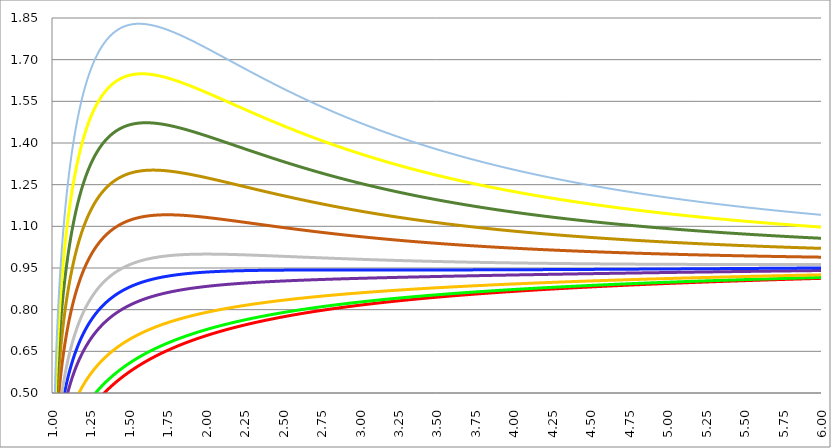
| Category | Series 1 | Series 0 | Series 3 | Series 4 | Series 5 | Series 2 | Series 6 | Series 7 | Series 8 | Series 9 | Series 10 |
|---|---|---|---|---|---|---|---|---|---|---|---|
| 1.0 | 0 | 0 | 0 | 0 | 0 | 0 | 0 | 0 | 0 | 0 | 0 |
| 1.0025 | 0.05 | 0.056 | 0.071 | 0.09 | 0.1 | 0.111 | 0.134 | 0.158 | 0.181 | 0.205 | 0.23 |
| 1.005 | 0.071 | 0.079 | 0.1 | 0.127 | 0.141 | 0.157 | 0.189 | 0.222 | 0.256 | 0.289 | 0.324 |
| 1.0075 | 0.086 | 0.096 | 0.122 | 0.155 | 0.172 | 0.192 | 0.231 | 0.271 | 0.312 | 0.353 | 0.395 |
| 1.01 | 0.1 | 0.111 | 0.14 | 0.178 | 0.198 | 0.221 | 0.266 | 0.312 | 0.359 | 0.406 | 0.454 |
| 1.0125 | 0.111 | 0.124 | 0.156 | 0.199 | 0.22 | 0.246 | 0.296 | 0.347 | 0.4 | 0.453 | 0.506 |
| 1.015 | 0.122 | 0.136 | 0.171 | 0.217 | 0.24 | 0.269 | 0.323 | 0.379 | 0.436 | 0.494 | 0.553 |
| 1.0175 | 0.131 | 0.146 | 0.184 | 0.234 | 0.259 | 0.289 | 0.348 | 0.408 | 0.47 | 0.532 | 0.595 |
| 1.02 | 0.14 | 0.156 | 0.196 | 0.249 | 0.276 | 0.308 | 0.371 | 0.435 | 0.5 | 0.567 | 0.633 |
| 1.0225 | 0.148 | 0.165 | 0.207 | 0.263 | 0.292 | 0.326 | 0.392 | 0.46 | 0.529 | 0.599 | 0.669 |
| 1.024999999999999 | 0.156 | 0.174 | 0.218 | 0.277 | 0.307 | 0.342 | 0.412 | 0.483 | 0.556 | 0.629 | 0.703 |
| 1.027499999999999 | 0.164 | 0.182 | 0.228 | 0.289 | 0.321 | 0.358 | 0.43 | 0.505 | 0.581 | 0.658 | 0.735 |
| 1.029999999999999 | 0.171 | 0.19 | 0.238 | 0.301 | 0.334 | 0.373 | 0.448 | 0.526 | 0.605 | 0.684 | 0.765 |
| 1.032499999999999 | 0.177 | 0.197 | 0.247 | 0.313 | 0.346 | 0.387 | 0.465 | 0.545 | 0.627 | 0.71 | 0.793 |
| 1.034999999999999 | 0.184 | 0.204 | 0.256 | 0.324 | 0.358 | 0.4 | 0.481 | 0.564 | 0.648 | 0.734 | 0.82 |
| 1.037499999999999 | 0.19 | 0.211 | 0.264 | 0.334 | 0.37 | 0.413 | 0.496 | 0.582 | 0.669 | 0.757 | 0.846 |
| 1.039999999999999 | 0.196 | 0.218 | 0.272 | 0.344 | 0.381 | 0.425 | 0.511 | 0.599 | 0.689 | 0.779 | 0.871 |
| 1.042499999999999 | 0.202 | 0.224 | 0.28 | 0.354 | 0.392 | 0.437 | 0.525 | 0.615 | 0.707 | 0.801 | 0.895 |
| 1.044999999999999 | 0.208 | 0.23 | 0.287 | 0.363 | 0.402 | 0.448 | 0.538 | 0.631 | 0.725 | 0.821 | 0.917 |
| 1.047499999999999 | 0.213 | 0.236 | 0.294 | 0.372 | 0.411 | 0.459 | 0.551 | 0.646 | 0.743 | 0.841 | 0.939 |
| 1.049999999999999 | 0.218 | 0.242 | 0.301 | 0.381 | 0.421 | 0.469 | 0.564 | 0.661 | 0.759 | 0.859 | 0.96 |
| 1.052499999999999 | 0.223 | 0.247 | 0.308 | 0.389 | 0.43 | 0.48 | 0.576 | 0.675 | 0.776 | 0.878 | 0.981 |
| 1.054999999999999 | 0.228 | 0.253 | 0.315 | 0.397 | 0.439 | 0.489 | 0.587 | 0.688 | 0.791 | 0.895 | 1 |
| 1.057499999999999 | 0.233 | 0.258 | 0.321 | 0.405 | 0.447 | 0.499 | 0.599 | 0.701 | 0.806 | 0.912 | 1.019 |
| 1.059999999999999 | 0.238 | 0.263 | 0.327 | 0.412 | 0.456 | 0.508 | 0.609 | 0.714 | 0.821 | 0.929 | 1.038 |
| 1.062499999999999 | 0.243 | 0.268 | 0.333 | 0.42 | 0.464 | 0.517 | 0.62 | 0.726 | 0.835 | 0.945 | 1.055 |
| 1.064999999999999 | 0.247 | 0.273 | 0.339 | 0.427 | 0.472 | 0.526 | 0.63 | 0.738 | 0.849 | 0.96 | 1.073 |
| 1.067499999999999 | 0.251 | 0.278 | 0.345 | 0.434 | 0.479 | 0.534 | 0.64 | 0.75 | 0.862 | 0.975 | 1.089 |
| 1.069999999999998 | 0.256 | 0.282 | 0.35 | 0.44 | 0.487 | 0.542 | 0.65 | 0.761 | 0.875 | 0.99 | 1.106 |
| 1.072499999999998 | 0.26 | 0.287 | 0.355 | 0.447 | 0.494 | 0.55 | 0.659 | 0.772 | 0.887 | 1.004 | 1.121 |
| 1.074999999999998 | 0.264 | 0.291 | 0.361 | 0.453 | 0.501 | 0.558 | 0.669 | 0.783 | 0.9 | 1.018 | 1.137 |
| 1.077499999999998 | 0.268 | 0.296 | 0.366 | 0.46 | 0.508 | 0.565 | 0.678 | 0.793 | 0.911 | 1.031 | 1.152 |
| 1.079999999999998 | 0.272 | 0.3 | 0.371 | 0.466 | 0.514 | 0.573 | 0.686 | 0.804 | 0.923 | 1.044 | 1.166 |
| 1.082499999999998 | 0.276 | 0.304 | 0.376 | 0.472 | 0.521 | 0.58 | 0.695 | 0.813 | 0.934 | 1.057 | 1.18 |
| 1.084999999999998 | 0.28 | 0.308 | 0.381 | 0.478 | 0.527 | 0.587 | 0.703 | 0.823 | 0.945 | 1.069 | 1.194 |
| 1.087499999999998 | 0.284 | 0.312 | 0.385 | 0.483 | 0.533 | 0.594 | 0.711 | 0.832 | 0.956 | 1.081 | 1.208 |
| 1.089999999999998 | 0.287 | 0.316 | 0.39 | 0.489 | 0.539 | 0.6 | 0.719 | 0.841 | 0.966 | 1.093 | 1.221 |
| 1.092499999999998 | 0.291 | 0.32 | 0.394 | 0.494 | 0.545 | 0.607 | 0.727 | 0.85 | 0.977 | 1.104 | 1.233 |
| 1.094999999999998 | 0.295 | 0.324 | 0.399 | 0.5 | 0.551 | 0.613 | 0.734 | 0.859 | 0.986 | 1.116 | 1.246 |
| 1.097499999999998 | 0.298 | 0.328 | 0.403 | 0.505 | 0.557 | 0.62 | 0.741 | 0.868 | 0.996 | 1.126 | 1.258 |
| 1.099999999999998 | 0.302 | 0.331 | 0.407 | 0.51 | 0.562 | 0.626 | 0.749 | 0.876 | 1.006 | 1.137 | 1.27 |
| 1.102499999999998 | 0.305 | 0.335 | 0.412 | 0.515 | 0.568 | 0.632 | 0.756 | 0.884 | 1.015 | 1.148 | 1.281 |
| 1.104999999999998 | 0.308 | 0.338 | 0.416 | 0.52 | 0.573 | 0.637 | 0.763 | 0.892 | 1.024 | 1.158 | 1.293 |
| 1.107499999999998 | 0.312 | 0.342 | 0.42 | 0.525 | 0.578 | 0.643 | 0.769 | 0.9 | 1.033 | 1.168 | 1.304 |
| 1.109999999999998 | 0.315 | 0.345 | 0.424 | 0.529 | 0.583 | 0.649 | 0.776 | 0.907 | 1.041 | 1.177 | 1.314 |
| 1.112499999999998 | 0.318 | 0.349 | 0.428 | 0.534 | 0.588 | 0.654 | 0.782 | 0.915 | 1.05 | 1.187 | 1.325 |
| 1.114999999999998 | 0.321 | 0.352 | 0.431 | 0.538 | 0.593 | 0.66 | 0.788 | 0.922 | 1.058 | 1.196 | 1.335 |
| 1.117499999999997 | 0.324 | 0.355 | 0.435 | 0.543 | 0.598 | 0.665 | 0.795 | 0.929 | 1.066 | 1.205 | 1.345 |
| 1.119999999999997 | 0.327 | 0.358 | 0.439 | 0.547 | 0.603 | 0.67 | 0.801 | 0.936 | 1.074 | 1.214 | 1.355 |
| 1.122499999999997 | 0.33 | 0.362 | 0.442 | 0.551 | 0.607 | 0.675 | 0.807 | 0.943 | 1.082 | 1.223 | 1.365 |
| 1.124999999999997 | 0.333 | 0.365 | 0.446 | 0.556 | 0.612 | 0.68 | 0.812 | 0.949 | 1.089 | 1.231 | 1.374 |
| 1.127499999999997 | 0.336 | 0.368 | 0.449 | 0.56 | 0.616 | 0.685 | 0.818 | 0.956 | 1.097 | 1.239 | 1.384 |
| 1.129999999999997 | 0.339 | 0.371 | 0.453 | 0.564 | 0.621 | 0.69 | 0.823 | 0.962 | 1.104 | 1.248 | 1.393 |
| 1.132499999999997 | 0.342 | 0.374 | 0.456 | 0.568 | 0.625 | 0.694 | 0.829 | 0.969 | 1.111 | 1.256 | 1.402 |
| 1.134999999999997 | 0.345 | 0.377 | 0.46 | 0.572 | 0.629 | 0.699 | 0.834 | 0.975 | 1.118 | 1.263 | 1.41 |
| 1.137499999999997 | 0.348 | 0.38 | 0.463 | 0.575 | 0.633 | 0.703 | 0.84 | 0.981 | 1.125 | 1.271 | 1.419 |
| 1.139999999999997 | 0.35 | 0.383 | 0.466 | 0.579 | 0.637 | 0.708 | 0.845 | 0.987 | 1.132 | 1.279 | 1.427 |
| 1.142499999999997 | 0.353 | 0.386 | 0.469 | 0.583 | 0.641 | 0.712 | 0.85 | 0.992 | 1.138 | 1.286 | 1.435 |
| 1.144999999999997 | 0.356 | 0.388 | 0.472 | 0.586 | 0.645 | 0.716 | 0.855 | 0.998 | 1.145 | 1.293 | 1.443 |
| 1.147499999999997 | 0.359 | 0.391 | 0.476 | 0.59 | 0.649 | 0.72 | 0.859 | 1.004 | 1.151 | 1.3 | 1.451 |
| 1.149999999999997 | 0.361 | 0.394 | 0.479 | 0.594 | 0.653 | 0.725 | 0.864 | 1.009 | 1.157 | 1.307 | 1.459 |
| 1.152499999999997 | 0.364 | 0.397 | 0.482 | 0.597 | 0.657 | 0.729 | 0.869 | 1.014 | 1.163 | 1.314 | 1.466 |
| 1.154999999999997 | 0.366 | 0.399 | 0.485 | 0.6 | 0.66 | 0.733 | 0.873 | 1.02 | 1.169 | 1.321 | 1.474 |
| 1.157499999999997 | 0.369 | 0.402 | 0.487 | 0.604 | 0.664 | 0.736 | 0.878 | 1.025 | 1.175 | 1.327 | 1.481 |
| 1.159999999999997 | 0.371 | 0.404 | 0.49 | 0.607 | 0.667 | 0.74 | 0.882 | 1.03 | 1.181 | 1.333 | 1.488 |
| 1.162499999999997 | 0.374 | 0.407 | 0.493 | 0.61 | 0.671 | 0.744 | 0.887 | 1.035 | 1.186 | 1.34 | 1.495 |
| 1.164999999999996 | 0.376 | 0.41 | 0.496 | 0.614 | 0.674 | 0.748 | 0.891 | 1.04 | 1.192 | 1.346 | 1.502 |
| 1.167499999999996 | 0.379 | 0.412 | 0.499 | 0.617 | 0.678 | 0.751 | 0.895 | 1.044 | 1.197 | 1.352 | 1.508 |
| 1.169999999999996 | 0.381 | 0.415 | 0.501 | 0.62 | 0.681 | 0.755 | 0.899 | 1.049 | 1.202 | 1.358 | 1.515 |
| 1.172499999999996 | 0.384 | 0.417 | 0.504 | 0.623 | 0.684 | 0.758 | 0.903 | 1.054 | 1.208 | 1.364 | 1.521 |
| 1.174999999999996 | 0.386 | 0.419 | 0.507 | 0.626 | 0.687 | 0.762 | 0.907 | 1.058 | 1.213 | 1.369 | 1.528 |
| 1.177499999999996 | 0.388 | 0.422 | 0.509 | 0.629 | 0.691 | 0.765 | 0.911 | 1.063 | 1.218 | 1.375 | 1.534 |
| 1.179999999999996 | 0.391 | 0.424 | 0.512 | 0.632 | 0.694 | 0.769 | 0.915 | 1.067 | 1.223 | 1.38 | 1.54 |
| 1.182499999999996 | 0.393 | 0.427 | 0.514 | 0.635 | 0.697 | 0.772 | 0.919 | 1.071 | 1.227 | 1.386 | 1.546 |
| 1.184999999999996 | 0.395 | 0.429 | 0.517 | 0.637 | 0.7 | 0.775 | 0.922 | 1.076 | 1.232 | 1.391 | 1.552 |
| 1.187499999999996 | 0.397 | 0.431 | 0.519 | 0.64 | 0.703 | 0.778 | 0.926 | 1.08 | 1.237 | 1.396 | 1.557 |
| 1.189999999999996 | 0.4 | 0.433 | 0.522 | 0.643 | 0.706 | 0.781 | 0.93 | 1.084 | 1.241 | 1.401 | 1.563 |
| 1.192499999999996 | 0.402 | 0.436 | 0.524 | 0.646 | 0.709 | 0.785 | 0.933 | 1.088 | 1.246 | 1.406 | 1.568 |
| 1.194999999999996 | 0.404 | 0.438 | 0.527 | 0.648 | 0.711 | 0.788 | 0.937 | 1.092 | 1.25 | 1.411 | 1.574 |
| 1.197499999999996 | 0.406 | 0.44 | 0.529 | 0.651 | 0.714 | 0.791 | 0.94 | 1.095 | 1.255 | 1.416 | 1.579 |
| 1.199999999999996 | 0.408 | 0.442 | 0.531 | 0.654 | 0.717 | 0.793 | 0.943 | 1.099 | 1.259 | 1.421 | 1.584 |
| 1.202499999999996 | 0.41 | 0.444 | 0.534 | 0.656 | 0.72 | 0.796 | 0.947 | 1.103 | 1.263 | 1.425 | 1.59 |
| 1.204999999999996 | 0.412 | 0.447 | 0.536 | 0.659 | 0.722 | 0.799 | 0.95 | 1.107 | 1.267 | 1.43 | 1.595 |
| 1.207499999999996 | 0.415 | 0.449 | 0.538 | 0.661 | 0.725 | 0.802 | 0.953 | 1.11 | 1.271 | 1.434 | 1.6 |
| 1.209999999999996 | 0.417 | 0.451 | 0.54 | 0.664 | 0.727 | 0.805 | 0.956 | 1.114 | 1.275 | 1.439 | 1.604 |
| 1.212499999999995 | 0.419 | 0.453 | 0.543 | 0.666 | 0.73 | 0.808 | 0.959 | 1.117 | 1.279 | 1.443 | 1.609 |
| 1.214999999999995 | 0.421 | 0.455 | 0.545 | 0.668 | 0.733 | 0.81 | 0.962 | 1.121 | 1.283 | 1.447 | 1.614 |
| 1.217499999999995 | 0.423 | 0.457 | 0.547 | 0.671 | 0.735 | 0.813 | 0.965 | 1.124 | 1.286 | 1.452 | 1.618 |
| 1.219999999999995 | 0.425 | 0.459 | 0.549 | 0.673 | 0.737 | 0.815 | 0.968 | 1.127 | 1.29 | 1.456 | 1.623 |
| 1.222499999999995 | 0.427 | 0.461 | 0.551 | 0.675 | 0.74 | 0.818 | 0.971 | 1.131 | 1.294 | 1.46 | 1.627 |
| 1.224999999999995 | 0.429 | 0.463 | 0.553 | 0.678 | 0.742 | 0.821 | 0.974 | 1.134 | 1.297 | 1.464 | 1.632 |
| 1.227499999999995 | 0.431 | 0.465 | 0.555 | 0.68 | 0.745 | 0.823 | 0.977 | 1.137 | 1.301 | 1.467 | 1.636 |
| 1.229999999999995 | 0.432 | 0.467 | 0.557 | 0.682 | 0.747 | 0.825 | 0.98 | 1.14 | 1.304 | 1.471 | 1.64 |
| 1.232499999999995 | 0.434 | 0.469 | 0.559 | 0.684 | 0.749 | 0.828 | 0.982 | 1.143 | 1.308 | 1.475 | 1.644 |
| 1.234999999999995 | 0.436 | 0.471 | 0.561 | 0.686 | 0.751 | 0.83 | 0.985 | 1.146 | 1.311 | 1.479 | 1.648 |
| 1.237499999999995 | 0.438 | 0.472 | 0.563 | 0.688 | 0.754 | 0.833 | 0.988 | 1.149 | 1.314 | 1.482 | 1.652 |
| 1.239999999999995 | 0.44 | 0.474 | 0.565 | 0.69 | 0.756 | 0.835 | 0.99 | 1.152 | 1.317 | 1.486 | 1.656 |
| 1.242499999999995 | 0.442 | 0.476 | 0.567 | 0.693 | 0.758 | 0.837 | 0.993 | 1.155 | 1.321 | 1.489 | 1.66 |
| 1.244999999999995 | 0.444 | 0.478 | 0.569 | 0.695 | 0.76 | 0.839 | 0.995 | 1.157 | 1.324 | 1.493 | 1.664 |
| 1.247499999999995 | 0.445 | 0.48 | 0.571 | 0.697 | 0.762 | 0.842 | 0.998 | 1.16 | 1.327 | 1.496 | 1.667 |
| 1.249999999999995 | 0.447 | 0.482 | 0.573 | 0.699 | 0.764 | 0.844 | 1 | 1.163 | 1.33 | 1.499 | 1.671 |
| 1.252499999999995 | 0.449 | 0.483 | 0.575 | 0.701 | 0.766 | 0.846 | 1.002 | 1.165 | 1.333 | 1.503 | 1.674 |
| 1.254999999999995 | 0.451 | 0.485 | 0.576 | 0.702 | 0.768 | 0.848 | 1.005 | 1.168 | 1.335 | 1.506 | 1.678 |
| 1.257499999999994 | 0.453 | 0.487 | 0.578 | 0.704 | 0.77 | 0.85 | 1.007 | 1.171 | 1.338 | 1.509 | 1.681 |
| 1.259999999999994 | 0.454 | 0.489 | 0.58 | 0.706 | 0.772 | 0.852 | 1.009 | 1.173 | 1.341 | 1.512 | 1.685 |
| 1.262499999999994 | 0.456 | 0.49 | 0.582 | 0.708 | 0.774 | 0.854 | 1.012 | 1.176 | 1.344 | 1.515 | 1.688 |
| 1.264999999999994 | 0.458 | 0.492 | 0.583 | 0.71 | 0.776 | 0.856 | 1.014 | 1.178 | 1.347 | 1.518 | 1.691 |
| 1.267499999999994 | 0.459 | 0.494 | 0.585 | 0.712 | 0.778 | 0.858 | 1.016 | 1.18 | 1.349 | 1.521 | 1.694 |
| 1.269999999999994 | 0.461 | 0.496 | 0.587 | 0.714 | 0.78 | 0.86 | 1.018 | 1.183 | 1.352 | 1.524 | 1.698 |
| 1.272499999999994 | 0.463 | 0.497 | 0.589 | 0.715 | 0.782 | 0.862 | 1.02 | 1.185 | 1.354 | 1.526 | 1.701 |
| 1.274999999999994 | 0.464 | 0.499 | 0.59 | 0.717 | 0.783 | 0.864 | 1.022 | 1.187 | 1.357 | 1.529 | 1.704 |
| 1.277499999999994 | 0.466 | 0.5 | 0.592 | 0.719 | 0.785 | 0.866 | 1.024 | 1.19 | 1.359 | 1.532 | 1.707 |
| 1.279999999999994 | 0.468 | 0.502 | 0.594 | 0.721 | 0.787 | 0.868 | 1.026 | 1.192 | 1.362 | 1.535 | 1.71 |
| 1.282499999999994 | 0.469 | 0.504 | 0.595 | 0.722 | 0.789 | 0.869 | 1.028 | 1.194 | 1.364 | 1.537 | 1.712 |
| 1.284999999999994 | 0.471 | 0.505 | 0.597 | 0.724 | 0.79 | 0.871 | 1.03 | 1.196 | 1.366 | 1.54 | 1.715 |
| 1.287499999999994 | 0.473 | 0.507 | 0.598 | 0.726 | 0.792 | 0.873 | 1.032 | 1.198 | 1.369 | 1.542 | 1.718 |
| 1.289999999999994 | 0.474 | 0.509 | 0.6 | 0.727 | 0.794 | 0.875 | 1.034 | 1.2 | 1.371 | 1.545 | 1.721 |
| 1.292499999999994 | 0.476 | 0.51 | 0.601 | 0.729 | 0.795 | 0.876 | 1.036 | 1.202 | 1.373 | 1.547 | 1.723 |
| 1.294999999999994 | 0.477 | 0.512 | 0.603 | 0.73 | 0.797 | 0.878 | 1.038 | 1.204 | 1.375 | 1.55 | 1.726 |
| 1.297499999999994 | 0.479 | 0.513 | 0.605 | 0.732 | 0.799 | 0.88 | 1.039 | 1.206 | 1.378 | 1.552 | 1.728 |
| 1.299999999999994 | 0.48 | 0.515 | 0.606 | 0.733 | 0.8 | 0.881 | 1.041 | 1.208 | 1.38 | 1.554 | 1.731 |
| 1.302499999999994 | 0.482 | 0.516 | 0.608 | 0.735 | 0.802 | 0.883 | 1.043 | 1.21 | 1.382 | 1.556 | 1.733 |
| 1.304999999999993 | 0.483 | 0.518 | 0.609 | 0.737 | 0.803 | 0.885 | 1.045 | 1.212 | 1.384 | 1.559 | 1.736 |
| 1.307499999999993 | 0.485 | 0.519 | 0.611 | 0.738 | 0.805 | 0.886 | 1.046 | 1.214 | 1.386 | 1.561 | 1.738 |
| 1.309999999999993 | 0.486 | 0.521 | 0.612 | 0.74 | 0.806 | 0.888 | 1.048 | 1.216 | 1.388 | 1.563 | 1.74 |
| 1.312499999999993 | 0.488 | 0.522 | 0.613 | 0.741 | 0.808 | 0.889 | 1.05 | 1.217 | 1.39 | 1.565 | 1.743 |
| 1.314999999999993 | 0.489 | 0.524 | 0.615 | 0.742 | 0.809 | 0.891 | 1.051 | 1.219 | 1.392 | 1.567 | 1.745 |
| 1.317499999999993 | 0.491 | 0.525 | 0.616 | 0.744 | 0.811 | 0.892 | 1.053 | 1.221 | 1.393 | 1.569 | 1.747 |
| 1.319999999999993 | 0.492 | 0.527 | 0.618 | 0.745 | 0.812 | 0.894 | 1.055 | 1.223 | 1.395 | 1.571 | 1.749 |
| 1.322499999999993 | 0.494 | 0.528 | 0.619 | 0.747 | 0.814 | 0.895 | 1.056 | 1.224 | 1.397 | 1.573 | 1.751 |
| 1.324999999999993 | 0.495 | 0.529 | 0.62 | 0.748 | 0.815 | 0.897 | 1.058 | 1.226 | 1.399 | 1.575 | 1.753 |
| 1.327499999999993 | 0.497 | 0.531 | 0.622 | 0.749 | 0.817 | 0.898 | 1.059 | 1.227 | 1.401 | 1.577 | 1.755 |
| 1.329999999999993 | 0.498 | 0.532 | 0.623 | 0.751 | 0.818 | 0.9 | 1.061 | 1.229 | 1.402 | 1.579 | 1.757 |
| 1.332499999999993 | 0.5 | 0.534 | 0.625 | 0.752 | 0.819 | 0.901 | 1.062 | 1.231 | 1.404 | 1.581 | 1.759 |
| 1.334999999999993 | 0.501 | 0.535 | 0.626 | 0.753 | 0.821 | 0.902 | 1.063 | 1.232 | 1.406 | 1.582 | 1.761 |
| 1.337499999999993 | 0.502 | 0.536 | 0.627 | 0.755 | 0.822 | 0.904 | 1.065 | 1.234 | 1.407 | 1.584 | 1.763 |
| 1.339999999999993 | 0.504 | 0.538 | 0.629 | 0.756 | 0.823 | 0.905 | 1.066 | 1.235 | 1.409 | 1.586 | 1.765 |
| 1.342499999999993 | 0.505 | 0.539 | 0.63 | 0.757 | 0.824 | 0.906 | 1.068 | 1.237 | 1.41 | 1.587 | 1.767 |
| 1.344999999999993 | 0.506 | 0.54 | 0.631 | 0.759 | 0.826 | 0.908 | 1.069 | 1.238 | 1.412 | 1.589 | 1.769 |
| 1.347499999999993 | 0.508 | 0.542 | 0.632 | 0.76 | 0.827 | 0.909 | 1.07 | 1.239 | 1.413 | 1.591 | 1.77 |
| 1.349999999999992 | 0.509 | 0.543 | 0.634 | 0.761 | 0.828 | 0.91 | 1.072 | 1.241 | 1.415 | 1.592 | 1.772 |
| 1.352499999999992 | 0.511 | 0.544 | 0.635 | 0.762 | 0.829 | 0.911 | 1.073 | 1.242 | 1.416 | 1.594 | 1.774 |
| 1.354999999999992 | 0.512 | 0.546 | 0.636 | 0.764 | 0.831 | 0.913 | 1.074 | 1.243 | 1.418 | 1.595 | 1.775 |
| 1.357499999999992 | 0.513 | 0.547 | 0.637 | 0.765 | 0.832 | 0.914 | 1.075 | 1.245 | 1.419 | 1.597 | 1.777 |
| 1.359999999999992 | 0.514 | 0.548 | 0.639 | 0.766 | 0.833 | 0.915 | 1.077 | 1.246 | 1.421 | 1.598 | 1.778 |
| 1.362499999999992 | 0.516 | 0.549 | 0.64 | 0.767 | 0.834 | 0.916 | 1.078 | 1.247 | 1.422 | 1.6 | 1.78 |
| 1.364999999999992 | 0.517 | 0.551 | 0.641 | 0.768 | 0.835 | 0.917 | 1.079 | 1.249 | 1.423 | 1.601 | 1.781 |
| 1.367499999999992 | 0.518 | 0.552 | 0.642 | 0.769 | 0.837 | 0.918 | 1.08 | 1.25 | 1.424 | 1.603 | 1.783 |
| 1.369999999999992 | 0.52 | 0.553 | 0.643 | 0.771 | 0.838 | 0.92 | 1.081 | 1.251 | 1.426 | 1.604 | 1.784 |
| 1.372499999999992 | 0.521 | 0.554 | 0.645 | 0.772 | 0.839 | 0.921 | 1.083 | 1.252 | 1.427 | 1.605 | 1.786 |
| 1.374999999999992 | 0.522 | 0.556 | 0.646 | 0.773 | 0.84 | 0.922 | 1.084 | 1.253 | 1.428 | 1.606 | 1.787 |
| 1.377499999999992 | 0.523 | 0.557 | 0.647 | 0.774 | 0.841 | 0.923 | 1.085 | 1.255 | 1.429 | 1.608 | 1.788 |
| 1.379999999999992 | 0.525 | 0.558 | 0.648 | 0.775 | 0.842 | 0.924 | 1.086 | 1.256 | 1.431 | 1.609 | 1.79 |
| 1.382499999999992 | 0.526 | 0.559 | 0.649 | 0.776 | 0.843 | 0.925 | 1.087 | 1.257 | 1.432 | 1.61 | 1.791 |
| 1.384999999999992 | 0.527 | 0.561 | 0.65 | 0.777 | 0.844 | 0.926 | 1.088 | 1.258 | 1.433 | 1.611 | 1.792 |
| 1.387499999999992 | 0.528 | 0.562 | 0.651 | 0.778 | 0.845 | 0.927 | 1.089 | 1.259 | 1.434 | 1.613 | 1.794 |
| 1.389999999999992 | 0.53 | 0.563 | 0.653 | 0.779 | 0.846 | 0.928 | 1.09 | 1.26 | 1.435 | 1.614 | 1.795 |
| 1.392499999999992 | 0.531 | 0.564 | 0.654 | 0.78 | 0.847 | 0.929 | 1.091 | 1.261 | 1.436 | 1.615 | 1.796 |
| 1.394999999999992 | 0.532 | 0.565 | 0.655 | 0.781 | 0.848 | 0.93 | 1.092 | 1.262 | 1.437 | 1.616 | 1.797 |
| 1.397499999999991 | 0.533 | 0.566 | 0.656 | 0.782 | 0.849 | 0.931 | 1.093 | 1.263 | 1.438 | 1.617 | 1.798 |
| 1.399999999999991 | 0.535 | 0.568 | 0.657 | 0.783 | 0.85 | 0.932 | 1.094 | 1.264 | 1.439 | 1.618 | 1.799 |
| 1.402499999999991 | 0.536 | 0.569 | 0.658 | 0.784 | 0.851 | 0.933 | 1.095 | 1.265 | 1.44 | 1.619 | 1.8 |
| 1.404999999999991 | 0.537 | 0.57 | 0.659 | 0.785 | 0.852 | 0.934 | 1.096 | 1.266 | 1.441 | 1.62 | 1.801 |
| 1.407499999999991 | 0.538 | 0.571 | 0.66 | 0.786 | 0.853 | 0.935 | 1.097 | 1.267 | 1.442 | 1.621 | 1.802 |
| 1.409999999999991 | 0.539 | 0.572 | 0.661 | 0.787 | 0.854 | 0.936 | 1.098 | 1.268 | 1.443 | 1.622 | 1.803 |
| 1.412499999999991 | 0.54 | 0.573 | 0.662 | 0.788 | 0.855 | 0.937 | 1.099 | 1.269 | 1.444 | 1.623 | 1.804 |
| 1.414999999999991 | 0.542 | 0.574 | 0.663 | 0.789 | 0.856 | 0.938 | 1.099 | 1.269 | 1.445 | 1.624 | 1.805 |
| 1.417499999999991 | 0.543 | 0.575 | 0.664 | 0.79 | 0.857 | 0.939 | 1.1 | 1.27 | 1.446 | 1.625 | 1.806 |
| 1.419999999999991 | 0.544 | 0.577 | 0.665 | 0.791 | 0.858 | 0.939 | 1.101 | 1.271 | 1.447 | 1.626 | 1.807 |
| 1.422499999999991 | 0.545 | 0.578 | 0.666 | 0.792 | 0.859 | 0.94 | 1.102 | 1.272 | 1.447 | 1.627 | 1.808 |
| 1.424999999999991 | 0.546 | 0.579 | 0.667 | 0.793 | 0.86 | 0.941 | 1.103 | 1.273 | 1.448 | 1.627 | 1.809 |
| 1.427499999999991 | 0.547 | 0.58 | 0.668 | 0.794 | 0.86 | 0.942 | 1.104 | 1.274 | 1.449 | 1.628 | 1.81 |
| 1.429999999999991 | 0.548 | 0.581 | 0.669 | 0.795 | 0.861 | 0.943 | 1.104 | 1.274 | 1.45 | 1.629 | 1.811 |
| 1.432499999999991 | 0.549 | 0.582 | 0.67 | 0.796 | 0.862 | 0.944 | 1.105 | 1.275 | 1.451 | 1.63 | 1.811 |
| 1.434999999999991 | 0.551 | 0.583 | 0.671 | 0.796 | 0.863 | 0.944 | 1.106 | 1.276 | 1.451 | 1.63 | 1.812 |
| 1.437499999999991 | 0.552 | 0.584 | 0.672 | 0.797 | 0.864 | 0.945 | 1.107 | 1.277 | 1.452 | 1.631 | 1.813 |
| 1.439999999999991 | 0.553 | 0.585 | 0.673 | 0.798 | 0.865 | 0.946 | 1.107 | 1.277 | 1.453 | 1.632 | 1.814 |
| 1.442499999999991 | 0.554 | 0.586 | 0.674 | 0.799 | 0.865 | 0.947 | 1.108 | 1.278 | 1.454 | 1.633 | 1.814 |
| 1.44499999999999 | 0.555 | 0.587 | 0.675 | 0.8 | 0.866 | 0.948 | 1.109 | 1.279 | 1.454 | 1.633 | 1.815 |
| 1.44749999999999 | 0.556 | 0.588 | 0.676 | 0.801 | 0.867 | 0.948 | 1.11 | 1.279 | 1.455 | 1.634 | 1.816 |
| 1.44999999999999 | 0.557 | 0.589 | 0.677 | 0.802 | 0.868 | 0.949 | 1.11 | 1.28 | 1.456 | 1.635 | 1.816 |
| 1.45249999999999 | 0.558 | 0.59 | 0.678 | 0.802 | 0.869 | 0.95 | 1.111 | 1.281 | 1.456 | 1.635 | 1.817 |
| 1.45499999999999 | 0.559 | 0.591 | 0.679 | 0.803 | 0.869 | 0.951 | 1.112 | 1.281 | 1.457 | 1.636 | 1.818 |
| 1.45749999999999 | 0.56 | 0.592 | 0.679 | 0.804 | 0.87 | 0.951 | 1.112 | 1.282 | 1.457 | 1.636 | 1.818 |
| 1.45999999999999 | 0.561 | 0.593 | 0.68 | 0.805 | 0.871 | 0.952 | 1.113 | 1.283 | 1.458 | 1.637 | 1.819 |
| 1.46249999999999 | 0.562 | 0.594 | 0.681 | 0.806 | 0.872 | 0.953 | 1.114 | 1.283 | 1.459 | 1.638 | 1.819 |
| 1.46499999999999 | 0.563 | 0.595 | 0.682 | 0.806 | 0.872 | 0.953 | 1.114 | 1.284 | 1.459 | 1.638 | 1.82 |
| 1.46749999999999 | 0.564 | 0.596 | 0.683 | 0.807 | 0.873 | 0.954 | 1.115 | 1.284 | 1.46 | 1.639 | 1.82 |
| 1.46999999999999 | 0.565 | 0.597 | 0.684 | 0.808 | 0.874 | 0.955 | 1.116 | 1.285 | 1.46 | 1.639 | 1.821 |
| 1.47249999999999 | 0.566 | 0.598 | 0.685 | 0.809 | 0.875 | 0.955 | 1.116 | 1.286 | 1.461 | 1.64 | 1.821 |
| 1.47499999999999 | 0.567 | 0.599 | 0.686 | 0.809 | 0.875 | 0.956 | 1.117 | 1.286 | 1.461 | 1.64 | 1.822 |
| 1.47749999999999 | 0.568 | 0.6 | 0.686 | 0.81 | 0.876 | 0.957 | 1.117 | 1.287 | 1.462 | 1.641 | 1.822 |
| 1.47999999999999 | 0.569 | 0.601 | 0.687 | 0.811 | 0.877 | 0.957 | 1.118 | 1.287 | 1.462 | 1.641 | 1.823 |
| 1.48249999999999 | 0.57 | 0.602 | 0.688 | 0.812 | 0.877 | 0.958 | 1.118 | 1.288 | 1.463 | 1.642 | 1.823 |
| 1.48499999999999 | 0.571 | 0.603 | 0.689 | 0.812 | 0.878 | 0.959 | 1.119 | 1.288 | 1.463 | 1.642 | 1.824 |
| 1.48749999999999 | 0.572 | 0.604 | 0.69 | 0.813 | 0.879 | 0.959 | 1.12 | 1.289 | 1.464 | 1.642 | 1.824 |
| 1.48999999999999 | 0.573 | 0.605 | 0.691 | 0.814 | 0.879 | 0.96 | 1.12 | 1.289 | 1.464 | 1.643 | 1.824 |
| 1.492499999999989 | 0.574 | 0.606 | 0.691 | 0.814 | 0.88 | 0.96 | 1.121 | 1.29 | 1.464 | 1.643 | 1.825 |
| 1.494999999999989 | 0.575 | 0.607 | 0.692 | 0.815 | 0.881 | 0.961 | 1.121 | 1.29 | 1.465 | 1.644 | 1.825 |
| 1.497499999999989 | 0.576 | 0.608 | 0.693 | 0.816 | 0.881 | 0.962 | 1.122 | 1.291 | 1.465 | 1.644 | 1.825 |
| 1.499999999999989 | 0.577 | 0.609 | 0.694 | 0.816 | 0.882 | 0.962 | 1.122 | 1.291 | 1.466 | 1.644 | 1.826 |
| 1.502499999999989 | 0.578 | 0.609 | 0.695 | 0.817 | 0.883 | 0.963 | 1.123 | 1.291 | 1.466 | 1.645 | 1.826 |
| 1.504999999999989 | 0.579 | 0.61 | 0.695 | 0.818 | 0.883 | 0.963 | 1.123 | 1.292 | 1.466 | 1.645 | 1.826 |
| 1.507499999999989 | 0.58 | 0.611 | 0.696 | 0.819 | 0.884 | 0.964 | 1.124 | 1.292 | 1.467 | 1.645 | 1.827 |
| 1.509999999999989 | 0.581 | 0.612 | 0.697 | 0.819 | 0.884 | 0.965 | 1.124 | 1.293 | 1.467 | 1.646 | 1.827 |
| 1.512499999999989 | 0.582 | 0.613 | 0.698 | 0.82 | 0.885 | 0.965 | 1.125 | 1.293 | 1.467 | 1.646 | 1.827 |
| 1.514999999999989 | 0.583 | 0.614 | 0.699 | 0.82 | 0.886 | 0.966 | 1.125 | 1.293 | 1.468 | 1.646 | 1.827 |
| 1.517499999999989 | 0.584 | 0.615 | 0.699 | 0.821 | 0.886 | 0.966 | 1.125 | 1.294 | 1.468 | 1.646 | 1.828 |
| 1.519999999999989 | 0.585 | 0.616 | 0.7 | 0.822 | 0.887 | 0.967 | 1.126 | 1.294 | 1.468 | 1.647 | 1.828 |
| 1.522499999999989 | 0.586 | 0.617 | 0.701 | 0.822 | 0.887 | 0.967 | 1.126 | 1.294 | 1.469 | 1.647 | 1.828 |
| 1.524999999999989 | 0.587 | 0.617 | 0.702 | 0.823 | 0.888 | 0.968 | 1.127 | 1.295 | 1.469 | 1.647 | 1.828 |
| 1.527499999999989 | 0.588 | 0.618 | 0.702 | 0.824 | 0.888 | 0.968 | 1.127 | 1.295 | 1.469 | 1.647 | 1.828 |
| 1.529999999999989 | 0.589 | 0.619 | 0.703 | 0.824 | 0.889 | 0.969 | 1.128 | 1.295 | 1.469 | 1.647 | 1.828 |
| 1.532499999999989 | 0.589 | 0.62 | 0.704 | 0.825 | 0.89 | 0.969 | 1.128 | 1.296 | 1.47 | 1.648 | 1.829 |
| 1.534999999999989 | 0.59 | 0.621 | 0.705 | 0.825 | 0.89 | 0.97 | 1.128 | 1.296 | 1.47 | 1.648 | 1.829 |
| 1.537499999999989 | 0.591 | 0.622 | 0.705 | 0.826 | 0.891 | 0.97 | 1.129 | 1.296 | 1.47 | 1.648 | 1.829 |
| 1.539999999999988 | 0.592 | 0.623 | 0.706 | 0.827 | 0.891 | 0.971 | 1.129 | 1.297 | 1.47 | 1.648 | 1.829 |
| 1.542499999999988 | 0.593 | 0.623 | 0.707 | 0.827 | 0.892 | 0.971 | 1.129 | 1.297 | 1.471 | 1.648 | 1.829 |
| 1.544999999999988 | 0.594 | 0.624 | 0.707 | 0.828 | 0.892 | 0.972 | 1.13 | 1.297 | 1.471 | 1.648 | 1.829 |
| 1.547499999999988 | 0.595 | 0.625 | 0.708 | 0.828 | 0.893 | 0.972 | 1.13 | 1.297 | 1.471 | 1.649 | 1.829 |
| 1.549999999999988 | 0.596 | 0.626 | 0.709 | 0.829 | 0.893 | 0.972 | 1.13 | 1.298 | 1.471 | 1.649 | 1.829 |
| 1.552499999999988 | 0.597 | 0.627 | 0.71 | 0.83 | 0.894 | 0.973 | 1.131 | 1.298 | 1.471 | 1.649 | 1.829 |
| 1.554999999999988 | 0.597 | 0.628 | 0.71 | 0.83 | 0.894 | 0.973 | 1.131 | 1.298 | 1.471 | 1.649 | 1.829 |
| 1.557499999999988 | 0.598 | 0.628 | 0.711 | 0.831 | 0.895 | 0.974 | 1.131 | 1.298 | 1.472 | 1.649 | 1.829 |
| 1.559999999999988 | 0.599 | 0.629 | 0.712 | 0.831 | 0.895 | 0.974 | 1.132 | 1.299 | 1.472 | 1.649 | 1.829 |
| 1.562499999999988 | 0.6 | 0.63 | 0.712 | 0.832 | 0.896 | 0.975 | 1.132 | 1.299 | 1.472 | 1.649 | 1.829 |
| 1.564999999999988 | 0.601 | 0.631 | 0.713 | 0.832 | 0.896 | 0.975 | 1.132 | 1.299 | 1.472 | 1.649 | 1.829 |
| 1.567499999999988 | 0.602 | 0.632 | 0.714 | 0.833 | 0.897 | 0.975 | 1.133 | 1.299 | 1.472 | 1.649 | 1.829 |
| 1.569999999999988 | 0.603 | 0.632 | 0.714 | 0.833 | 0.897 | 0.976 | 1.133 | 1.299 | 1.472 | 1.649 | 1.829 |
| 1.572499999999988 | 0.603 | 0.633 | 0.715 | 0.834 | 0.898 | 0.976 | 1.133 | 1.3 | 1.472 | 1.649 | 1.829 |
| 1.574999999999988 | 0.604 | 0.634 | 0.716 | 0.834 | 0.898 | 0.977 | 1.134 | 1.3 | 1.472 | 1.649 | 1.829 |
| 1.577499999999988 | 0.605 | 0.635 | 0.716 | 0.835 | 0.899 | 0.977 | 1.134 | 1.3 | 1.472 | 1.649 | 1.829 |
| 1.579999999999988 | 0.606 | 0.635 | 0.717 | 0.835 | 0.899 | 0.977 | 1.134 | 1.3 | 1.473 | 1.649 | 1.829 |
| 1.582499999999988 | 0.607 | 0.636 | 0.718 | 0.836 | 0.899 | 0.978 | 1.134 | 1.3 | 1.473 | 1.649 | 1.829 |
| 1.584999999999988 | 0.608 | 0.637 | 0.718 | 0.836 | 0.9 | 0.978 | 1.135 | 1.301 | 1.473 | 1.649 | 1.829 |
| 1.587499999999987 | 0.608 | 0.638 | 0.719 | 0.837 | 0.9 | 0.979 | 1.135 | 1.301 | 1.473 | 1.649 | 1.829 |
| 1.589999999999987 | 0.609 | 0.639 | 0.72 | 0.837 | 0.901 | 0.979 | 1.135 | 1.301 | 1.473 | 1.649 | 1.828 |
| 1.592499999999987 | 0.61 | 0.639 | 0.72 | 0.838 | 0.901 | 0.979 | 1.135 | 1.301 | 1.473 | 1.649 | 1.828 |
| 1.594999999999987 | 0.611 | 0.64 | 0.721 | 0.838 | 0.902 | 0.98 | 1.136 | 1.301 | 1.473 | 1.649 | 1.828 |
| 1.597499999999987 | 0.612 | 0.641 | 0.722 | 0.839 | 0.902 | 0.98 | 1.136 | 1.301 | 1.473 | 1.649 | 1.828 |
| 1.599999999999987 | 0.612 | 0.642 | 0.722 | 0.839 | 0.902 | 0.98 | 1.136 | 1.301 | 1.473 | 1.649 | 1.828 |
| 1.602499999999987 | 0.613 | 0.642 | 0.723 | 0.84 | 0.903 | 0.981 | 1.136 | 1.301 | 1.473 | 1.649 | 1.828 |
| 1.604999999999987 | 0.614 | 0.643 | 0.723 | 0.84 | 0.903 | 0.981 | 1.136 | 1.302 | 1.473 | 1.649 | 1.828 |
| 1.607499999999987 | 0.615 | 0.644 | 0.724 | 0.841 | 0.904 | 0.981 | 1.137 | 1.302 | 1.473 | 1.649 | 1.827 |
| 1.609999999999987 | 0.616 | 0.645 | 0.725 | 0.841 | 0.904 | 0.982 | 1.137 | 1.302 | 1.473 | 1.649 | 1.827 |
| 1.612499999999987 | 0.616 | 0.645 | 0.725 | 0.842 | 0.904 | 0.982 | 1.137 | 1.302 | 1.473 | 1.648 | 1.827 |
| 1.614999999999987 | 0.617 | 0.646 | 0.726 | 0.842 | 0.905 | 0.982 | 1.137 | 1.302 | 1.473 | 1.648 | 1.827 |
| 1.617499999999987 | 0.618 | 0.647 | 0.726 | 0.843 | 0.905 | 0.983 | 1.137 | 1.302 | 1.473 | 1.648 | 1.827 |
| 1.619999999999987 | 0.619 | 0.647 | 0.727 | 0.843 | 0.906 | 0.983 | 1.138 | 1.302 | 1.473 | 1.648 | 1.826 |
| 1.622499999999987 | 0.619 | 0.648 | 0.728 | 0.844 | 0.906 | 0.983 | 1.138 | 1.302 | 1.473 | 1.648 | 1.826 |
| 1.624999999999987 | 0.62 | 0.649 | 0.728 | 0.844 | 0.906 | 0.983 | 1.138 | 1.302 | 1.473 | 1.648 | 1.826 |
| 1.627499999999987 | 0.621 | 0.65 | 0.729 | 0.844 | 0.907 | 0.984 | 1.138 | 1.302 | 1.473 | 1.648 | 1.826 |
| 1.629999999999986 | 0.622 | 0.65 | 0.729 | 0.845 | 0.907 | 0.984 | 1.138 | 1.302 | 1.473 | 1.647 | 1.825 |
| 1.632499999999986 | 0.622 | 0.651 | 0.73 | 0.845 | 0.908 | 0.984 | 1.138 | 1.302 | 1.473 | 1.647 | 1.825 |
| 1.634999999999986 | 0.623 | 0.652 | 0.731 | 0.846 | 0.908 | 0.985 | 1.139 | 1.302 | 1.472 | 1.647 | 1.825 |
| 1.637499999999986 | 0.624 | 0.652 | 0.731 | 0.846 | 0.908 | 0.985 | 1.139 | 1.302 | 1.472 | 1.647 | 1.825 |
| 1.639999999999986 | 0.625 | 0.653 | 0.732 | 0.847 | 0.909 | 0.985 | 1.139 | 1.302 | 1.472 | 1.647 | 1.824 |
| 1.642499999999986 | 0.625 | 0.654 | 0.732 | 0.847 | 0.909 | 0.985 | 1.139 | 1.302 | 1.472 | 1.647 | 1.824 |
| 1.644999999999986 | 0.626 | 0.654 | 0.733 | 0.847 | 0.909 | 0.986 | 1.139 | 1.302 | 1.472 | 1.646 | 1.824 |
| 1.647499999999986 | 0.627 | 0.655 | 0.733 | 0.848 | 0.91 | 0.986 | 1.139 | 1.302 | 1.472 | 1.646 | 1.824 |
| 1.649999999999986 | 0.628 | 0.656 | 0.734 | 0.848 | 0.91 | 0.986 | 1.139 | 1.302 | 1.472 | 1.646 | 1.823 |
| 1.652499999999986 | 0.628 | 0.657 | 0.734 | 0.849 | 0.91 | 0.987 | 1.14 | 1.302 | 1.472 | 1.646 | 1.823 |
| 1.654999999999986 | 0.629 | 0.657 | 0.735 | 0.849 | 0.911 | 0.987 | 1.14 | 1.302 | 1.472 | 1.645 | 1.823 |
| 1.657499999999986 | 0.63 | 0.658 | 0.736 | 0.849 | 0.911 | 0.987 | 1.14 | 1.302 | 1.472 | 1.645 | 1.822 |
| 1.659999999999986 | 0.631 | 0.659 | 0.736 | 0.85 | 0.911 | 0.987 | 1.14 | 1.302 | 1.471 | 1.645 | 1.822 |
| 1.662499999999986 | 0.631 | 0.659 | 0.737 | 0.85 | 0.912 | 0.988 | 1.14 | 1.302 | 1.471 | 1.645 | 1.822 |
| 1.664999999999986 | 0.632 | 0.66 | 0.737 | 0.851 | 0.912 | 0.988 | 1.14 | 1.302 | 1.471 | 1.645 | 1.821 |
| 1.667499999999986 | 0.633 | 0.661 | 0.738 | 0.851 | 0.912 | 0.988 | 1.14 | 1.302 | 1.471 | 1.644 | 1.821 |
| 1.669999999999986 | 0.633 | 0.661 | 0.738 | 0.851 | 0.913 | 0.988 | 1.14 | 1.302 | 1.471 | 1.644 | 1.821 |
| 1.672499999999986 | 0.634 | 0.662 | 0.739 | 0.852 | 0.913 | 0.988 | 1.14 | 1.302 | 1.471 | 1.644 | 1.82 |
| 1.674999999999986 | 0.635 | 0.662 | 0.739 | 0.852 | 0.913 | 0.989 | 1.14 | 1.302 | 1.471 | 1.644 | 1.82 |
| 1.677499999999985 | 0.636 | 0.663 | 0.74 | 0.853 | 0.913 | 0.989 | 1.141 | 1.302 | 1.47 | 1.643 | 1.819 |
| 1.679999999999985 | 0.636 | 0.664 | 0.74 | 0.853 | 0.914 | 0.989 | 1.141 | 1.302 | 1.47 | 1.643 | 1.819 |
| 1.682499999999985 | 0.637 | 0.664 | 0.741 | 0.853 | 0.914 | 0.989 | 1.141 | 1.302 | 1.47 | 1.643 | 1.819 |
| 1.684999999999985 | 0.638 | 0.665 | 0.741 | 0.854 | 0.914 | 0.99 | 1.141 | 1.302 | 1.47 | 1.642 | 1.818 |
| 1.687499999999985 | 0.638 | 0.666 | 0.742 | 0.854 | 0.915 | 0.99 | 1.141 | 1.302 | 1.47 | 1.642 | 1.818 |
| 1.689999999999985 | 0.639 | 0.666 | 0.742 | 0.854 | 0.915 | 0.99 | 1.141 | 1.302 | 1.47 | 1.642 | 1.817 |
| 1.692499999999985 | 0.64 | 0.667 | 0.743 | 0.855 | 0.915 | 0.99 | 1.141 | 1.302 | 1.469 | 1.641 | 1.817 |
| 1.694999999999985 | 0.64 | 0.668 | 0.743 | 0.855 | 0.916 | 0.99 | 1.141 | 1.302 | 1.469 | 1.641 | 1.817 |
| 1.697499999999985 | 0.641 | 0.668 | 0.744 | 0.855 | 0.916 | 0.991 | 1.141 | 1.302 | 1.469 | 1.641 | 1.816 |
| 1.699999999999985 | 0.642 | 0.669 | 0.744 | 0.856 | 0.916 | 0.991 | 1.141 | 1.302 | 1.469 | 1.641 | 1.816 |
| 1.702499999999985 | 0.642 | 0.669 | 0.745 | 0.856 | 0.916 | 0.991 | 1.141 | 1.301 | 1.469 | 1.64 | 1.815 |
| 1.704999999999985 | 0.643 | 0.67 | 0.745 | 0.856 | 0.917 | 0.991 | 1.141 | 1.301 | 1.468 | 1.64 | 1.815 |
| 1.707499999999985 | 0.644 | 0.671 | 0.746 | 0.857 | 0.917 | 0.991 | 1.141 | 1.301 | 1.468 | 1.64 | 1.814 |
| 1.709999999999985 | 0.644 | 0.671 | 0.746 | 0.857 | 0.917 | 0.992 | 1.141 | 1.301 | 1.468 | 1.639 | 1.814 |
| 1.712499999999985 | 0.645 | 0.672 | 0.747 | 0.857 | 0.917 | 0.992 | 1.141 | 1.301 | 1.468 | 1.639 | 1.814 |
| 1.714999999999985 | 0.646 | 0.673 | 0.747 | 0.858 | 0.918 | 0.992 | 1.141 | 1.301 | 1.467 | 1.639 | 1.813 |
| 1.717499999999985 | 0.646 | 0.673 | 0.748 | 0.858 | 0.918 | 0.992 | 1.141 | 1.301 | 1.467 | 1.638 | 1.813 |
| 1.719999999999985 | 0.647 | 0.674 | 0.748 | 0.858 | 0.918 | 0.992 | 1.141 | 1.301 | 1.467 | 1.638 | 1.812 |
| 1.722499999999985 | 0.648 | 0.674 | 0.749 | 0.859 | 0.918 | 0.992 | 1.141 | 1.301 | 1.467 | 1.637 | 1.812 |
| 1.724999999999984 | 0.648 | 0.675 | 0.749 | 0.859 | 0.919 | 0.993 | 1.142 | 1.301 | 1.466 | 1.637 | 1.811 |
| 1.727499999999984 | 0.649 | 0.676 | 0.75 | 0.859 | 0.919 | 0.993 | 1.142 | 1.3 | 1.466 | 1.637 | 1.811 |
| 1.729999999999984 | 0.65 | 0.676 | 0.75 | 0.86 | 0.919 | 0.993 | 1.142 | 1.3 | 1.466 | 1.636 | 1.81 |
| 1.732499999999984 | 0.65 | 0.677 | 0.751 | 0.86 | 0.919 | 0.993 | 1.142 | 1.3 | 1.466 | 1.636 | 1.81 |
| 1.734999999999984 | 0.651 | 0.677 | 0.751 | 0.86 | 0.92 | 0.993 | 1.142 | 1.3 | 1.465 | 1.636 | 1.809 |
| 1.737499999999984 | 0.652 | 0.678 | 0.752 | 0.861 | 0.92 | 0.993 | 1.142 | 1.3 | 1.465 | 1.635 | 1.809 |
| 1.739999999999984 | 0.652 | 0.679 | 0.752 | 0.861 | 0.92 | 0.994 | 1.142 | 1.3 | 1.465 | 1.635 | 1.808 |
| 1.742499999999984 | 0.653 | 0.679 | 0.753 | 0.861 | 0.92 | 0.994 | 1.142 | 1.3 | 1.465 | 1.634 | 1.808 |
| 1.744999999999984 | 0.653 | 0.68 | 0.753 | 0.862 | 0.921 | 0.994 | 1.142 | 1.3 | 1.464 | 1.634 | 1.807 |
| 1.747499999999984 | 0.654 | 0.68 | 0.754 | 0.862 | 0.921 | 0.994 | 1.142 | 1.299 | 1.464 | 1.634 | 1.807 |
| 1.749999999999984 | 0.655 | 0.681 | 0.754 | 0.862 | 0.921 | 0.994 | 1.142 | 1.299 | 1.464 | 1.633 | 1.806 |
| 1.752499999999984 | 0.655 | 0.681 | 0.754 | 0.863 | 0.921 | 0.994 | 1.142 | 1.299 | 1.464 | 1.633 | 1.806 |
| 1.754999999999984 | 0.656 | 0.682 | 0.755 | 0.863 | 0.922 | 0.994 | 1.142 | 1.299 | 1.463 | 1.632 | 1.805 |
| 1.757499999999984 | 0.657 | 0.683 | 0.755 | 0.863 | 0.922 | 0.995 | 1.142 | 1.299 | 1.463 | 1.632 | 1.805 |
| 1.759999999999984 | 0.657 | 0.683 | 0.756 | 0.863 | 0.922 | 0.995 | 1.142 | 1.299 | 1.463 | 1.632 | 1.804 |
| 1.762499999999984 | 0.658 | 0.684 | 0.756 | 0.864 | 0.922 | 0.995 | 1.142 | 1.298 | 1.462 | 1.631 | 1.804 |
| 1.764999999999984 | 0.658 | 0.684 | 0.757 | 0.864 | 0.922 | 0.995 | 1.141 | 1.298 | 1.462 | 1.631 | 1.803 |
| 1.767499999999984 | 0.659 | 0.685 | 0.757 | 0.864 | 0.923 | 0.995 | 1.141 | 1.298 | 1.462 | 1.63 | 1.802 |
| 1.769999999999984 | 0.66 | 0.685 | 0.758 | 0.865 | 0.923 | 0.995 | 1.141 | 1.298 | 1.462 | 1.63 | 1.802 |
| 1.772499999999983 | 0.66 | 0.686 | 0.758 | 0.865 | 0.923 | 0.995 | 1.141 | 1.298 | 1.461 | 1.63 | 1.801 |
| 1.774999999999983 | 0.661 | 0.686 | 0.758 | 0.865 | 0.923 | 0.995 | 1.141 | 1.298 | 1.461 | 1.629 | 1.801 |
| 1.777499999999983 | 0.661 | 0.687 | 0.759 | 0.865 | 0.923 | 0.996 | 1.141 | 1.297 | 1.461 | 1.629 | 1.8 |
| 1.779999999999983 | 0.662 | 0.688 | 0.759 | 0.866 | 0.924 | 0.996 | 1.141 | 1.297 | 1.46 | 1.628 | 1.8 |
| 1.782499999999983 | 0.663 | 0.688 | 0.76 | 0.866 | 0.924 | 0.996 | 1.141 | 1.297 | 1.46 | 1.628 | 1.799 |
| 1.784999999999983 | 0.663 | 0.689 | 0.76 | 0.866 | 0.924 | 0.996 | 1.141 | 1.297 | 1.46 | 1.627 | 1.799 |
| 1.787499999999983 | 0.664 | 0.689 | 0.761 | 0.866 | 0.924 | 0.996 | 1.141 | 1.297 | 1.459 | 1.627 | 1.798 |
| 1.789999999999983 | 0.664 | 0.69 | 0.761 | 0.867 | 0.924 | 0.996 | 1.141 | 1.297 | 1.459 | 1.626 | 1.797 |
| 1.792499999999983 | 0.665 | 0.69 | 0.761 | 0.867 | 0.925 | 0.996 | 1.141 | 1.296 | 1.459 | 1.626 | 1.797 |
| 1.794999999999983 | 0.666 | 0.691 | 0.762 | 0.867 | 0.925 | 0.996 | 1.141 | 1.296 | 1.458 | 1.625 | 1.796 |
| 1.797499999999983 | 0.666 | 0.691 | 0.762 | 0.868 | 0.925 | 0.996 | 1.141 | 1.296 | 1.458 | 1.625 | 1.796 |
| 1.799999999999983 | 0.667 | 0.692 | 0.763 | 0.868 | 0.925 | 0.997 | 1.141 | 1.296 | 1.458 | 1.625 | 1.795 |
| 1.802499999999983 | 0.667 | 0.692 | 0.763 | 0.868 | 0.925 | 0.997 | 1.141 | 1.296 | 1.457 | 1.624 | 1.794 |
| 1.804999999999983 | 0.668 | 0.693 | 0.763 | 0.868 | 0.926 | 0.997 | 1.141 | 1.295 | 1.457 | 1.624 | 1.794 |
| 1.807499999999983 | 0.668 | 0.693 | 0.764 | 0.869 | 0.926 | 0.997 | 1.141 | 1.295 | 1.457 | 1.623 | 1.793 |
| 1.809999999999983 | 0.669 | 0.694 | 0.764 | 0.869 | 0.926 | 0.997 | 1.141 | 1.295 | 1.456 | 1.623 | 1.793 |
| 1.812499999999983 | 0.67 | 0.695 | 0.765 | 0.869 | 0.926 | 0.997 | 1.141 | 1.295 | 1.456 | 1.622 | 1.792 |
| 1.814999999999983 | 0.67 | 0.695 | 0.765 | 0.869 | 0.926 | 0.997 | 1.141 | 1.295 | 1.456 | 1.622 | 1.791 |
| 1.817499999999983 | 0.671 | 0.696 | 0.765 | 0.87 | 0.926 | 0.997 | 1.141 | 1.294 | 1.455 | 1.621 | 1.791 |
| 1.819999999999982 | 0.671 | 0.696 | 0.766 | 0.87 | 0.927 | 0.997 | 1.14 | 1.294 | 1.455 | 1.621 | 1.79 |
| 1.822499999999982 | 0.672 | 0.697 | 0.766 | 0.87 | 0.927 | 0.997 | 1.14 | 1.294 | 1.455 | 1.62 | 1.79 |
| 1.824999999999982 | 0.672 | 0.697 | 0.767 | 0.87 | 0.927 | 0.997 | 1.14 | 1.294 | 1.454 | 1.62 | 1.789 |
| 1.827499999999982 | 0.673 | 0.698 | 0.767 | 0.871 | 0.927 | 0.998 | 1.14 | 1.293 | 1.454 | 1.619 | 1.788 |
| 1.829999999999982 | 0.673 | 0.698 | 0.767 | 0.871 | 0.927 | 0.998 | 1.14 | 1.293 | 1.453 | 1.619 | 1.788 |
| 1.832499999999982 | 0.674 | 0.699 | 0.768 | 0.871 | 0.927 | 0.998 | 1.14 | 1.293 | 1.453 | 1.618 | 1.787 |
| 1.834999999999982 | 0.675 | 0.699 | 0.768 | 0.871 | 0.928 | 0.998 | 1.14 | 1.293 | 1.453 | 1.618 | 1.787 |
| 1.837499999999982 | 0.675 | 0.7 | 0.769 | 0.871 | 0.928 | 0.998 | 1.14 | 1.293 | 1.452 | 1.617 | 1.786 |
| 1.839999999999982 | 0.676 | 0.7 | 0.769 | 0.872 | 0.928 | 0.998 | 1.14 | 1.292 | 1.452 | 1.617 | 1.785 |
| 1.842499999999982 | 0.676 | 0.701 | 0.769 | 0.872 | 0.928 | 0.998 | 1.14 | 1.292 | 1.452 | 1.616 | 1.785 |
| 1.844999999999982 | 0.677 | 0.701 | 0.77 | 0.872 | 0.928 | 0.998 | 1.14 | 1.292 | 1.451 | 1.616 | 1.784 |
| 1.847499999999982 | 0.677 | 0.702 | 0.77 | 0.872 | 0.928 | 0.998 | 1.14 | 1.292 | 1.451 | 1.615 | 1.783 |
| 1.849999999999982 | 0.678 | 0.702 | 0.771 | 0.873 | 0.929 | 0.998 | 1.14 | 1.291 | 1.451 | 1.615 | 1.783 |
| 1.852499999999982 | 0.678 | 0.703 | 0.771 | 0.873 | 0.929 | 0.998 | 1.139 | 1.291 | 1.45 | 1.614 | 1.782 |
| 1.854999999999982 | 0.679 | 0.703 | 0.771 | 0.873 | 0.929 | 0.998 | 1.139 | 1.291 | 1.45 | 1.614 | 1.781 |
| 1.857499999999982 | 0.679 | 0.704 | 0.772 | 0.873 | 0.929 | 0.998 | 1.139 | 1.291 | 1.449 | 1.613 | 1.781 |
| 1.859999999999982 | 0.68 | 0.704 | 0.772 | 0.874 | 0.929 | 0.998 | 1.139 | 1.29 | 1.449 | 1.613 | 1.78 |
| 1.862499999999982 | 0.681 | 0.705 | 0.772 | 0.874 | 0.929 | 0.999 | 1.139 | 1.29 | 1.449 | 1.612 | 1.779 |
| 1.864999999999982 | 0.681 | 0.705 | 0.773 | 0.874 | 0.929 | 0.999 | 1.139 | 1.29 | 1.448 | 1.612 | 1.779 |
| 1.867499999999981 | 0.682 | 0.706 | 0.773 | 0.874 | 0.93 | 0.999 | 1.139 | 1.29 | 1.448 | 1.611 | 1.778 |
| 1.869999999999981 | 0.682 | 0.706 | 0.773 | 0.874 | 0.93 | 0.999 | 1.139 | 1.289 | 1.447 | 1.611 | 1.777 |
| 1.872499999999981 | 0.683 | 0.707 | 0.774 | 0.875 | 0.93 | 0.999 | 1.139 | 1.289 | 1.447 | 1.61 | 1.777 |
| 1.874999999999981 | 0.683 | 0.707 | 0.774 | 0.875 | 0.93 | 0.999 | 1.139 | 1.289 | 1.447 | 1.61 | 1.776 |
| 1.877499999999981 | 0.684 | 0.707 | 0.775 | 0.875 | 0.93 | 0.999 | 1.138 | 1.289 | 1.446 | 1.609 | 1.775 |
| 1.879999999999981 | 0.684 | 0.708 | 0.775 | 0.875 | 0.93 | 0.999 | 1.138 | 1.288 | 1.446 | 1.608 | 1.775 |
| 1.882499999999981 | 0.685 | 0.708 | 0.775 | 0.875 | 0.93 | 0.999 | 1.138 | 1.288 | 1.445 | 1.608 | 1.774 |
| 1.884999999999981 | 0.685 | 0.709 | 0.776 | 0.876 | 0.931 | 0.999 | 1.138 | 1.288 | 1.445 | 1.607 | 1.773 |
| 1.887499999999981 | 0.686 | 0.709 | 0.776 | 0.876 | 0.931 | 0.999 | 1.138 | 1.288 | 1.445 | 1.607 | 1.773 |
| 1.889999999999981 | 0.686 | 0.71 | 0.776 | 0.876 | 0.931 | 0.999 | 1.138 | 1.287 | 1.444 | 1.606 | 1.772 |
| 1.892499999999981 | 0.687 | 0.71 | 0.777 | 0.876 | 0.931 | 0.999 | 1.138 | 1.287 | 1.444 | 1.606 | 1.771 |
| 1.894999999999981 | 0.687 | 0.711 | 0.777 | 0.876 | 0.931 | 0.999 | 1.138 | 1.287 | 1.443 | 1.605 | 1.771 |
| 1.897499999999981 | 0.688 | 0.711 | 0.777 | 0.877 | 0.931 | 0.999 | 1.138 | 1.287 | 1.443 | 1.605 | 1.77 |
| 1.899999999999981 | 0.688 | 0.712 | 0.778 | 0.877 | 0.931 | 0.999 | 1.137 | 1.286 | 1.443 | 1.604 | 1.769 |
| 1.902499999999981 | 0.689 | 0.712 | 0.778 | 0.877 | 0.931 | 0.999 | 1.137 | 1.286 | 1.442 | 1.604 | 1.769 |
| 1.904999999999981 | 0.689 | 0.713 | 0.778 | 0.877 | 0.932 | 0.999 | 1.137 | 1.286 | 1.442 | 1.603 | 1.768 |
| 1.907499999999981 | 0.69 | 0.713 | 0.779 | 0.877 | 0.932 | 0.999 | 1.137 | 1.286 | 1.441 | 1.602 | 1.767 |
| 1.909999999999981 | 0.69 | 0.714 | 0.779 | 0.878 | 0.932 | 0.999 | 1.137 | 1.285 | 1.441 | 1.602 | 1.767 |
| 1.912499999999981 | 0.691 | 0.714 | 0.779 | 0.878 | 0.932 | 0.999 | 1.137 | 1.285 | 1.441 | 1.601 | 1.766 |
| 1.91499999999998 | 0.691 | 0.714 | 0.78 | 0.878 | 0.932 | 0.999 | 1.137 | 1.285 | 1.44 | 1.601 | 1.765 |
| 1.91749999999998 | 0.692 | 0.715 | 0.78 | 0.878 | 0.932 | 1 | 1.137 | 1.284 | 1.44 | 1.6 | 1.765 |
| 1.91999999999998 | 0.692 | 0.715 | 0.78 | 0.878 | 0.932 | 1 | 1.136 | 1.284 | 1.439 | 1.6 | 1.764 |
| 1.92249999999998 | 0.693 | 0.716 | 0.781 | 0.879 | 0.932 | 1 | 1.136 | 1.284 | 1.439 | 1.599 | 1.763 |
| 1.92499999999998 | 0.693 | 0.716 | 0.781 | 0.879 | 0.932 | 1 | 1.136 | 1.284 | 1.438 | 1.599 | 1.762 |
| 1.92749999999998 | 0.694 | 0.717 | 0.781 | 0.879 | 0.933 | 1 | 1.136 | 1.283 | 1.438 | 1.598 | 1.762 |
| 1.92999999999998 | 0.694 | 0.717 | 0.782 | 0.879 | 0.933 | 1 | 1.136 | 1.283 | 1.438 | 1.597 | 1.761 |
| 1.93249999999998 | 0.695 | 0.718 | 0.782 | 0.879 | 0.933 | 1 | 1.136 | 1.283 | 1.437 | 1.597 | 1.76 |
| 1.93499999999998 | 0.695 | 0.718 | 0.782 | 0.88 | 0.933 | 1 | 1.136 | 1.282 | 1.437 | 1.596 | 1.76 |
| 1.93749999999998 | 0.696 | 0.718 | 0.783 | 0.88 | 0.933 | 1 | 1.136 | 1.282 | 1.436 | 1.596 | 1.759 |
| 1.93999999999998 | 0.696 | 0.719 | 0.783 | 0.88 | 0.933 | 1 | 1.135 | 1.282 | 1.436 | 1.595 | 1.758 |
| 1.94249999999998 | 0.697 | 0.719 | 0.783 | 0.88 | 0.933 | 1 | 1.135 | 1.282 | 1.435 | 1.595 | 1.758 |
| 1.94499999999998 | 0.697 | 0.72 | 0.784 | 0.88 | 0.933 | 1 | 1.135 | 1.281 | 1.435 | 1.594 | 1.757 |
| 1.94749999999998 | 0.698 | 0.72 | 0.784 | 0.88 | 0.933 | 1 | 1.135 | 1.281 | 1.435 | 1.593 | 1.756 |
| 1.94999999999998 | 0.698 | 0.721 | 0.784 | 0.881 | 0.934 | 1 | 1.135 | 1.281 | 1.434 | 1.593 | 1.755 |
| 1.95249999999998 | 0.698 | 0.721 | 0.785 | 0.881 | 0.934 | 1 | 1.135 | 1.28 | 1.434 | 1.592 | 1.755 |
| 1.95499999999998 | 0.699 | 0.721 | 0.785 | 0.881 | 0.934 | 1 | 1.135 | 1.28 | 1.433 | 1.592 | 1.754 |
| 1.95749999999998 | 0.699 | 0.722 | 0.785 | 0.881 | 0.934 | 1 | 1.134 | 1.28 | 1.433 | 1.591 | 1.753 |
| 1.95999999999998 | 0.7 | 0.722 | 0.786 | 0.881 | 0.934 | 1 | 1.134 | 1.28 | 1.432 | 1.591 | 1.753 |
| 1.962499999999979 | 0.7 | 0.723 | 0.786 | 0.881 | 0.934 | 1 | 1.134 | 1.279 | 1.432 | 1.59 | 1.752 |
| 1.964999999999979 | 0.701 | 0.723 | 0.786 | 0.882 | 0.934 | 1 | 1.134 | 1.279 | 1.431 | 1.589 | 1.751 |
| 1.967499999999979 | 0.701 | 0.724 | 0.787 | 0.882 | 0.934 | 1 | 1.134 | 1.279 | 1.431 | 1.589 | 1.75 |
| 1.969999999999979 | 0.702 | 0.724 | 0.787 | 0.882 | 0.934 | 1 | 1.134 | 1.278 | 1.431 | 1.588 | 1.75 |
| 1.972499999999979 | 0.702 | 0.724 | 0.787 | 0.882 | 0.934 | 1 | 1.134 | 1.278 | 1.43 | 1.588 | 1.749 |
| 1.974999999999979 | 0.703 | 0.725 | 0.788 | 0.882 | 0.935 | 1 | 1.133 | 1.278 | 1.43 | 1.587 | 1.748 |
| 1.977499999999979 | 0.703 | 0.725 | 0.788 | 0.882 | 0.935 | 1 | 1.133 | 1.277 | 1.429 | 1.586 | 1.748 |
| 1.979999999999979 | 0.704 | 0.726 | 0.788 | 0.883 | 0.935 | 1 | 1.133 | 1.277 | 1.429 | 1.586 | 1.747 |
| 1.982499999999979 | 0.704 | 0.726 | 0.788 | 0.883 | 0.935 | 1 | 1.133 | 1.277 | 1.428 | 1.585 | 1.746 |
| 1.984999999999979 | 0.704 | 0.726 | 0.789 | 0.883 | 0.935 | 1 | 1.133 | 1.277 | 1.428 | 1.585 | 1.745 |
| 1.987499999999979 | 0.705 | 0.727 | 0.789 | 0.883 | 0.935 | 1 | 1.133 | 1.276 | 1.427 | 1.584 | 1.745 |
| 1.989999999999979 | 0.705 | 0.727 | 0.789 | 0.883 | 0.935 | 1 | 1.133 | 1.276 | 1.427 | 1.584 | 1.744 |
| 1.992499999999979 | 0.706 | 0.728 | 0.79 | 0.883 | 0.935 | 1 | 1.132 | 1.276 | 1.427 | 1.583 | 1.743 |
| 1.994999999999979 | 0.706 | 0.728 | 0.79 | 0.884 | 0.935 | 1 | 1.132 | 1.275 | 1.426 | 1.582 | 1.743 |
| 1.997499999999979 | 0.707 | 0.728 | 0.79 | 0.884 | 0.935 | 1 | 1.132 | 1.275 | 1.426 | 1.582 | 1.742 |
| 1.999999999999979 | 0.707 | 0.729 | 0.791 | 0.884 | 0.935 | 1 | 1.132 | 1.275 | 1.425 | 1.581 | 1.741 |
| 2.002499999999979 | 0.708 | 0.729 | 0.791 | 0.884 | 0.935 | 1 | 1.132 | 1.274 | 1.425 | 1.581 | 1.74 |
| 2.004999999999979 | 0.708 | 0.73 | 0.791 | 0.884 | 0.936 | 1 | 1.132 | 1.274 | 1.424 | 1.58 | 1.74 |
| 2.007499999999979 | 0.708 | 0.73 | 0.791 | 0.884 | 0.936 | 1 | 1.131 | 1.274 | 1.424 | 1.579 | 1.739 |
| 2.009999999999978 | 0.709 | 0.73 | 0.792 | 0.884 | 0.936 | 1 | 1.131 | 1.274 | 1.423 | 1.579 | 1.738 |
| 2.012499999999978 | 0.709 | 0.731 | 0.792 | 0.885 | 0.936 | 1 | 1.131 | 1.273 | 1.423 | 1.578 | 1.737 |
| 2.014999999999978 | 0.71 | 0.731 | 0.792 | 0.885 | 0.936 | 1 | 1.131 | 1.273 | 1.422 | 1.578 | 1.737 |
| 2.017499999999978 | 0.71 | 0.732 | 0.793 | 0.885 | 0.936 | 1 | 1.131 | 1.273 | 1.422 | 1.577 | 1.736 |
| 2.019999999999978 | 0.711 | 0.732 | 0.793 | 0.885 | 0.936 | 1 | 1.131 | 1.272 | 1.422 | 1.576 | 1.735 |
| 2.022499999999978 | 0.711 | 0.732 | 0.793 | 0.885 | 0.936 | 1 | 1.13 | 1.272 | 1.421 | 1.576 | 1.734 |
| 2.024999999999978 | 0.711 | 0.733 | 0.793 | 0.885 | 0.936 | 1 | 1.13 | 1.272 | 1.421 | 1.575 | 1.734 |
| 2.027499999999978 | 0.712 | 0.733 | 0.794 | 0.886 | 0.936 | 1 | 1.13 | 1.271 | 1.42 | 1.575 | 1.733 |
| 2.029999999999978 | 0.712 | 0.734 | 0.794 | 0.886 | 0.936 | 1 | 1.13 | 1.271 | 1.42 | 1.574 | 1.732 |
| 2.032499999999978 | 0.713 | 0.734 | 0.794 | 0.886 | 0.936 | 1 | 1.13 | 1.271 | 1.419 | 1.573 | 1.732 |
| 2.034999999999978 | 0.713 | 0.734 | 0.795 | 0.886 | 0.937 | 1 | 1.13 | 1.27 | 1.419 | 1.573 | 1.731 |
| 2.037499999999978 | 0.714 | 0.735 | 0.795 | 0.886 | 0.937 | 1 | 1.13 | 1.27 | 1.418 | 1.572 | 1.73 |
| 2.039999999999978 | 0.714 | 0.735 | 0.795 | 0.886 | 0.937 | 1 | 1.129 | 1.27 | 1.418 | 1.572 | 1.729 |
| 2.042499999999978 | 0.714 | 0.736 | 0.795 | 0.886 | 0.937 | 1 | 1.129 | 1.269 | 1.417 | 1.571 | 1.729 |
| 2.044999999999978 | 0.715 | 0.736 | 0.796 | 0.887 | 0.937 | 1 | 1.129 | 1.269 | 1.417 | 1.57 | 1.728 |
| 2.047499999999978 | 0.715 | 0.736 | 0.796 | 0.887 | 0.937 | 1 | 1.129 | 1.269 | 1.417 | 1.57 | 1.727 |
| 2.049999999999978 | 0.716 | 0.737 | 0.796 | 0.887 | 0.937 | 1 | 1.129 | 1.269 | 1.416 | 1.569 | 1.726 |
| 2.052499999999978 | 0.716 | 0.737 | 0.797 | 0.887 | 0.937 | 1 | 1.129 | 1.268 | 1.416 | 1.569 | 1.726 |
| 2.054999999999978 | 0.717 | 0.737 | 0.797 | 0.887 | 0.937 | 1 | 1.128 | 1.268 | 1.415 | 1.568 | 1.725 |
| 2.057499999999977 | 0.717 | 0.738 | 0.797 | 0.887 | 0.937 | 1 | 1.128 | 1.268 | 1.415 | 1.567 | 1.724 |
| 2.059999999999977 | 0.717 | 0.738 | 0.797 | 0.887 | 0.937 | 1 | 1.128 | 1.267 | 1.414 | 1.567 | 1.723 |
| 2.062499999999977 | 0.718 | 0.739 | 0.798 | 0.887 | 0.937 | 1 | 1.128 | 1.267 | 1.414 | 1.566 | 1.723 |
| 2.064999999999977 | 0.718 | 0.739 | 0.798 | 0.888 | 0.937 | 1 | 1.128 | 1.267 | 1.413 | 1.566 | 1.722 |
| 2.067499999999977 | 0.719 | 0.739 | 0.798 | 0.888 | 0.937 | 1 | 1.128 | 1.266 | 1.413 | 1.565 | 1.721 |
| 2.069999999999977 | 0.719 | 0.74 | 0.798 | 0.888 | 0.937 | 1 | 1.127 | 1.266 | 1.412 | 1.564 | 1.72 |
| 2.072499999999977 | 0.719 | 0.74 | 0.799 | 0.888 | 0.938 | 1 | 1.127 | 1.266 | 1.412 | 1.564 | 1.72 |
| 2.074999999999977 | 0.72 | 0.74 | 0.799 | 0.888 | 0.938 | 1 | 1.127 | 1.265 | 1.411 | 1.563 | 1.719 |
| 2.077499999999977 | 0.72 | 0.741 | 0.799 | 0.888 | 0.938 | 1 | 1.127 | 1.265 | 1.411 | 1.562 | 1.718 |
| 2.079999999999977 | 0.721 | 0.741 | 0.8 | 0.888 | 0.938 | 1 | 1.127 | 1.265 | 1.41 | 1.562 | 1.717 |
| 2.082499999999977 | 0.721 | 0.741 | 0.8 | 0.889 | 0.938 | 1 | 1.126 | 1.264 | 1.41 | 1.561 | 1.717 |
| 2.084999999999977 | 0.721 | 0.742 | 0.8 | 0.889 | 0.938 | 1 | 1.126 | 1.264 | 1.41 | 1.561 | 1.716 |
| 2.087499999999977 | 0.722 | 0.742 | 0.8 | 0.889 | 0.938 | 1 | 1.126 | 1.264 | 1.409 | 1.56 | 1.715 |
| 2.089999999999977 | 0.722 | 0.743 | 0.801 | 0.889 | 0.938 | 1 | 1.126 | 1.263 | 1.409 | 1.559 | 1.714 |
| 2.092499999999977 | 0.723 | 0.743 | 0.801 | 0.889 | 0.938 | 1 | 1.126 | 1.263 | 1.408 | 1.559 | 1.714 |
| 2.094999999999977 | 0.723 | 0.743 | 0.801 | 0.889 | 0.938 | 1 | 1.126 | 1.263 | 1.408 | 1.558 | 1.713 |
| 2.097499999999977 | 0.723 | 0.744 | 0.801 | 0.889 | 0.938 | 0.999 | 1.125 | 1.262 | 1.407 | 1.558 | 1.712 |
| 2.099999999999977 | 0.724 | 0.744 | 0.802 | 0.889 | 0.938 | 0.999 | 1.125 | 1.262 | 1.407 | 1.557 | 1.711 |
| 2.102499999999976 | 0.724 | 0.744 | 0.802 | 0.89 | 0.938 | 0.999 | 1.125 | 1.262 | 1.406 | 1.556 | 1.711 |
| 2.104999999999976 | 0.725 | 0.745 | 0.802 | 0.89 | 0.938 | 0.999 | 1.125 | 1.261 | 1.406 | 1.556 | 1.71 |
| 2.107499999999976 | 0.725 | 0.745 | 0.802 | 0.89 | 0.938 | 0.999 | 1.125 | 1.261 | 1.405 | 1.555 | 1.709 |
| 2.109999999999976 | 0.725 | 0.745 | 0.803 | 0.89 | 0.938 | 0.999 | 1.125 | 1.261 | 1.405 | 1.555 | 1.708 |
| 2.112499999999976 | 0.726 | 0.746 | 0.803 | 0.89 | 0.938 | 0.999 | 1.124 | 1.26 | 1.404 | 1.554 | 1.708 |
| 2.114999999999976 | 0.726 | 0.746 | 0.803 | 0.89 | 0.938 | 0.999 | 1.124 | 1.26 | 1.404 | 1.553 | 1.707 |
| 2.117499999999976 | 0.726 | 0.746 | 0.803 | 0.89 | 0.939 | 0.999 | 1.124 | 1.26 | 1.403 | 1.553 | 1.706 |
| 2.119999999999976 | 0.727 | 0.747 | 0.804 | 0.89 | 0.939 | 0.999 | 1.124 | 1.259 | 1.403 | 1.552 | 1.705 |
| 2.122499999999976 | 0.727 | 0.747 | 0.804 | 0.891 | 0.939 | 0.999 | 1.124 | 1.259 | 1.402 | 1.551 | 1.705 |
| 2.124999999999976 | 0.728 | 0.747 | 0.804 | 0.891 | 0.939 | 0.999 | 1.123 | 1.259 | 1.402 | 1.551 | 1.704 |
| 2.127499999999976 | 0.728 | 0.748 | 0.804 | 0.891 | 0.939 | 0.999 | 1.123 | 1.258 | 1.402 | 1.55 | 1.703 |
| 2.129999999999976 | 0.728 | 0.748 | 0.805 | 0.891 | 0.939 | 0.999 | 1.123 | 1.258 | 1.401 | 1.55 | 1.702 |
| 2.132499999999976 | 0.729 | 0.749 | 0.805 | 0.891 | 0.939 | 0.999 | 1.123 | 1.258 | 1.401 | 1.549 | 1.702 |
| 2.134999999999976 | 0.729 | 0.749 | 0.805 | 0.891 | 0.939 | 0.999 | 1.123 | 1.257 | 1.4 | 1.548 | 1.701 |
| 2.137499999999976 | 0.729 | 0.749 | 0.805 | 0.891 | 0.939 | 0.999 | 1.123 | 1.257 | 1.4 | 1.548 | 1.7 |
| 2.139999999999976 | 0.73 | 0.75 | 0.806 | 0.891 | 0.939 | 0.999 | 1.122 | 1.257 | 1.399 | 1.547 | 1.699 |
| 2.142499999999976 | 0.73 | 0.75 | 0.806 | 0.891 | 0.939 | 0.999 | 1.122 | 1.256 | 1.399 | 1.547 | 1.699 |
| 2.144999999999976 | 0.731 | 0.75 | 0.806 | 0.892 | 0.939 | 0.999 | 1.122 | 1.256 | 1.398 | 1.546 | 1.698 |
| 2.147499999999976 | 0.731 | 0.751 | 0.806 | 0.892 | 0.939 | 0.999 | 1.122 | 1.256 | 1.398 | 1.545 | 1.697 |
| 2.149999999999975 | 0.731 | 0.751 | 0.807 | 0.892 | 0.939 | 0.999 | 1.122 | 1.256 | 1.397 | 1.545 | 1.696 |
| 2.152499999999975 | 0.732 | 0.751 | 0.807 | 0.892 | 0.939 | 0.999 | 1.121 | 1.255 | 1.397 | 1.544 | 1.696 |
| 2.154999999999975 | 0.732 | 0.752 | 0.807 | 0.892 | 0.939 | 0.999 | 1.121 | 1.255 | 1.396 | 1.544 | 1.695 |
| 2.157499999999975 | 0.732 | 0.752 | 0.807 | 0.892 | 0.939 | 0.999 | 1.121 | 1.255 | 1.396 | 1.543 | 1.694 |
| 2.159999999999975 | 0.733 | 0.752 | 0.808 | 0.892 | 0.939 | 0.999 | 1.121 | 1.254 | 1.395 | 1.542 | 1.693 |
| 2.162499999999975 | 0.733 | 0.753 | 0.808 | 0.892 | 0.939 | 0.999 | 1.121 | 1.254 | 1.395 | 1.542 | 1.693 |
| 2.164999999999975 | 0.734 | 0.753 | 0.808 | 0.892 | 0.939 | 0.999 | 1.121 | 1.254 | 1.394 | 1.541 | 1.692 |
| 2.167499999999975 | 0.734 | 0.753 | 0.808 | 0.893 | 0.939 | 0.999 | 1.12 | 1.253 | 1.394 | 1.54 | 1.691 |
| 2.169999999999975 | 0.734 | 0.754 | 0.808 | 0.893 | 0.94 | 0.999 | 1.12 | 1.253 | 1.393 | 1.54 | 1.691 |
| 2.172499999999975 | 0.735 | 0.754 | 0.809 | 0.893 | 0.94 | 0.999 | 1.12 | 1.253 | 1.393 | 1.539 | 1.69 |
| 2.174999999999975 | 0.735 | 0.754 | 0.809 | 0.893 | 0.94 | 0.999 | 1.12 | 1.252 | 1.393 | 1.539 | 1.689 |
| 2.177499999999975 | 0.735 | 0.754 | 0.809 | 0.893 | 0.94 | 0.998 | 1.12 | 1.252 | 1.392 | 1.538 | 1.688 |
| 2.179999999999975 | 0.736 | 0.755 | 0.809 | 0.893 | 0.94 | 0.998 | 1.119 | 1.252 | 1.392 | 1.537 | 1.688 |
| 2.182499999999975 | 0.736 | 0.755 | 0.81 | 0.893 | 0.94 | 0.998 | 1.119 | 1.251 | 1.391 | 1.537 | 1.687 |
| 2.184999999999975 | 0.736 | 0.755 | 0.81 | 0.893 | 0.94 | 0.998 | 1.119 | 1.251 | 1.391 | 1.536 | 1.686 |
| 2.187499999999975 | 0.737 | 0.756 | 0.81 | 0.893 | 0.94 | 0.998 | 1.119 | 1.251 | 1.39 | 1.536 | 1.685 |
| 2.189999999999975 | 0.737 | 0.756 | 0.81 | 0.893 | 0.94 | 0.998 | 1.119 | 1.25 | 1.39 | 1.535 | 1.685 |
| 2.192499999999975 | 0.737 | 0.756 | 0.811 | 0.894 | 0.94 | 0.998 | 1.119 | 1.25 | 1.389 | 1.534 | 1.684 |
| 2.194999999999974 | 0.738 | 0.757 | 0.811 | 0.894 | 0.94 | 0.998 | 1.118 | 1.25 | 1.389 | 1.534 | 1.683 |
| 2.197499999999974 | 0.738 | 0.757 | 0.811 | 0.894 | 0.94 | 0.998 | 1.118 | 1.249 | 1.388 | 1.533 | 1.682 |
| 2.199999999999974 | 0.739 | 0.757 | 0.811 | 0.894 | 0.94 | 0.998 | 1.118 | 1.249 | 1.388 | 1.533 | 1.682 |
| 2.202499999999974 | 0.739 | 0.758 | 0.811 | 0.894 | 0.94 | 0.998 | 1.118 | 1.249 | 1.387 | 1.532 | 1.681 |
| 2.204999999999974 | 0.739 | 0.758 | 0.812 | 0.894 | 0.94 | 0.998 | 1.118 | 1.248 | 1.387 | 1.531 | 1.68 |
| 2.207499999999974 | 0.74 | 0.758 | 0.812 | 0.894 | 0.94 | 0.998 | 1.117 | 1.248 | 1.386 | 1.531 | 1.679 |
| 2.209999999999974 | 0.74 | 0.759 | 0.812 | 0.894 | 0.94 | 0.998 | 1.117 | 1.248 | 1.386 | 1.53 | 1.679 |
| 2.212499999999974 | 0.74 | 0.759 | 0.812 | 0.894 | 0.94 | 0.998 | 1.117 | 1.247 | 1.385 | 1.529 | 1.678 |
| 2.214999999999974 | 0.741 | 0.759 | 0.813 | 0.894 | 0.94 | 0.998 | 1.117 | 1.247 | 1.385 | 1.529 | 1.677 |
| 2.217499999999974 | 0.741 | 0.76 | 0.813 | 0.895 | 0.94 | 0.998 | 1.117 | 1.247 | 1.384 | 1.528 | 1.676 |
| 2.219999999999974 | 0.741 | 0.76 | 0.813 | 0.895 | 0.94 | 0.998 | 1.116 | 1.246 | 1.384 | 1.528 | 1.676 |
| 2.222499999999974 | 0.742 | 0.76 | 0.813 | 0.895 | 0.94 | 0.998 | 1.116 | 1.246 | 1.384 | 1.527 | 1.675 |
| 2.224999999999974 | 0.742 | 0.761 | 0.813 | 0.895 | 0.94 | 0.998 | 1.116 | 1.246 | 1.383 | 1.526 | 1.674 |
| 2.227499999999974 | 0.742 | 0.761 | 0.814 | 0.895 | 0.94 | 0.998 | 1.116 | 1.245 | 1.383 | 1.526 | 1.673 |
| 2.229999999999974 | 0.743 | 0.761 | 0.814 | 0.895 | 0.94 | 0.998 | 1.116 | 1.245 | 1.382 | 1.525 | 1.673 |
| 2.232499999999974 | 0.743 | 0.761 | 0.814 | 0.895 | 0.94 | 0.998 | 1.116 | 1.245 | 1.382 | 1.525 | 1.672 |
| 2.234999999999974 | 0.743 | 0.762 | 0.814 | 0.895 | 0.94 | 0.998 | 1.115 | 1.244 | 1.381 | 1.524 | 1.671 |
| 2.237499999999974 | 0.744 | 0.762 | 0.815 | 0.895 | 0.94 | 0.997 | 1.115 | 1.244 | 1.381 | 1.523 | 1.67 |
| 2.239999999999974 | 0.744 | 0.762 | 0.815 | 0.895 | 0.941 | 0.997 | 1.115 | 1.244 | 1.38 | 1.523 | 1.67 |
| 2.242499999999973 | 0.744 | 0.763 | 0.815 | 0.896 | 0.941 | 0.997 | 1.115 | 1.243 | 1.38 | 1.522 | 1.669 |
| 2.244999999999973 | 0.745 | 0.763 | 0.815 | 0.896 | 0.941 | 0.997 | 1.115 | 1.243 | 1.379 | 1.522 | 1.668 |
| 2.247499999999973 | 0.745 | 0.763 | 0.815 | 0.896 | 0.941 | 0.997 | 1.114 | 1.243 | 1.379 | 1.521 | 1.667 |
| 2.249999999999973 | 0.745 | 0.764 | 0.816 | 0.896 | 0.941 | 0.997 | 1.114 | 1.242 | 1.378 | 1.52 | 1.667 |
| 2.252499999999973 | 0.746 | 0.764 | 0.816 | 0.896 | 0.941 | 0.997 | 1.114 | 1.242 | 1.378 | 1.52 | 1.666 |
| 2.254999999999973 | 0.746 | 0.764 | 0.816 | 0.896 | 0.941 | 0.997 | 1.114 | 1.242 | 1.377 | 1.519 | 1.665 |
| 2.257499999999973 | 0.746 | 0.764 | 0.816 | 0.896 | 0.941 | 0.997 | 1.114 | 1.241 | 1.377 | 1.519 | 1.664 |
| 2.259999999999973 | 0.747 | 0.765 | 0.817 | 0.896 | 0.941 | 0.997 | 1.113 | 1.241 | 1.376 | 1.518 | 1.664 |
| 2.262499999999973 | 0.747 | 0.765 | 0.817 | 0.896 | 0.941 | 0.997 | 1.113 | 1.241 | 1.376 | 1.517 | 1.663 |
| 2.264999999999973 | 0.747 | 0.765 | 0.817 | 0.896 | 0.941 | 0.997 | 1.113 | 1.24 | 1.376 | 1.517 | 1.662 |
| 2.267499999999973 | 0.748 | 0.766 | 0.817 | 0.896 | 0.941 | 0.997 | 1.113 | 1.24 | 1.375 | 1.516 | 1.661 |
| 2.269999999999973 | 0.748 | 0.766 | 0.817 | 0.897 | 0.941 | 0.997 | 1.113 | 1.24 | 1.375 | 1.515 | 1.661 |
| 2.272499999999973 | 0.748 | 0.766 | 0.818 | 0.897 | 0.941 | 0.997 | 1.112 | 1.239 | 1.374 | 1.515 | 1.66 |
| 2.274999999999973 | 0.749 | 0.766 | 0.818 | 0.897 | 0.941 | 0.997 | 1.112 | 1.239 | 1.374 | 1.514 | 1.659 |
| 2.277499999999973 | 0.749 | 0.767 | 0.818 | 0.897 | 0.941 | 0.997 | 1.112 | 1.239 | 1.373 | 1.514 | 1.659 |
| 2.279999999999973 | 0.749 | 0.767 | 0.818 | 0.897 | 0.941 | 0.997 | 1.112 | 1.238 | 1.373 | 1.513 | 1.658 |
| 2.282499999999973 | 0.75 | 0.767 | 0.818 | 0.897 | 0.941 | 0.997 | 1.112 | 1.238 | 1.372 | 1.512 | 1.657 |
| 2.284999999999972 | 0.75 | 0.768 | 0.819 | 0.897 | 0.941 | 0.997 | 1.112 | 1.238 | 1.372 | 1.512 | 1.656 |
| 2.287499999999972 | 0.75 | 0.768 | 0.819 | 0.897 | 0.941 | 0.997 | 1.111 | 1.237 | 1.371 | 1.511 | 1.656 |
| 2.289999999999972 | 0.751 | 0.768 | 0.819 | 0.897 | 0.941 | 0.996 | 1.111 | 1.237 | 1.371 | 1.511 | 1.655 |
| 2.292499999999972 | 0.751 | 0.769 | 0.819 | 0.897 | 0.941 | 0.996 | 1.111 | 1.237 | 1.37 | 1.51 | 1.654 |
| 2.294999999999972 | 0.751 | 0.769 | 0.819 | 0.897 | 0.941 | 0.996 | 1.111 | 1.236 | 1.37 | 1.509 | 1.653 |
| 2.297499999999972 | 0.751 | 0.769 | 0.82 | 0.897 | 0.941 | 0.996 | 1.111 | 1.236 | 1.369 | 1.509 | 1.653 |
| 2.299999999999972 | 0.752 | 0.769 | 0.82 | 0.898 | 0.941 | 0.996 | 1.11 | 1.236 | 1.369 | 1.508 | 1.652 |
| 2.302499999999972 | 0.752 | 0.77 | 0.82 | 0.898 | 0.941 | 0.996 | 1.11 | 1.235 | 1.369 | 1.508 | 1.651 |
| 2.304999999999972 | 0.752 | 0.77 | 0.82 | 0.898 | 0.941 | 0.996 | 1.11 | 1.235 | 1.368 | 1.507 | 1.65 |
| 2.307499999999972 | 0.753 | 0.77 | 0.82 | 0.898 | 0.941 | 0.996 | 1.11 | 1.235 | 1.368 | 1.506 | 1.65 |
| 2.309999999999972 | 0.753 | 0.77 | 0.821 | 0.898 | 0.941 | 0.996 | 1.11 | 1.234 | 1.367 | 1.506 | 1.649 |
| 2.312499999999972 | 0.753 | 0.771 | 0.821 | 0.898 | 0.941 | 0.996 | 1.109 | 1.234 | 1.367 | 1.505 | 1.648 |
| 2.314999999999972 | 0.754 | 0.771 | 0.821 | 0.898 | 0.941 | 0.996 | 1.109 | 1.234 | 1.366 | 1.505 | 1.648 |
| 2.317499999999972 | 0.754 | 0.771 | 0.821 | 0.898 | 0.941 | 0.996 | 1.109 | 1.233 | 1.366 | 1.504 | 1.647 |
| 2.319999999999972 | 0.754 | 0.772 | 0.821 | 0.898 | 0.941 | 0.996 | 1.109 | 1.233 | 1.365 | 1.503 | 1.646 |
| 2.322499999999972 | 0.755 | 0.772 | 0.822 | 0.898 | 0.941 | 0.996 | 1.109 | 1.233 | 1.365 | 1.503 | 1.645 |
| 2.324999999999972 | 0.755 | 0.772 | 0.822 | 0.898 | 0.941 | 0.996 | 1.109 | 1.232 | 1.364 | 1.502 | 1.645 |
| 2.327499999999972 | 0.755 | 0.772 | 0.822 | 0.898 | 0.941 | 0.996 | 1.108 | 1.232 | 1.364 | 1.502 | 1.644 |
| 2.329999999999972 | 0.756 | 0.773 | 0.822 | 0.899 | 0.941 | 0.996 | 1.108 | 1.232 | 1.363 | 1.501 | 1.643 |
| 2.332499999999972 | 0.756 | 0.773 | 0.822 | 0.899 | 0.941 | 0.996 | 1.108 | 1.231 | 1.363 | 1.5 | 1.642 |
| 2.334999999999971 | 0.756 | 0.773 | 0.823 | 0.899 | 0.941 | 0.996 | 1.108 | 1.231 | 1.362 | 1.5 | 1.642 |
| 2.337499999999971 | 0.756 | 0.774 | 0.823 | 0.899 | 0.941 | 0.996 | 1.108 | 1.231 | 1.362 | 1.499 | 1.641 |
| 2.339999999999971 | 0.757 | 0.774 | 0.823 | 0.899 | 0.941 | 0.995 | 1.107 | 1.23 | 1.362 | 1.499 | 1.64 |
| 2.342499999999971 | 0.757 | 0.774 | 0.823 | 0.899 | 0.942 | 0.995 | 1.107 | 1.23 | 1.361 | 1.498 | 1.64 |
| 2.344999999999971 | 0.757 | 0.774 | 0.823 | 0.899 | 0.942 | 0.995 | 1.107 | 1.23 | 1.361 | 1.497 | 1.639 |
| 2.347499999999971 | 0.758 | 0.775 | 0.824 | 0.899 | 0.942 | 0.995 | 1.107 | 1.229 | 1.36 | 1.497 | 1.638 |
| 2.349999999999971 | 0.758 | 0.775 | 0.824 | 0.899 | 0.942 | 0.995 | 1.107 | 1.229 | 1.36 | 1.496 | 1.637 |
| 2.352499999999971 | 0.758 | 0.775 | 0.824 | 0.899 | 0.942 | 0.995 | 1.106 | 1.229 | 1.359 | 1.496 | 1.637 |
| 2.354999999999971 | 0.759 | 0.775 | 0.824 | 0.899 | 0.942 | 0.995 | 1.106 | 1.228 | 1.359 | 1.495 | 1.636 |
| 2.357499999999971 | 0.759 | 0.776 | 0.824 | 0.899 | 0.942 | 0.995 | 1.106 | 1.228 | 1.358 | 1.494 | 1.635 |
| 2.359999999999971 | 0.759 | 0.776 | 0.824 | 0.899 | 0.942 | 0.995 | 1.106 | 1.228 | 1.358 | 1.494 | 1.634 |
| 2.362499999999971 | 0.759 | 0.776 | 0.825 | 0.9 | 0.942 | 0.995 | 1.106 | 1.227 | 1.357 | 1.493 | 1.634 |
| 2.364999999999971 | 0.76 | 0.777 | 0.825 | 0.9 | 0.942 | 0.995 | 1.105 | 1.227 | 1.357 | 1.493 | 1.633 |
| 2.367499999999971 | 0.76 | 0.777 | 0.825 | 0.9 | 0.942 | 0.995 | 1.105 | 1.227 | 1.356 | 1.492 | 1.632 |
| 2.369999999999971 | 0.76 | 0.777 | 0.825 | 0.9 | 0.942 | 0.995 | 1.105 | 1.226 | 1.356 | 1.492 | 1.632 |
| 2.372499999999971 | 0.761 | 0.777 | 0.825 | 0.9 | 0.942 | 0.995 | 1.105 | 1.226 | 1.356 | 1.491 | 1.631 |
| 2.374999999999971 | 0.761 | 0.778 | 0.826 | 0.9 | 0.942 | 0.995 | 1.105 | 1.226 | 1.355 | 1.49 | 1.63 |
| 2.377499999999971 | 0.761 | 0.778 | 0.826 | 0.9 | 0.942 | 0.995 | 1.105 | 1.226 | 1.355 | 1.49 | 1.629 |
| 2.379999999999971 | 0.761 | 0.778 | 0.826 | 0.9 | 0.942 | 0.995 | 1.104 | 1.225 | 1.354 | 1.489 | 1.629 |
| 2.38249999999997 | 0.762 | 0.778 | 0.826 | 0.9 | 0.942 | 0.995 | 1.104 | 1.225 | 1.354 | 1.489 | 1.628 |
| 2.38499999999997 | 0.762 | 0.779 | 0.826 | 0.9 | 0.942 | 0.995 | 1.104 | 1.225 | 1.353 | 1.488 | 1.627 |
| 2.38749999999997 | 0.762 | 0.779 | 0.827 | 0.9 | 0.942 | 0.994 | 1.104 | 1.224 | 1.353 | 1.487 | 1.627 |
| 2.38999999999997 | 0.763 | 0.779 | 0.827 | 0.9 | 0.942 | 0.994 | 1.104 | 1.224 | 1.352 | 1.487 | 1.626 |
| 2.39249999999997 | 0.763 | 0.779 | 0.827 | 0.9 | 0.942 | 0.994 | 1.103 | 1.224 | 1.352 | 1.486 | 1.625 |
| 2.39499999999997 | 0.763 | 0.78 | 0.827 | 0.901 | 0.942 | 0.994 | 1.103 | 1.223 | 1.351 | 1.486 | 1.624 |
| 2.39749999999997 | 0.763 | 0.78 | 0.827 | 0.901 | 0.942 | 0.994 | 1.103 | 1.223 | 1.351 | 1.485 | 1.624 |
| 2.39999999999997 | 0.764 | 0.78 | 0.827 | 0.901 | 0.942 | 0.994 | 1.103 | 1.223 | 1.351 | 1.484 | 1.623 |
| 2.40249999999997 | 0.764 | 0.78 | 0.828 | 0.901 | 0.942 | 0.994 | 1.103 | 1.222 | 1.35 | 1.484 | 1.622 |
| 2.40499999999997 | 0.764 | 0.781 | 0.828 | 0.901 | 0.942 | 0.994 | 1.102 | 1.222 | 1.35 | 1.483 | 1.622 |
| 2.40749999999997 | 0.765 | 0.781 | 0.828 | 0.901 | 0.942 | 0.994 | 1.102 | 1.222 | 1.349 | 1.483 | 1.621 |
| 2.40999999999997 | 0.765 | 0.781 | 0.828 | 0.901 | 0.942 | 0.994 | 1.102 | 1.221 | 1.349 | 1.482 | 1.62 |
| 2.41249999999997 | 0.765 | 0.781 | 0.828 | 0.901 | 0.942 | 0.994 | 1.102 | 1.221 | 1.348 | 1.482 | 1.619 |
| 2.41499999999997 | 0.765 | 0.782 | 0.828 | 0.901 | 0.942 | 0.994 | 1.102 | 1.221 | 1.348 | 1.481 | 1.619 |
| 2.41749999999997 | 0.766 | 0.782 | 0.829 | 0.901 | 0.942 | 0.994 | 1.102 | 1.22 | 1.347 | 1.48 | 1.618 |
| 2.41999999999997 | 0.766 | 0.782 | 0.829 | 0.901 | 0.942 | 0.994 | 1.101 | 1.22 | 1.347 | 1.48 | 1.617 |
| 2.42249999999997 | 0.766 | 0.782 | 0.829 | 0.901 | 0.942 | 0.994 | 1.101 | 1.22 | 1.346 | 1.479 | 1.617 |
| 2.42499999999997 | 0.767 | 0.783 | 0.829 | 0.901 | 0.942 | 0.994 | 1.101 | 1.219 | 1.346 | 1.479 | 1.616 |
| 2.42749999999997 | 0.767 | 0.783 | 0.829 | 0.901 | 0.942 | 0.994 | 1.101 | 1.219 | 1.346 | 1.478 | 1.615 |
| 2.429999999999969 | 0.767 | 0.783 | 0.83 | 0.902 | 0.942 | 0.994 | 1.101 | 1.219 | 1.345 | 1.478 | 1.614 |
| 2.432499999999969 | 0.767 | 0.783 | 0.83 | 0.902 | 0.942 | 0.993 | 1.1 | 1.218 | 1.345 | 1.477 | 1.614 |
| 2.434999999999969 | 0.768 | 0.784 | 0.83 | 0.902 | 0.942 | 0.993 | 1.1 | 1.218 | 1.344 | 1.476 | 1.613 |
| 2.437499999999969 | 0.768 | 0.784 | 0.83 | 0.902 | 0.942 | 0.993 | 1.1 | 1.218 | 1.344 | 1.476 | 1.612 |
| 2.439999999999969 | 0.768 | 0.784 | 0.83 | 0.902 | 0.942 | 0.993 | 1.1 | 1.218 | 1.343 | 1.475 | 1.612 |
| 2.442499999999969 | 0.768 | 0.784 | 0.83 | 0.902 | 0.942 | 0.993 | 1.1 | 1.217 | 1.343 | 1.475 | 1.611 |
| 2.444999999999969 | 0.769 | 0.785 | 0.831 | 0.902 | 0.942 | 0.993 | 1.099 | 1.217 | 1.342 | 1.474 | 1.61 |
| 2.447499999999969 | 0.769 | 0.785 | 0.831 | 0.902 | 0.942 | 0.993 | 1.099 | 1.217 | 1.342 | 1.473 | 1.61 |
| 2.449999999999969 | 0.769 | 0.785 | 0.831 | 0.902 | 0.942 | 0.993 | 1.099 | 1.216 | 1.342 | 1.473 | 1.609 |
| 2.452499999999969 | 0.77 | 0.785 | 0.831 | 0.902 | 0.942 | 0.993 | 1.099 | 1.216 | 1.341 | 1.472 | 1.608 |
| 2.454999999999969 | 0.77 | 0.786 | 0.831 | 0.902 | 0.942 | 0.993 | 1.099 | 1.216 | 1.341 | 1.472 | 1.607 |
| 2.457499999999969 | 0.77 | 0.786 | 0.831 | 0.902 | 0.942 | 0.993 | 1.099 | 1.215 | 1.34 | 1.471 | 1.607 |
| 2.459999999999969 | 0.77 | 0.786 | 0.832 | 0.902 | 0.942 | 0.993 | 1.098 | 1.215 | 1.34 | 1.471 | 1.606 |
| 2.462499999999969 | 0.771 | 0.786 | 0.832 | 0.902 | 0.942 | 0.993 | 1.098 | 1.215 | 1.339 | 1.47 | 1.605 |
| 2.464999999999969 | 0.771 | 0.787 | 0.832 | 0.902 | 0.942 | 0.993 | 1.098 | 1.214 | 1.339 | 1.469 | 1.605 |
| 2.467499999999969 | 0.771 | 0.787 | 0.832 | 0.903 | 0.942 | 0.993 | 1.098 | 1.214 | 1.338 | 1.469 | 1.604 |
| 2.469999999999969 | 0.771 | 0.787 | 0.832 | 0.903 | 0.942 | 0.993 | 1.098 | 1.214 | 1.338 | 1.468 | 1.603 |
| 2.472499999999969 | 0.772 | 0.787 | 0.832 | 0.903 | 0.942 | 0.993 | 1.097 | 1.213 | 1.338 | 1.468 | 1.603 |
| 2.474999999999969 | 0.772 | 0.788 | 0.833 | 0.903 | 0.942 | 0.993 | 1.097 | 1.213 | 1.337 | 1.467 | 1.602 |
| 2.477499999999968 | 0.772 | 0.788 | 0.833 | 0.903 | 0.942 | 0.992 | 1.097 | 1.213 | 1.337 | 1.467 | 1.601 |
| 2.479999999999968 | 0.773 | 0.788 | 0.833 | 0.903 | 0.942 | 0.992 | 1.097 | 1.212 | 1.336 | 1.466 | 1.601 |
| 2.482499999999968 | 0.773 | 0.788 | 0.833 | 0.903 | 0.942 | 0.992 | 1.097 | 1.212 | 1.336 | 1.465 | 1.6 |
| 2.484999999999968 | 0.773 | 0.789 | 0.833 | 0.903 | 0.942 | 0.992 | 1.097 | 1.212 | 1.335 | 1.465 | 1.599 |
| 2.487499999999968 | 0.773 | 0.789 | 0.833 | 0.903 | 0.942 | 0.992 | 1.096 | 1.212 | 1.335 | 1.464 | 1.598 |
| 2.489999999999968 | 0.774 | 0.789 | 0.834 | 0.903 | 0.942 | 0.992 | 1.096 | 1.211 | 1.334 | 1.464 | 1.598 |
| 2.492499999999968 | 0.774 | 0.789 | 0.834 | 0.903 | 0.942 | 0.992 | 1.096 | 1.211 | 1.334 | 1.463 | 1.597 |
| 2.494999999999968 | 0.774 | 0.789 | 0.834 | 0.903 | 0.942 | 0.992 | 1.096 | 1.211 | 1.334 | 1.463 | 1.596 |
| 2.497499999999968 | 0.774 | 0.79 | 0.834 | 0.903 | 0.942 | 0.992 | 1.096 | 1.21 | 1.333 | 1.462 | 1.596 |
| 2.499999999999968 | 0.775 | 0.79 | 0.834 | 0.903 | 0.942 | 0.992 | 1.095 | 1.21 | 1.333 | 1.462 | 1.595 |
| 2.502499999999968 | 0.775 | 0.79 | 0.834 | 0.903 | 0.942 | 0.992 | 1.095 | 1.21 | 1.332 | 1.461 | 1.594 |
| 2.504999999999968 | 0.775 | 0.79 | 0.835 | 0.903 | 0.942 | 0.992 | 1.095 | 1.209 | 1.332 | 1.46 | 1.594 |
| 2.507499999999968 | 0.775 | 0.791 | 0.835 | 0.904 | 0.942 | 0.992 | 1.095 | 1.209 | 1.331 | 1.46 | 1.593 |
| 2.509999999999968 | 0.776 | 0.791 | 0.835 | 0.904 | 0.942 | 0.992 | 1.095 | 1.209 | 1.331 | 1.459 | 1.592 |
| 2.512499999999968 | 0.776 | 0.791 | 0.835 | 0.904 | 0.942 | 0.992 | 1.095 | 1.208 | 1.33 | 1.459 | 1.592 |
| 2.514999999999968 | 0.776 | 0.791 | 0.835 | 0.904 | 0.942 | 0.992 | 1.094 | 1.208 | 1.33 | 1.458 | 1.591 |
| 2.517499999999968 | 0.776 | 0.792 | 0.835 | 0.904 | 0.942 | 0.992 | 1.094 | 1.208 | 1.33 | 1.458 | 1.59 |
| 2.519999999999968 | 0.777 | 0.792 | 0.836 | 0.904 | 0.942 | 0.992 | 1.094 | 1.207 | 1.329 | 1.457 | 1.59 |
| 2.522499999999968 | 0.777 | 0.792 | 0.836 | 0.904 | 0.942 | 0.991 | 1.094 | 1.207 | 1.329 | 1.456 | 1.589 |
| 2.524999999999967 | 0.777 | 0.792 | 0.836 | 0.904 | 0.942 | 0.991 | 1.094 | 1.207 | 1.328 | 1.456 | 1.588 |
| 2.527499999999967 | 0.777 | 0.792 | 0.836 | 0.904 | 0.942 | 0.991 | 1.093 | 1.207 | 1.328 | 1.455 | 1.587 |
| 2.529999999999967 | 0.778 | 0.793 | 0.836 | 0.904 | 0.942 | 0.991 | 1.093 | 1.206 | 1.327 | 1.455 | 1.587 |
| 2.532499999999967 | 0.778 | 0.793 | 0.836 | 0.904 | 0.942 | 0.991 | 1.093 | 1.206 | 1.327 | 1.454 | 1.586 |
| 2.534999999999967 | 0.778 | 0.793 | 0.837 | 0.904 | 0.942 | 0.991 | 1.093 | 1.206 | 1.327 | 1.454 | 1.585 |
| 2.537499999999967 | 0.778 | 0.793 | 0.837 | 0.904 | 0.942 | 0.991 | 1.093 | 1.205 | 1.326 | 1.453 | 1.585 |
| 2.539999999999967 | 0.779 | 0.794 | 0.837 | 0.904 | 0.942 | 0.991 | 1.093 | 1.205 | 1.326 | 1.453 | 1.584 |
| 2.542499999999967 | 0.779 | 0.794 | 0.837 | 0.904 | 0.942 | 0.991 | 1.092 | 1.205 | 1.325 | 1.452 | 1.583 |
| 2.544999999999967 | 0.779 | 0.794 | 0.837 | 0.904 | 0.942 | 0.991 | 1.092 | 1.204 | 1.325 | 1.451 | 1.583 |
| 2.547499999999967 | 0.779 | 0.794 | 0.837 | 0.904 | 0.942 | 0.991 | 1.092 | 1.204 | 1.324 | 1.451 | 1.582 |
| 2.549999999999967 | 0.78 | 0.794 | 0.837 | 0.905 | 0.942 | 0.991 | 1.092 | 1.204 | 1.324 | 1.45 | 1.581 |
| 2.552499999999967 | 0.78 | 0.795 | 0.838 | 0.905 | 0.942 | 0.991 | 1.092 | 1.204 | 1.324 | 1.45 | 1.581 |
| 2.554999999999967 | 0.78 | 0.795 | 0.838 | 0.905 | 0.942 | 0.991 | 1.091 | 1.203 | 1.323 | 1.449 | 1.58 |
| 2.557499999999967 | 0.78 | 0.795 | 0.838 | 0.905 | 0.943 | 0.991 | 1.091 | 1.203 | 1.323 | 1.449 | 1.579 |
| 2.559999999999967 | 0.781 | 0.795 | 0.838 | 0.905 | 0.943 | 0.991 | 1.091 | 1.203 | 1.322 | 1.448 | 1.579 |
| 2.562499999999967 | 0.781 | 0.796 | 0.838 | 0.905 | 0.943 | 0.991 | 1.091 | 1.202 | 1.322 | 1.448 | 1.578 |
| 2.564999999999967 | 0.781 | 0.796 | 0.838 | 0.905 | 0.943 | 0.99 | 1.091 | 1.202 | 1.321 | 1.447 | 1.577 |
| 2.567499999999967 | 0.781 | 0.796 | 0.839 | 0.905 | 0.943 | 0.99 | 1.091 | 1.202 | 1.321 | 1.446 | 1.577 |
| 2.569999999999967 | 0.782 | 0.796 | 0.839 | 0.905 | 0.943 | 0.99 | 1.09 | 1.201 | 1.321 | 1.446 | 1.576 |
| 2.572499999999966 | 0.782 | 0.796 | 0.839 | 0.905 | 0.943 | 0.99 | 1.09 | 1.201 | 1.32 | 1.445 | 1.575 |
| 2.574999999999966 | 0.782 | 0.797 | 0.839 | 0.905 | 0.943 | 0.99 | 1.09 | 1.201 | 1.32 | 1.445 | 1.575 |
| 2.577499999999966 | 0.782 | 0.797 | 0.839 | 0.905 | 0.943 | 0.99 | 1.09 | 1.2 | 1.319 | 1.444 | 1.574 |
| 2.579999999999966 | 0.783 | 0.797 | 0.839 | 0.905 | 0.943 | 0.99 | 1.09 | 1.2 | 1.319 | 1.444 | 1.573 |
| 2.582499999999966 | 0.783 | 0.797 | 0.839 | 0.905 | 0.943 | 0.99 | 1.09 | 1.2 | 1.318 | 1.443 | 1.573 |
| 2.584999999999966 | 0.783 | 0.798 | 0.84 | 0.905 | 0.943 | 0.99 | 1.089 | 1.2 | 1.318 | 1.443 | 1.572 |
| 2.587499999999966 | 0.783 | 0.798 | 0.84 | 0.905 | 0.943 | 0.99 | 1.089 | 1.199 | 1.318 | 1.442 | 1.571 |
| 2.589999999999966 | 0.784 | 0.798 | 0.84 | 0.905 | 0.943 | 0.99 | 1.089 | 1.199 | 1.317 | 1.442 | 1.571 |
| 2.592499999999966 | 0.784 | 0.798 | 0.84 | 0.905 | 0.943 | 0.99 | 1.089 | 1.199 | 1.317 | 1.441 | 1.57 |
| 2.594999999999966 | 0.784 | 0.798 | 0.84 | 0.906 | 0.943 | 0.99 | 1.089 | 1.198 | 1.316 | 1.44 | 1.569 |
| 2.597499999999966 | 0.784 | 0.799 | 0.84 | 0.906 | 0.943 | 0.99 | 1.088 | 1.198 | 1.316 | 1.44 | 1.569 |
| 2.599999999999966 | 0.784 | 0.799 | 0.84 | 0.906 | 0.943 | 0.99 | 1.088 | 1.198 | 1.316 | 1.439 | 1.568 |
| 2.602499999999966 | 0.785 | 0.799 | 0.841 | 0.906 | 0.943 | 0.99 | 1.088 | 1.197 | 1.315 | 1.439 | 1.567 |
| 2.604999999999966 | 0.785 | 0.799 | 0.841 | 0.906 | 0.943 | 0.99 | 1.088 | 1.197 | 1.315 | 1.438 | 1.567 |
| 2.607499999999966 | 0.785 | 0.799 | 0.841 | 0.906 | 0.943 | 0.99 | 1.088 | 1.197 | 1.314 | 1.438 | 1.566 |
| 2.609999999999966 | 0.785 | 0.8 | 0.841 | 0.906 | 0.943 | 0.989 | 1.088 | 1.197 | 1.314 | 1.437 | 1.565 |
| 2.612499999999966 | 0.786 | 0.8 | 0.841 | 0.906 | 0.943 | 0.989 | 1.087 | 1.196 | 1.313 | 1.437 | 1.565 |
| 2.614999999999965 | 0.786 | 0.8 | 0.841 | 0.906 | 0.943 | 0.989 | 1.087 | 1.196 | 1.313 | 1.436 | 1.564 |
| 2.617499999999965 | 0.786 | 0.8 | 0.842 | 0.906 | 0.943 | 0.989 | 1.087 | 1.196 | 1.313 | 1.436 | 1.563 |
| 2.619999999999965 | 0.786 | 0.801 | 0.842 | 0.906 | 0.943 | 0.989 | 1.087 | 1.195 | 1.312 | 1.435 | 1.563 |
| 2.622499999999965 | 0.787 | 0.801 | 0.842 | 0.906 | 0.943 | 0.989 | 1.087 | 1.195 | 1.312 | 1.435 | 1.562 |
| 2.624999999999965 | 0.787 | 0.801 | 0.842 | 0.906 | 0.943 | 0.989 | 1.087 | 1.195 | 1.311 | 1.434 | 1.562 |
| 2.627499999999965 | 0.787 | 0.801 | 0.842 | 0.906 | 0.943 | 0.989 | 1.086 | 1.195 | 1.311 | 1.434 | 1.561 |
| 2.629999999999965 | 0.787 | 0.801 | 0.842 | 0.906 | 0.943 | 0.989 | 1.086 | 1.194 | 1.31 | 1.433 | 1.56 |
| 2.632499999999965 | 0.787 | 0.802 | 0.842 | 0.906 | 0.943 | 0.989 | 1.086 | 1.194 | 1.31 | 1.432 | 1.56 |
| 2.634999999999965 | 0.788 | 0.802 | 0.843 | 0.906 | 0.943 | 0.989 | 1.086 | 1.194 | 1.31 | 1.432 | 1.559 |
| 2.637499999999965 | 0.788 | 0.802 | 0.843 | 0.906 | 0.943 | 0.989 | 1.086 | 1.193 | 1.309 | 1.431 | 1.558 |
| 2.639999999999965 | 0.788 | 0.802 | 0.843 | 0.907 | 0.943 | 0.989 | 1.085 | 1.193 | 1.309 | 1.431 | 1.558 |
| 2.642499999999965 | 0.788 | 0.802 | 0.843 | 0.907 | 0.943 | 0.989 | 1.085 | 1.193 | 1.308 | 1.43 | 1.557 |
| 2.644999999999965 | 0.789 | 0.803 | 0.843 | 0.907 | 0.943 | 0.989 | 1.085 | 1.192 | 1.308 | 1.43 | 1.556 |
| 2.647499999999965 | 0.789 | 0.803 | 0.843 | 0.907 | 0.943 | 0.989 | 1.085 | 1.192 | 1.308 | 1.429 | 1.556 |
| 2.649999999999965 | 0.789 | 0.803 | 0.843 | 0.907 | 0.943 | 0.989 | 1.085 | 1.192 | 1.307 | 1.429 | 1.555 |
| 2.652499999999965 | 0.789 | 0.803 | 0.844 | 0.907 | 0.943 | 0.989 | 1.085 | 1.192 | 1.307 | 1.428 | 1.554 |
| 2.654999999999965 | 0.79 | 0.803 | 0.844 | 0.907 | 0.943 | 0.988 | 1.084 | 1.191 | 1.306 | 1.428 | 1.554 |
| 2.657499999999965 | 0.79 | 0.804 | 0.844 | 0.907 | 0.943 | 0.988 | 1.084 | 1.191 | 1.306 | 1.427 | 1.553 |
| 2.659999999999965 | 0.79 | 0.804 | 0.844 | 0.907 | 0.943 | 0.988 | 1.084 | 1.191 | 1.306 | 1.427 | 1.552 |
| 2.662499999999964 | 0.79 | 0.804 | 0.844 | 0.907 | 0.943 | 0.988 | 1.084 | 1.19 | 1.305 | 1.426 | 1.552 |
| 2.664999999999964 | 0.79 | 0.804 | 0.844 | 0.907 | 0.943 | 0.988 | 1.084 | 1.19 | 1.305 | 1.426 | 1.551 |
| 2.667499999999964 | 0.791 | 0.804 | 0.844 | 0.907 | 0.943 | 0.988 | 1.084 | 1.19 | 1.304 | 1.425 | 1.551 |
| 2.669999999999964 | 0.791 | 0.805 | 0.845 | 0.907 | 0.943 | 0.988 | 1.083 | 1.19 | 1.304 | 1.425 | 1.55 |
| 2.672499999999964 | 0.791 | 0.805 | 0.845 | 0.907 | 0.943 | 0.988 | 1.083 | 1.189 | 1.304 | 1.424 | 1.549 |
| 2.674999999999964 | 0.791 | 0.805 | 0.845 | 0.907 | 0.943 | 0.988 | 1.083 | 1.189 | 1.303 | 1.423 | 1.549 |
| 2.677499999999964 | 0.792 | 0.805 | 0.845 | 0.907 | 0.943 | 0.988 | 1.083 | 1.189 | 1.303 | 1.423 | 1.548 |
| 2.679999999999964 | 0.792 | 0.805 | 0.845 | 0.907 | 0.943 | 0.988 | 1.083 | 1.188 | 1.302 | 1.422 | 1.547 |
| 2.682499999999964 | 0.792 | 0.806 | 0.845 | 0.907 | 0.943 | 0.988 | 1.083 | 1.188 | 1.302 | 1.422 | 1.547 |
| 2.684999999999964 | 0.792 | 0.806 | 0.845 | 0.907 | 0.943 | 0.988 | 1.082 | 1.188 | 1.302 | 1.421 | 1.546 |
| 2.687499999999964 | 0.792 | 0.806 | 0.845 | 0.907 | 0.943 | 0.988 | 1.082 | 1.188 | 1.301 | 1.421 | 1.545 |
| 2.689999999999964 | 0.793 | 0.806 | 0.846 | 0.908 | 0.943 | 0.988 | 1.082 | 1.187 | 1.301 | 1.42 | 1.545 |
| 2.692499999999964 | 0.793 | 0.806 | 0.846 | 0.908 | 0.943 | 0.988 | 1.082 | 1.187 | 1.3 | 1.42 | 1.544 |
| 2.694999999999964 | 0.793 | 0.807 | 0.846 | 0.908 | 0.943 | 0.988 | 1.082 | 1.187 | 1.3 | 1.419 | 1.544 |
| 2.697499999999964 | 0.793 | 0.807 | 0.846 | 0.908 | 0.943 | 0.988 | 1.082 | 1.186 | 1.299 | 1.419 | 1.543 |
| 2.699999999999964 | 0.793 | 0.807 | 0.846 | 0.908 | 0.943 | 0.987 | 1.081 | 1.186 | 1.299 | 1.418 | 1.542 |
| 2.702499999999964 | 0.794 | 0.807 | 0.846 | 0.908 | 0.943 | 0.987 | 1.081 | 1.186 | 1.299 | 1.418 | 1.542 |
| 2.704999999999964 | 0.794 | 0.807 | 0.846 | 0.908 | 0.943 | 0.987 | 1.081 | 1.186 | 1.298 | 1.417 | 1.541 |
| 2.707499999999964 | 0.794 | 0.808 | 0.847 | 0.908 | 0.943 | 0.987 | 1.081 | 1.185 | 1.298 | 1.417 | 1.54 |
| 2.709999999999963 | 0.794 | 0.808 | 0.847 | 0.908 | 0.943 | 0.987 | 1.081 | 1.185 | 1.297 | 1.416 | 1.54 |
| 2.712499999999963 | 0.795 | 0.808 | 0.847 | 0.908 | 0.943 | 0.987 | 1.081 | 1.185 | 1.297 | 1.416 | 1.539 |
| 2.714999999999963 | 0.795 | 0.808 | 0.847 | 0.908 | 0.943 | 0.987 | 1.08 | 1.184 | 1.297 | 1.415 | 1.539 |
| 2.717499999999963 | 0.795 | 0.808 | 0.847 | 0.908 | 0.943 | 0.987 | 1.08 | 1.184 | 1.296 | 1.415 | 1.538 |
| 2.719999999999963 | 0.795 | 0.809 | 0.847 | 0.908 | 0.943 | 0.987 | 1.08 | 1.184 | 1.296 | 1.414 | 1.537 |
| 2.722499999999963 | 0.795 | 0.809 | 0.847 | 0.908 | 0.943 | 0.987 | 1.08 | 1.184 | 1.296 | 1.414 | 1.537 |
| 2.724999999999963 | 0.796 | 0.809 | 0.848 | 0.908 | 0.943 | 0.987 | 1.08 | 1.183 | 1.295 | 1.413 | 1.536 |
| 2.727499999999963 | 0.796 | 0.809 | 0.848 | 0.908 | 0.943 | 0.987 | 1.08 | 1.183 | 1.295 | 1.413 | 1.535 |
| 2.729999999999963 | 0.796 | 0.809 | 0.848 | 0.908 | 0.943 | 0.987 | 1.079 | 1.183 | 1.294 | 1.412 | 1.535 |
| 2.732499999999963 | 0.796 | 0.809 | 0.848 | 0.908 | 0.943 | 0.987 | 1.079 | 1.182 | 1.294 | 1.412 | 1.534 |
| 2.734999999999963 | 0.796 | 0.81 | 0.848 | 0.908 | 0.943 | 0.987 | 1.079 | 1.182 | 1.294 | 1.411 | 1.534 |
| 2.737499999999963 | 0.797 | 0.81 | 0.848 | 0.908 | 0.943 | 0.987 | 1.079 | 1.182 | 1.293 | 1.411 | 1.533 |
| 2.739999999999963 | 0.797 | 0.81 | 0.848 | 0.908 | 0.943 | 0.987 | 1.079 | 1.182 | 1.293 | 1.41 | 1.532 |
| 2.742499999999963 | 0.797 | 0.81 | 0.848 | 0.909 | 0.943 | 0.987 | 1.079 | 1.181 | 1.292 | 1.41 | 1.532 |
| 2.744999999999963 | 0.797 | 0.81 | 0.849 | 0.909 | 0.943 | 0.986 | 1.078 | 1.181 | 1.292 | 1.409 | 1.531 |
| 2.747499999999963 | 0.798 | 0.811 | 0.849 | 0.909 | 0.943 | 0.986 | 1.078 | 1.181 | 1.292 | 1.409 | 1.53 |
| 2.749999999999963 | 0.798 | 0.811 | 0.849 | 0.909 | 0.943 | 0.986 | 1.078 | 1.181 | 1.291 | 1.408 | 1.53 |
| 2.752499999999963 | 0.798 | 0.811 | 0.849 | 0.909 | 0.943 | 0.986 | 1.078 | 1.18 | 1.291 | 1.408 | 1.529 |
| 2.754999999999963 | 0.798 | 0.811 | 0.849 | 0.909 | 0.943 | 0.986 | 1.078 | 1.18 | 1.29 | 1.407 | 1.529 |
| 2.757499999999962 | 0.798 | 0.811 | 0.849 | 0.909 | 0.943 | 0.986 | 1.078 | 1.18 | 1.29 | 1.407 | 1.528 |
| 2.759999999999962 | 0.799 | 0.812 | 0.849 | 0.909 | 0.943 | 0.986 | 1.077 | 1.179 | 1.29 | 1.406 | 1.527 |
| 2.762499999999962 | 0.799 | 0.812 | 0.849 | 0.909 | 0.943 | 0.986 | 1.077 | 1.179 | 1.289 | 1.406 | 1.527 |
| 2.764999999999962 | 0.799 | 0.812 | 0.85 | 0.909 | 0.943 | 0.986 | 1.077 | 1.179 | 1.289 | 1.405 | 1.526 |
| 2.767499999999962 | 0.799 | 0.812 | 0.85 | 0.909 | 0.943 | 0.986 | 1.077 | 1.179 | 1.288 | 1.405 | 1.526 |
| 2.769999999999962 | 0.799 | 0.812 | 0.85 | 0.909 | 0.943 | 0.986 | 1.077 | 1.178 | 1.288 | 1.404 | 1.525 |
| 2.772499999999962 | 0.8 | 0.812 | 0.85 | 0.909 | 0.943 | 0.986 | 1.077 | 1.178 | 1.288 | 1.404 | 1.524 |
| 2.774999999999962 | 0.8 | 0.813 | 0.85 | 0.909 | 0.943 | 0.986 | 1.076 | 1.178 | 1.287 | 1.403 | 1.524 |
| 2.777499999999962 | 0.8 | 0.813 | 0.85 | 0.909 | 0.943 | 0.986 | 1.076 | 1.178 | 1.287 | 1.403 | 1.523 |
| 2.779999999999962 | 0.8 | 0.813 | 0.85 | 0.909 | 0.943 | 0.986 | 1.076 | 1.177 | 1.287 | 1.402 | 1.522 |
| 2.782499999999962 | 0.8 | 0.813 | 0.851 | 0.909 | 0.943 | 0.986 | 1.076 | 1.177 | 1.286 | 1.402 | 1.522 |
| 2.784999999999962 | 0.801 | 0.813 | 0.851 | 0.909 | 0.943 | 0.986 | 1.076 | 1.177 | 1.286 | 1.401 | 1.521 |
| 2.787499999999962 | 0.801 | 0.814 | 0.851 | 0.909 | 0.943 | 0.986 | 1.076 | 1.176 | 1.285 | 1.401 | 1.521 |
| 2.789999999999962 | 0.801 | 0.814 | 0.851 | 0.909 | 0.943 | 0.986 | 1.076 | 1.176 | 1.285 | 1.4 | 1.52 |
| 2.792499999999962 | 0.801 | 0.814 | 0.851 | 0.909 | 0.943 | 0.985 | 1.075 | 1.176 | 1.285 | 1.4 | 1.519 |
| 2.794999999999962 | 0.801 | 0.814 | 0.851 | 0.909 | 0.943 | 0.985 | 1.075 | 1.176 | 1.284 | 1.399 | 1.519 |
| 2.797499999999962 | 0.802 | 0.814 | 0.851 | 0.91 | 0.943 | 0.985 | 1.075 | 1.175 | 1.284 | 1.399 | 1.518 |
| 2.799999999999962 | 0.802 | 0.814 | 0.851 | 0.91 | 0.943 | 0.985 | 1.075 | 1.175 | 1.283 | 1.398 | 1.518 |
| 2.802499999999962 | 0.802 | 0.815 | 0.852 | 0.91 | 0.943 | 0.985 | 1.075 | 1.175 | 1.283 | 1.398 | 1.517 |
| 2.804999999999961 | 0.802 | 0.815 | 0.852 | 0.91 | 0.943 | 0.985 | 1.075 | 1.175 | 1.283 | 1.397 | 1.516 |
| 2.807499999999961 | 0.802 | 0.815 | 0.852 | 0.91 | 0.943 | 0.985 | 1.074 | 1.174 | 1.282 | 1.397 | 1.516 |
| 2.809999999999961 | 0.803 | 0.815 | 0.852 | 0.91 | 0.943 | 0.985 | 1.074 | 1.174 | 1.282 | 1.396 | 1.515 |
| 2.812499999999961 | 0.803 | 0.815 | 0.852 | 0.91 | 0.943 | 0.985 | 1.074 | 1.174 | 1.282 | 1.396 | 1.515 |
| 2.814999999999961 | 0.803 | 0.816 | 0.852 | 0.91 | 0.943 | 0.985 | 1.074 | 1.173 | 1.281 | 1.395 | 1.514 |
| 2.817499999999961 | 0.803 | 0.816 | 0.852 | 0.91 | 0.943 | 0.985 | 1.074 | 1.173 | 1.281 | 1.395 | 1.513 |
| 2.819999999999961 | 0.803 | 0.816 | 0.852 | 0.91 | 0.943 | 0.985 | 1.074 | 1.173 | 1.28 | 1.394 | 1.513 |
| 2.822499999999961 | 0.804 | 0.816 | 0.853 | 0.91 | 0.943 | 0.985 | 1.073 | 1.173 | 1.28 | 1.394 | 1.512 |
| 2.824999999999961 | 0.804 | 0.816 | 0.853 | 0.91 | 0.943 | 0.985 | 1.073 | 1.172 | 1.28 | 1.393 | 1.512 |
| 2.827499999999961 | 0.804 | 0.816 | 0.853 | 0.91 | 0.943 | 0.985 | 1.073 | 1.172 | 1.279 | 1.393 | 1.511 |
| 2.829999999999961 | 0.804 | 0.817 | 0.853 | 0.91 | 0.943 | 0.985 | 1.073 | 1.172 | 1.279 | 1.392 | 1.511 |
| 2.832499999999961 | 0.804 | 0.817 | 0.853 | 0.91 | 0.943 | 0.985 | 1.073 | 1.172 | 1.279 | 1.392 | 1.51 |
| 2.834999999999961 | 0.805 | 0.817 | 0.853 | 0.91 | 0.943 | 0.985 | 1.073 | 1.171 | 1.278 | 1.391 | 1.509 |
| 2.837499999999961 | 0.805 | 0.817 | 0.853 | 0.91 | 0.943 | 0.985 | 1.073 | 1.171 | 1.278 | 1.391 | 1.509 |
| 2.839999999999961 | 0.805 | 0.817 | 0.853 | 0.91 | 0.943 | 0.984 | 1.072 | 1.171 | 1.277 | 1.39 | 1.508 |
| 2.842499999999961 | 0.805 | 0.817 | 0.853 | 0.91 | 0.943 | 0.984 | 1.072 | 1.171 | 1.277 | 1.39 | 1.508 |
| 2.844999999999961 | 0.805 | 0.818 | 0.854 | 0.91 | 0.943 | 0.984 | 1.072 | 1.17 | 1.277 | 1.389 | 1.507 |
| 2.847499999999961 | 0.805 | 0.818 | 0.854 | 0.91 | 0.943 | 0.984 | 1.072 | 1.17 | 1.276 | 1.389 | 1.506 |
| 2.849999999999961 | 0.806 | 0.818 | 0.854 | 0.91 | 0.943 | 0.984 | 1.072 | 1.17 | 1.276 | 1.388 | 1.506 |
| 2.85249999999996 | 0.806 | 0.818 | 0.854 | 0.911 | 0.943 | 0.984 | 1.072 | 1.17 | 1.276 | 1.388 | 1.505 |
| 2.85499999999996 | 0.806 | 0.818 | 0.854 | 0.911 | 0.943 | 0.984 | 1.071 | 1.169 | 1.275 | 1.387 | 1.505 |
| 2.85749999999996 | 0.806 | 0.819 | 0.854 | 0.911 | 0.943 | 0.984 | 1.071 | 1.169 | 1.275 | 1.387 | 1.504 |
| 2.85999999999996 | 0.806 | 0.819 | 0.854 | 0.911 | 0.943 | 0.984 | 1.071 | 1.169 | 1.274 | 1.387 | 1.503 |
| 2.86249999999996 | 0.807 | 0.819 | 0.854 | 0.911 | 0.943 | 0.984 | 1.071 | 1.168 | 1.274 | 1.386 | 1.503 |
| 2.86499999999996 | 0.807 | 0.819 | 0.855 | 0.911 | 0.943 | 0.984 | 1.071 | 1.168 | 1.274 | 1.386 | 1.502 |
| 2.86749999999996 | 0.807 | 0.819 | 0.855 | 0.911 | 0.943 | 0.984 | 1.071 | 1.168 | 1.273 | 1.385 | 1.502 |
| 2.86999999999996 | 0.807 | 0.819 | 0.855 | 0.911 | 0.943 | 0.984 | 1.07 | 1.168 | 1.273 | 1.385 | 1.501 |
| 2.87249999999996 | 0.807 | 0.82 | 0.855 | 0.911 | 0.943 | 0.984 | 1.07 | 1.167 | 1.273 | 1.384 | 1.501 |
| 2.87499999999996 | 0.808 | 0.82 | 0.855 | 0.911 | 0.943 | 0.984 | 1.07 | 1.167 | 1.272 | 1.384 | 1.5 |
| 2.87749999999996 | 0.808 | 0.82 | 0.855 | 0.911 | 0.943 | 0.984 | 1.07 | 1.167 | 1.272 | 1.383 | 1.499 |
| 2.87999999999996 | 0.808 | 0.82 | 0.855 | 0.911 | 0.943 | 0.984 | 1.07 | 1.167 | 1.272 | 1.383 | 1.499 |
| 2.88249999999996 | 0.808 | 0.82 | 0.855 | 0.911 | 0.943 | 0.984 | 1.07 | 1.166 | 1.271 | 1.382 | 1.498 |
| 2.88499999999996 | 0.808 | 0.82 | 0.856 | 0.911 | 0.943 | 0.984 | 1.07 | 1.166 | 1.271 | 1.382 | 1.498 |
| 2.88749999999996 | 0.809 | 0.821 | 0.856 | 0.911 | 0.943 | 0.984 | 1.069 | 1.166 | 1.27 | 1.381 | 1.497 |
| 2.88999999999996 | 0.809 | 0.821 | 0.856 | 0.911 | 0.943 | 0.983 | 1.069 | 1.166 | 1.27 | 1.381 | 1.497 |
| 2.89249999999996 | 0.809 | 0.821 | 0.856 | 0.911 | 0.943 | 0.983 | 1.069 | 1.165 | 1.27 | 1.38 | 1.496 |
| 2.89499999999996 | 0.809 | 0.821 | 0.856 | 0.911 | 0.943 | 0.983 | 1.069 | 1.165 | 1.269 | 1.38 | 1.495 |
| 2.897499999999959 | 0.809 | 0.821 | 0.856 | 0.911 | 0.943 | 0.983 | 1.069 | 1.165 | 1.269 | 1.379 | 1.495 |
| 2.899999999999959 | 0.809 | 0.821 | 0.856 | 0.911 | 0.943 | 0.983 | 1.069 | 1.165 | 1.269 | 1.379 | 1.494 |
| 2.902499999999959 | 0.81 | 0.822 | 0.856 | 0.911 | 0.943 | 0.983 | 1.069 | 1.164 | 1.268 | 1.379 | 1.494 |
| 2.904999999999959 | 0.81 | 0.822 | 0.856 | 0.911 | 0.943 | 0.983 | 1.068 | 1.164 | 1.268 | 1.378 | 1.493 |
| 2.907499999999959 | 0.81 | 0.822 | 0.857 | 0.911 | 0.943 | 0.983 | 1.068 | 1.164 | 1.268 | 1.378 | 1.493 |
| 2.909999999999959 | 0.81 | 0.822 | 0.857 | 0.911 | 0.943 | 0.983 | 1.068 | 1.164 | 1.267 | 1.377 | 1.492 |
| 2.912499999999959 | 0.81 | 0.822 | 0.857 | 0.911 | 0.943 | 0.983 | 1.068 | 1.163 | 1.267 | 1.377 | 1.491 |
| 2.914999999999959 | 0.811 | 0.822 | 0.857 | 0.912 | 0.943 | 0.983 | 1.068 | 1.163 | 1.267 | 1.376 | 1.491 |
| 2.917499999999959 | 0.811 | 0.823 | 0.857 | 0.912 | 0.943 | 0.983 | 1.068 | 1.163 | 1.266 | 1.376 | 1.49 |
| 2.919999999999959 | 0.811 | 0.823 | 0.857 | 0.912 | 0.943 | 0.983 | 1.067 | 1.163 | 1.266 | 1.375 | 1.49 |
| 2.922499999999959 | 0.811 | 0.823 | 0.857 | 0.912 | 0.943 | 0.983 | 1.067 | 1.162 | 1.265 | 1.375 | 1.489 |
| 2.924999999999959 | 0.811 | 0.823 | 0.857 | 0.912 | 0.943 | 0.983 | 1.067 | 1.162 | 1.265 | 1.374 | 1.489 |
| 2.927499999999959 | 0.811 | 0.823 | 0.857 | 0.912 | 0.943 | 0.983 | 1.067 | 1.162 | 1.265 | 1.374 | 1.488 |
| 2.929999999999959 | 0.812 | 0.823 | 0.858 | 0.912 | 0.943 | 0.983 | 1.067 | 1.162 | 1.264 | 1.373 | 1.487 |
| 2.932499999999959 | 0.812 | 0.823 | 0.858 | 0.912 | 0.943 | 0.983 | 1.067 | 1.161 | 1.264 | 1.373 | 1.487 |
| 2.934999999999959 | 0.812 | 0.824 | 0.858 | 0.912 | 0.943 | 0.983 | 1.067 | 1.161 | 1.264 | 1.373 | 1.486 |
| 2.937499999999959 | 0.812 | 0.824 | 0.858 | 0.912 | 0.943 | 0.983 | 1.066 | 1.161 | 1.263 | 1.372 | 1.486 |
| 2.939999999999959 | 0.812 | 0.824 | 0.858 | 0.912 | 0.943 | 0.982 | 1.066 | 1.161 | 1.263 | 1.372 | 1.485 |
| 2.942499999999959 | 0.812 | 0.824 | 0.858 | 0.912 | 0.943 | 0.982 | 1.066 | 1.16 | 1.263 | 1.371 | 1.485 |
| 2.944999999999959 | 0.813 | 0.824 | 0.858 | 0.912 | 0.943 | 0.982 | 1.066 | 1.16 | 1.262 | 1.371 | 1.484 |
| 2.947499999999958 | 0.813 | 0.824 | 0.858 | 0.912 | 0.943 | 0.982 | 1.066 | 1.16 | 1.262 | 1.37 | 1.484 |
| 2.949999999999958 | 0.813 | 0.825 | 0.858 | 0.912 | 0.943 | 0.982 | 1.066 | 1.16 | 1.262 | 1.37 | 1.483 |
| 2.952499999999958 | 0.813 | 0.825 | 0.859 | 0.912 | 0.943 | 0.982 | 1.066 | 1.159 | 1.261 | 1.369 | 1.482 |
| 2.954999999999958 | 0.813 | 0.825 | 0.859 | 0.912 | 0.943 | 0.982 | 1.065 | 1.159 | 1.261 | 1.369 | 1.482 |
| 2.957499999999958 | 0.814 | 0.825 | 0.859 | 0.912 | 0.943 | 0.982 | 1.065 | 1.159 | 1.26 | 1.368 | 1.481 |
| 2.959999999999958 | 0.814 | 0.825 | 0.859 | 0.912 | 0.943 | 0.982 | 1.065 | 1.159 | 1.26 | 1.368 | 1.481 |
| 2.962499999999958 | 0.814 | 0.825 | 0.859 | 0.912 | 0.943 | 0.982 | 1.065 | 1.158 | 1.26 | 1.368 | 1.48 |
| 2.964999999999958 | 0.814 | 0.826 | 0.859 | 0.912 | 0.943 | 0.982 | 1.065 | 1.158 | 1.259 | 1.367 | 1.48 |
| 2.967499999999958 | 0.814 | 0.826 | 0.859 | 0.912 | 0.943 | 0.982 | 1.065 | 1.158 | 1.259 | 1.367 | 1.479 |
| 2.969999999999958 | 0.814 | 0.826 | 0.859 | 0.912 | 0.943 | 0.982 | 1.065 | 1.158 | 1.259 | 1.366 | 1.479 |
| 2.972499999999958 | 0.815 | 0.826 | 0.859 | 0.912 | 0.943 | 0.982 | 1.064 | 1.157 | 1.258 | 1.366 | 1.478 |
| 2.974999999999958 | 0.815 | 0.826 | 0.86 | 0.912 | 0.943 | 0.982 | 1.064 | 1.157 | 1.258 | 1.365 | 1.477 |
| 2.977499999999958 | 0.815 | 0.826 | 0.86 | 0.913 | 0.943 | 0.982 | 1.064 | 1.157 | 1.258 | 1.365 | 1.477 |
| 2.979999999999958 | 0.815 | 0.827 | 0.86 | 0.913 | 0.943 | 0.982 | 1.064 | 1.157 | 1.257 | 1.364 | 1.476 |
| 2.982499999999958 | 0.815 | 0.827 | 0.86 | 0.913 | 0.943 | 0.982 | 1.064 | 1.156 | 1.257 | 1.364 | 1.476 |
| 2.984999999999958 | 0.815 | 0.827 | 0.86 | 0.913 | 0.943 | 0.982 | 1.064 | 1.156 | 1.257 | 1.363 | 1.475 |
| 2.987499999999958 | 0.816 | 0.827 | 0.86 | 0.913 | 0.943 | 0.982 | 1.064 | 1.156 | 1.256 | 1.363 | 1.475 |
| 2.989999999999958 | 0.816 | 0.827 | 0.86 | 0.913 | 0.943 | 0.981 | 1.063 | 1.156 | 1.256 | 1.363 | 1.474 |
| 2.992499999999957 | 0.816 | 0.827 | 0.86 | 0.913 | 0.943 | 0.981 | 1.063 | 1.155 | 1.256 | 1.362 | 1.474 |
| 2.994999999999957 | 0.816 | 0.827 | 0.86 | 0.913 | 0.943 | 0.981 | 1.063 | 1.155 | 1.255 | 1.362 | 1.473 |
| 2.997499999999957 | 0.816 | 0.828 | 0.861 | 0.913 | 0.943 | 0.981 | 1.063 | 1.155 | 1.255 | 1.361 | 1.473 |
| 2.999999999999957 | 0.816 | 0.828 | 0.861 | 0.913 | 0.943 | 0.981 | 1.063 | 1.155 | 1.255 | 1.361 | 1.472 |
| 3.002499999999957 | 0.817 | 0.828 | 0.861 | 0.913 | 0.943 | 0.981 | 1.063 | 1.154 | 1.254 | 1.36 | 1.471 |
| 3.004999999999957 | 0.817 | 0.828 | 0.861 | 0.913 | 0.943 | 0.981 | 1.063 | 1.154 | 1.254 | 1.36 | 1.471 |
| 3.007499999999957 | 0.817 | 0.828 | 0.861 | 0.913 | 0.943 | 0.981 | 1.062 | 1.154 | 1.254 | 1.36 | 1.47 |
| 3.009999999999957 | 0.817 | 0.828 | 0.861 | 0.913 | 0.943 | 0.981 | 1.062 | 1.154 | 1.253 | 1.359 | 1.47 |
| 3.012499999999957 | 0.817 | 0.829 | 0.861 | 0.913 | 0.943 | 0.981 | 1.062 | 1.154 | 1.253 | 1.359 | 1.469 |
| 3.014999999999957 | 0.818 | 0.829 | 0.861 | 0.913 | 0.943 | 0.981 | 1.062 | 1.153 | 1.253 | 1.358 | 1.469 |
| 3.017499999999957 | 0.818 | 0.829 | 0.861 | 0.913 | 0.943 | 0.981 | 1.062 | 1.153 | 1.252 | 1.358 | 1.468 |
| 3.019999999999957 | 0.818 | 0.829 | 0.862 | 0.913 | 0.943 | 0.981 | 1.062 | 1.153 | 1.252 | 1.357 | 1.468 |
| 3.022499999999957 | 0.818 | 0.829 | 0.862 | 0.913 | 0.943 | 0.981 | 1.062 | 1.153 | 1.252 | 1.357 | 1.467 |
| 3.024999999999957 | 0.818 | 0.829 | 0.862 | 0.913 | 0.943 | 0.981 | 1.061 | 1.152 | 1.251 | 1.356 | 1.467 |
| 3.027499999999957 | 0.818 | 0.829 | 0.862 | 0.913 | 0.943 | 0.981 | 1.061 | 1.152 | 1.251 | 1.356 | 1.466 |
| 3.029999999999957 | 0.819 | 0.83 | 0.862 | 0.913 | 0.943 | 0.981 | 1.061 | 1.152 | 1.251 | 1.356 | 1.466 |
| 3.032499999999957 | 0.819 | 0.83 | 0.862 | 0.913 | 0.943 | 0.981 | 1.061 | 1.152 | 1.25 | 1.355 | 1.465 |
| 3.034999999999957 | 0.819 | 0.83 | 0.862 | 0.913 | 0.943 | 0.981 | 1.061 | 1.151 | 1.25 | 1.355 | 1.464 |
| 3.037499999999957 | 0.819 | 0.83 | 0.862 | 0.913 | 0.943 | 0.981 | 1.061 | 1.151 | 1.25 | 1.354 | 1.464 |
| 3.039999999999957 | 0.819 | 0.83 | 0.862 | 0.913 | 0.943 | 0.981 | 1.061 | 1.151 | 1.249 | 1.354 | 1.463 |
| 3.042499999999956 | 0.819 | 0.83 | 0.862 | 0.914 | 0.943 | 0.981 | 1.06 | 1.151 | 1.249 | 1.353 | 1.463 |
| 3.044999999999956 | 0.82 | 0.83 | 0.863 | 0.914 | 0.943 | 0.98 | 1.06 | 1.15 | 1.249 | 1.353 | 1.462 |
| 3.047499999999956 | 0.82 | 0.831 | 0.863 | 0.914 | 0.943 | 0.98 | 1.06 | 1.15 | 1.248 | 1.353 | 1.462 |
| 3.049999999999956 | 0.82 | 0.831 | 0.863 | 0.914 | 0.943 | 0.98 | 1.06 | 1.15 | 1.248 | 1.352 | 1.461 |
| 3.052499999999956 | 0.82 | 0.831 | 0.863 | 0.914 | 0.943 | 0.98 | 1.06 | 1.15 | 1.248 | 1.352 | 1.461 |
| 3.054999999999956 | 0.82 | 0.831 | 0.863 | 0.914 | 0.943 | 0.98 | 1.06 | 1.149 | 1.247 | 1.351 | 1.46 |
| 3.057499999999956 | 0.82 | 0.831 | 0.863 | 0.914 | 0.943 | 0.98 | 1.06 | 1.149 | 1.247 | 1.351 | 1.46 |
| 3.059999999999956 | 0.82 | 0.831 | 0.863 | 0.914 | 0.943 | 0.98 | 1.06 | 1.149 | 1.247 | 1.35 | 1.459 |
| 3.062499999999956 | 0.821 | 0.832 | 0.863 | 0.914 | 0.943 | 0.98 | 1.059 | 1.149 | 1.246 | 1.35 | 1.459 |
| 3.064999999999956 | 0.821 | 0.832 | 0.863 | 0.914 | 0.943 | 0.98 | 1.059 | 1.149 | 1.246 | 1.35 | 1.458 |
| 3.067499999999956 | 0.821 | 0.832 | 0.863 | 0.914 | 0.943 | 0.98 | 1.059 | 1.148 | 1.246 | 1.349 | 1.458 |
| 3.069999999999956 | 0.821 | 0.832 | 0.864 | 0.914 | 0.943 | 0.98 | 1.059 | 1.148 | 1.245 | 1.349 | 1.457 |
| 3.072499999999956 | 0.821 | 0.832 | 0.864 | 0.914 | 0.943 | 0.98 | 1.059 | 1.148 | 1.245 | 1.348 | 1.457 |
| 3.074999999999956 | 0.821 | 0.832 | 0.864 | 0.914 | 0.943 | 0.98 | 1.059 | 1.148 | 1.245 | 1.348 | 1.456 |
| 3.077499999999956 | 0.822 | 0.832 | 0.864 | 0.914 | 0.943 | 0.98 | 1.059 | 1.147 | 1.244 | 1.347 | 1.455 |
| 3.079999999999956 | 0.822 | 0.833 | 0.864 | 0.914 | 0.943 | 0.98 | 1.058 | 1.147 | 1.244 | 1.347 | 1.455 |
| 3.082499999999956 | 0.822 | 0.833 | 0.864 | 0.914 | 0.943 | 0.98 | 1.058 | 1.147 | 1.244 | 1.347 | 1.454 |
| 3.084999999999956 | 0.822 | 0.833 | 0.864 | 0.914 | 0.943 | 0.98 | 1.058 | 1.147 | 1.243 | 1.346 | 1.454 |
| 3.087499999999955 | 0.822 | 0.833 | 0.864 | 0.914 | 0.943 | 0.98 | 1.058 | 1.146 | 1.243 | 1.346 | 1.453 |
| 3.089999999999955 | 0.822 | 0.833 | 0.864 | 0.914 | 0.943 | 0.98 | 1.058 | 1.146 | 1.243 | 1.345 | 1.453 |
| 3.092499999999955 | 0.823 | 0.833 | 0.865 | 0.914 | 0.943 | 0.98 | 1.058 | 1.146 | 1.242 | 1.345 | 1.452 |
| 3.094999999999955 | 0.823 | 0.833 | 0.865 | 0.914 | 0.943 | 0.98 | 1.058 | 1.146 | 1.242 | 1.344 | 1.452 |
| 3.097499999999955 | 0.823 | 0.834 | 0.865 | 0.914 | 0.943 | 0.98 | 1.057 | 1.146 | 1.242 | 1.344 | 1.451 |
| 3.099999999999955 | 0.823 | 0.834 | 0.865 | 0.914 | 0.943 | 0.979 | 1.057 | 1.145 | 1.241 | 1.344 | 1.451 |
| 3.102499999999955 | 0.823 | 0.834 | 0.865 | 0.914 | 0.943 | 0.979 | 1.057 | 1.145 | 1.241 | 1.343 | 1.45 |
| 3.104999999999955 | 0.823 | 0.834 | 0.865 | 0.914 | 0.943 | 0.979 | 1.057 | 1.145 | 1.241 | 1.343 | 1.45 |
| 3.107499999999955 | 0.824 | 0.834 | 0.865 | 0.914 | 0.943 | 0.979 | 1.057 | 1.145 | 1.24 | 1.342 | 1.449 |
| 3.109999999999955 | 0.824 | 0.834 | 0.865 | 0.914 | 0.943 | 0.979 | 1.057 | 1.144 | 1.24 | 1.342 | 1.449 |
| 3.112499999999955 | 0.824 | 0.834 | 0.865 | 0.915 | 0.943 | 0.979 | 1.057 | 1.144 | 1.24 | 1.342 | 1.448 |
| 3.114999999999955 | 0.824 | 0.835 | 0.865 | 0.915 | 0.943 | 0.979 | 1.057 | 1.144 | 1.239 | 1.341 | 1.448 |
| 3.117499999999955 | 0.824 | 0.835 | 0.866 | 0.915 | 0.943 | 0.979 | 1.056 | 1.144 | 1.239 | 1.341 | 1.447 |
| 3.119999999999955 | 0.824 | 0.835 | 0.866 | 0.915 | 0.943 | 0.979 | 1.056 | 1.144 | 1.239 | 1.34 | 1.447 |
| 3.122499999999955 | 0.824 | 0.835 | 0.866 | 0.915 | 0.943 | 0.979 | 1.056 | 1.143 | 1.238 | 1.34 | 1.446 |
| 3.124999999999955 | 0.825 | 0.835 | 0.866 | 0.915 | 0.943 | 0.979 | 1.056 | 1.143 | 1.238 | 1.339 | 1.446 |
| 3.127499999999955 | 0.825 | 0.835 | 0.866 | 0.915 | 0.943 | 0.979 | 1.056 | 1.143 | 1.238 | 1.339 | 1.445 |
| 3.129999999999955 | 0.825 | 0.835 | 0.866 | 0.915 | 0.943 | 0.979 | 1.056 | 1.143 | 1.238 | 1.339 | 1.445 |
| 3.132499999999955 | 0.825 | 0.836 | 0.866 | 0.915 | 0.943 | 0.979 | 1.056 | 1.142 | 1.237 | 1.338 | 1.444 |
| 3.134999999999954 | 0.825 | 0.836 | 0.866 | 0.915 | 0.943 | 0.979 | 1.056 | 1.142 | 1.237 | 1.338 | 1.444 |
| 3.137499999999954 | 0.825 | 0.836 | 0.866 | 0.915 | 0.943 | 0.979 | 1.055 | 1.142 | 1.237 | 1.337 | 1.443 |
| 3.139999999999954 | 0.826 | 0.836 | 0.866 | 0.915 | 0.943 | 0.979 | 1.055 | 1.142 | 1.236 | 1.337 | 1.443 |
| 3.142499999999954 | 0.826 | 0.836 | 0.866 | 0.915 | 0.943 | 0.979 | 1.055 | 1.142 | 1.236 | 1.337 | 1.442 |
| 3.144999999999954 | 0.826 | 0.836 | 0.867 | 0.915 | 0.943 | 0.979 | 1.055 | 1.141 | 1.236 | 1.336 | 1.442 |
| 3.147499999999954 | 0.826 | 0.836 | 0.867 | 0.915 | 0.943 | 0.979 | 1.055 | 1.141 | 1.235 | 1.336 | 1.441 |
| 3.149999999999954 | 0.826 | 0.837 | 0.867 | 0.915 | 0.943 | 0.979 | 1.055 | 1.141 | 1.235 | 1.335 | 1.441 |
| 3.152499999999954 | 0.826 | 0.837 | 0.867 | 0.915 | 0.943 | 0.979 | 1.055 | 1.141 | 1.235 | 1.335 | 1.44 |
| 3.154999999999954 | 0.826 | 0.837 | 0.867 | 0.915 | 0.943 | 0.979 | 1.054 | 1.14 | 1.234 | 1.335 | 1.44 |
| 3.157499999999954 | 0.827 | 0.837 | 0.867 | 0.915 | 0.943 | 0.978 | 1.054 | 1.14 | 1.234 | 1.334 | 1.439 |
| 3.159999999999954 | 0.827 | 0.837 | 0.867 | 0.915 | 0.943 | 0.978 | 1.054 | 1.14 | 1.234 | 1.334 | 1.439 |
| 3.162499999999954 | 0.827 | 0.837 | 0.867 | 0.915 | 0.943 | 0.978 | 1.054 | 1.14 | 1.233 | 1.333 | 1.438 |
| 3.164999999999954 | 0.827 | 0.837 | 0.867 | 0.915 | 0.943 | 0.978 | 1.054 | 1.14 | 1.233 | 1.333 | 1.438 |
| 3.167499999999954 | 0.827 | 0.837 | 0.867 | 0.915 | 0.943 | 0.978 | 1.054 | 1.139 | 1.233 | 1.332 | 1.437 |
| 3.169999999999954 | 0.827 | 0.838 | 0.868 | 0.915 | 0.943 | 0.978 | 1.054 | 1.139 | 1.232 | 1.332 | 1.437 |
| 3.172499999999954 | 0.828 | 0.838 | 0.868 | 0.915 | 0.943 | 0.978 | 1.054 | 1.139 | 1.232 | 1.332 | 1.436 |
| 3.174999999999954 | 0.828 | 0.838 | 0.868 | 0.915 | 0.943 | 0.978 | 1.053 | 1.139 | 1.232 | 1.331 | 1.436 |
| 3.177499999999954 | 0.828 | 0.838 | 0.868 | 0.915 | 0.943 | 0.978 | 1.053 | 1.138 | 1.232 | 1.331 | 1.435 |
| 3.179999999999954 | 0.828 | 0.838 | 0.868 | 0.915 | 0.943 | 0.978 | 1.053 | 1.138 | 1.231 | 1.33 | 1.435 |
| 3.182499999999953 | 0.828 | 0.838 | 0.868 | 0.915 | 0.943 | 0.978 | 1.053 | 1.138 | 1.231 | 1.33 | 1.434 |
| 3.184999999999953 | 0.828 | 0.838 | 0.868 | 0.916 | 0.943 | 0.978 | 1.053 | 1.138 | 1.231 | 1.33 | 1.434 |
| 3.187499999999953 | 0.828 | 0.839 | 0.868 | 0.916 | 0.943 | 0.978 | 1.053 | 1.138 | 1.23 | 1.329 | 1.433 |
| 3.189999999999953 | 0.829 | 0.839 | 0.868 | 0.916 | 0.943 | 0.978 | 1.053 | 1.137 | 1.23 | 1.329 | 1.433 |
| 3.192499999999953 | 0.829 | 0.839 | 0.868 | 0.916 | 0.943 | 0.978 | 1.053 | 1.137 | 1.23 | 1.328 | 1.432 |
| 3.194999999999953 | 0.829 | 0.839 | 0.869 | 0.916 | 0.943 | 0.978 | 1.052 | 1.137 | 1.229 | 1.328 | 1.432 |
| 3.197499999999953 | 0.829 | 0.839 | 0.869 | 0.916 | 0.943 | 0.978 | 1.052 | 1.137 | 1.229 | 1.328 | 1.431 |
| 3.199999999999953 | 0.829 | 0.839 | 0.869 | 0.916 | 0.943 | 0.978 | 1.052 | 1.137 | 1.229 | 1.327 | 1.431 |
| 3.202499999999953 | 0.829 | 0.839 | 0.869 | 0.916 | 0.943 | 0.978 | 1.052 | 1.136 | 1.228 | 1.327 | 1.43 |
| 3.204999999999953 | 0.829 | 0.839 | 0.869 | 0.916 | 0.943 | 0.978 | 1.052 | 1.136 | 1.228 | 1.327 | 1.43 |
| 3.207499999999953 | 0.83 | 0.84 | 0.869 | 0.916 | 0.943 | 0.978 | 1.052 | 1.136 | 1.228 | 1.326 | 1.429 |
| 3.209999999999953 | 0.83 | 0.84 | 0.869 | 0.916 | 0.943 | 0.978 | 1.052 | 1.136 | 1.228 | 1.326 | 1.429 |
| 3.212499999999953 | 0.83 | 0.84 | 0.869 | 0.916 | 0.943 | 0.978 | 1.052 | 1.135 | 1.227 | 1.325 | 1.428 |
| 3.214999999999953 | 0.83 | 0.84 | 0.869 | 0.916 | 0.943 | 0.978 | 1.051 | 1.135 | 1.227 | 1.325 | 1.428 |
| 3.217499999999953 | 0.83 | 0.84 | 0.869 | 0.916 | 0.943 | 0.977 | 1.051 | 1.135 | 1.227 | 1.325 | 1.427 |
| 3.219999999999953 | 0.83 | 0.84 | 0.869 | 0.916 | 0.943 | 0.977 | 1.051 | 1.135 | 1.226 | 1.324 | 1.427 |
| 3.222499999999953 | 0.83 | 0.84 | 0.87 | 0.916 | 0.943 | 0.977 | 1.051 | 1.135 | 1.226 | 1.324 | 1.426 |
| 3.224999999999952 | 0.831 | 0.841 | 0.87 | 0.916 | 0.943 | 0.977 | 1.051 | 1.134 | 1.226 | 1.323 | 1.426 |
| 3.227499999999952 | 0.831 | 0.841 | 0.87 | 0.916 | 0.943 | 0.977 | 1.051 | 1.134 | 1.225 | 1.323 | 1.425 |
| 3.229999999999952 | 0.831 | 0.841 | 0.87 | 0.916 | 0.943 | 0.977 | 1.051 | 1.134 | 1.225 | 1.323 | 1.425 |
| 3.232499999999952 | 0.831 | 0.841 | 0.87 | 0.916 | 0.943 | 0.977 | 1.051 | 1.134 | 1.225 | 1.322 | 1.424 |
| 3.234999999999952 | 0.831 | 0.841 | 0.87 | 0.916 | 0.943 | 0.977 | 1.05 | 1.134 | 1.225 | 1.322 | 1.424 |
| 3.237499999999952 | 0.831 | 0.841 | 0.87 | 0.916 | 0.943 | 0.977 | 1.05 | 1.133 | 1.224 | 1.321 | 1.424 |
| 3.239999999999952 | 0.831 | 0.841 | 0.87 | 0.916 | 0.943 | 0.977 | 1.05 | 1.133 | 1.224 | 1.321 | 1.423 |
| 3.242499999999952 | 0.832 | 0.841 | 0.87 | 0.916 | 0.943 | 0.977 | 1.05 | 1.133 | 1.224 | 1.321 | 1.423 |
| 3.244999999999952 | 0.832 | 0.842 | 0.87 | 0.916 | 0.943 | 0.977 | 1.05 | 1.133 | 1.223 | 1.32 | 1.422 |
| 3.247499999999952 | 0.832 | 0.842 | 0.87 | 0.916 | 0.943 | 0.977 | 1.05 | 1.133 | 1.223 | 1.32 | 1.422 |
| 3.249999999999952 | 0.832 | 0.842 | 0.871 | 0.916 | 0.943 | 0.977 | 1.05 | 1.132 | 1.223 | 1.319 | 1.421 |
| 3.252499999999952 | 0.832 | 0.842 | 0.871 | 0.916 | 0.943 | 0.977 | 1.05 | 1.132 | 1.222 | 1.319 | 1.421 |
| 3.254999999999952 | 0.832 | 0.842 | 0.871 | 0.916 | 0.943 | 0.977 | 1.05 | 1.132 | 1.222 | 1.319 | 1.42 |
| 3.257499999999952 | 0.832 | 0.842 | 0.871 | 0.916 | 0.943 | 0.977 | 1.049 | 1.132 | 1.222 | 1.318 | 1.42 |
| 3.259999999999952 | 0.833 | 0.842 | 0.871 | 0.917 | 0.943 | 0.977 | 1.049 | 1.132 | 1.222 | 1.318 | 1.419 |
| 3.262499999999952 | 0.833 | 0.842 | 0.871 | 0.917 | 0.943 | 0.977 | 1.049 | 1.131 | 1.221 | 1.318 | 1.419 |
| 3.264999999999952 | 0.833 | 0.843 | 0.871 | 0.917 | 0.943 | 0.977 | 1.049 | 1.131 | 1.221 | 1.317 | 1.418 |
| 3.267499999999952 | 0.833 | 0.843 | 0.871 | 0.917 | 0.943 | 0.977 | 1.049 | 1.131 | 1.221 | 1.317 | 1.418 |
| 3.269999999999952 | 0.833 | 0.843 | 0.871 | 0.917 | 0.943 | 0.977 | 1.049 | 1.131 | 1.22 | 1.316 | 1.417 |
| 3.272499999999952 | 0.833 | 0.843 | 0.871 | 0.917 | 0.943 | 0.977 | 1.049 | 1.13 | 1.22 | 1.316 | 1.417 |
| 3.274999999999951 | 0.833 | 0.843 | 0.871 | 0.917 | 0.943 | 0.977 | 1.049 | 1.13 | 1.22 | 1.316 | 1.416 |
| 3.277499999999951 | 0.834 | 0.843 | 0.872 | 0.917 | 0.943 | 0.977 | 1.048 | 1.13 | 1.22 | 1.315 | 1.416 |
| 3.279999999999951 | 0.834 | 0.843 | 0.872 | 0.917 | 0.943 | 0.977 | 1.048 | 1.13 | 1.219 | 1.315 | 1.415 |
| 3.282499999999951 | 0.834 | 0.843 | 0.872 | 0.917 | 0.943 | 0.976 | 1.048 | 1.13 | 1.219 | 1.315 | 1.415 |
| 3.284999999999951 | 0.834 | 0.844 | 0.872 | 0.917 | 0.943 | 0.976 | 1.048 | 1.129 | 1.219 | 1.314 | 1.415 |
| 3.287499999999951 | 0.834 | 0.844 | 0.872 | 0.917 | 0.943 | 0.976 | 1.048 | 1.129 | 1.218 | 1.314 | 1.414 |
| 3.289999999999951 | 0.834 | 0.844 | 0.872 | 0.917 | 0.943 | 0.976 | 1.048 | 1.129 | 1.218 | 1.313 | 1.414 |
| 3.292499999999951 | 0.834 | 0.844 | 0.872 | 0.917 | 0.943 | 0.976 | 1.048 | 1.129 | 1.218 | 1.313 | 1.413 |
| 3.294999999999951 | 0.835 | 0.844 | 0.872 | 0.917 | 0.943 | 0.976 | 1.048 | 1.129 | 1.218 | 1.313 | 1.413 |
| 3.297499999999951 | 0.835 | 0.844 | 0.872 | 0.917 | 0.943 | 0.976 | 1.047 | 1.128 | 1.217 | 1.312 | 1.412 |
| 3.299999999999951 | 0.835 | 0.844 | 0.872 | 0.917 | 0.943 | 0.976 | 1.047 | 1.128 | 1.217 | 1.312 | 1.412 |
| 3.302499999999951 | 0.835 | 0.845 | 0.872 | 0.917 | 0.943 | 0.976 | 1.047 | 1.128 | 1.217 | 1.311 | 1.411 |
| 3.304999999999951 | 0.835 | 0.845 | 0.873 | 0.917 | 0.943 | 0.976 | 1.047 | 1.128 | 1.216 | 1.311 | 1.411 |
| 3.307499999999951 | 0.835 | 0.845 | 0.873 | 0.917 | 0.943 | 0.976 | 1.047 | 1.128 | 1.216 | 1.311 | 1.41 |
| 3.309999999999951 | 0.835 | 0.845 | 0.873 | 0.917 | 0.943 | 0.976 | 1.047 | 1.127 | 1.216 | 1.31 | 1.41 |
| 3.312499999999951 | 0.836 | 0.845 | 0.873 | 0.917 | 0.943 | 0.976 | 1.047 | 1.127 | 1.216 | 1.31 | 1.409 |
| 3.314999999999951 | 0.836 | 0.845 | 0.873 | 0.917 | 0.943 | 0.976 | 1.047 | 1.127 | 1.215 | 1.31 | 1.409 |
| 3.317499999999951 | 0.836 | 0.845 | 0.873 | 0.917 | 0.943 | 0.976 | 1.047 | 1.127 | 1.215 | 1.309 | 1.409 |
| 3.31999999999995 | 0.836 | 0.845 | 0.873 | 0.917 | 0.943 | 0.976 | 1.046 | 1.127 | 1.215 | 1.309 | 1.408 |
| 3.32249999999995 | 0.836 | 0.845 | 0.873 | 0.917 | 0.943 | 0.976 | 1.046 | 1.126 | 1.214 | 1.309 | 1.408 |
| 3.32499999999995 | 0.836 | 0.846 | 0.873 | 0.917 | 0.943 | 0.976 | 1.046 | 1.126 | 1.214 | 1.308 | 1.407 |
| 3.32749999999995 | 0.836 | 0.846 | 0.873 | 0.917 | 0.943 | 0.976 | 1.046 | 1.126 | 1.214 | 1.308 | 1.407 |
| 3.32999999999995 | 0.836 | 0.846 | 0.873 | 0.917 | 0.943 | 0.976 | 1.046 | 1.126 | 1.214 | 1.307 | 1.406 |
| 3.33249999999995 | 0.837 | 0.846 | 0.873 | 0.917 | 0.943 | 0.976 | 1.046 | 1.126 | 1.213 | 1.307 | 1.406 |
| 3.33499999999995 | 0.837 | 0.846 | 0.874 | 0.917 | 0.943 | 0.976 | 1.046 | 1.125 | 1.213 | 1.307 | 1.405 |
| 3.33749999999995 | 0.837 | 0.846 | 0.874 | 0.918 | 0.943 | 0.976 | 1.046 | 1.125 | 1.213 | 1.306 | 1.405 |
| 3.33999999999995 | 0.837 | 0.846 | 0.874 | 0.918 | 0.943 | 0.976 | 1.046 | 1.125 | 1.212 | 1.306 | 1.404 |
| 3.34249999999995 | 0.837 | 0.846 | 0.874 | 0.918 | 0.943 | 0.976 | 1.045 | 1.125 | 1.212 | 1.306 | 1.404 |
| 3.34499999999995 | 0.837 | 0.847 | 0.874 | 0.918 | 0.943 | 0.976 | 1.045 | 1.125 | 1.212 | 1.305 | 1.403 |
| 3.34749999999995 | 0.837 | 0.847 | 0.874 | 0.918 | 0.943 | 0.975 | 1.045 | 1.125 | 1.212 | 1.305 | 1.403 |
| 3.34999999999995 | 0.838 | 0.847 | 0.874 | 0.918 | 0.943 | 0.975 | 1.045 | 1.124 | 1.211 | 1.304 | 1.403 |
| 3.35249999999995 | 0.838 | 0.847 | 0.874 | 0.918 | 0.943 | 0.975 | 1.045 | 1.124 | 1.211 | 1.304 | 1.402 |
| 3.35499999999995 | 0.838 | 0.847 | 0.874 | 0.918 | 0.943 | 0.975 | 1.045 | 1.124 | 1.211 | 1.304 | 1.402 |
| 3.35749999999995 | 0.838 | 0.847 | 0.874 | 0.918 | 0.943 | 0.975 | 1.045 | 1.124 | 1.21 | 1.303 | 1.401 |
| 3.35999999999995 | 0.838 | 0.847 | 0.874 | 0.918 | 0.943 | 0.975 | 1.045 | 1.124 | 1.21 | 1.303 | 1.401 |
| 3.36249999999995 | 0.838 | 0.847 | 0.874 | 0.918 | 0.943 | 0.975 | 1.045 | 1.123 | 1.21 | 1.303 | 1.4 |
| 3.36499999999995 | 0.838 | 0.848 | 0.875 | 0.918 | 0.943 | 0.975 | 1.044 | 1.123 | 1.21 | 1.302 | 1.4 |
| 3.367499999999949 | 0.838 | 0.848 | 0.875 | 0.918 | 0.943 | 0.975 | 1.044 | 1.123 | 1.209 | 1.302 | 1.399 |
| 3.369999999999949 | 0.839 | 0.848 | 0.875 | 0.918 | 0.943 | 0.975 | 1.044 | 1.123 | 1.209 | 1.302 | 1.399 |
| 3.372499999999949 | 0.839 | 0.848 | 0.875 | 0.918 | 0.943 | 0.975 | 1.044 | 1.123 | 1.209 | 1.301 | 1.399 |
| 3.374999999999949 | 0.839 | 0.848 | 0.875 | 0.918 | 0.943 | 0.975 | 1.044 | 1.122 | 1.209 | 1.301 | 1.398 |
| 3.377499999999949 | 0.839 | 0.848 | 0.875 | 0.918 | 0.943 | 0.975 | 1.044 | 1.122 | 1.208 | 1.3 | 1.398 |
| 3.379999999999949 | 0.839 | 0.848 | 0.875 | 0.918 | 0.943 | 0.975 | 1.044 | 1.122 | 1.208 | 1.3 | 1.397 |
| 3.382499999999949 | 0.839 | 0.848 | 0.875 | 0.918 | 0.943 | 0.975 | 1.044 | 1.122 | 1.208 | 1.3 | 1.397 |
| 3.384999999999949 | 0.839 | 0.848 | 0.875 | 0.918 | 0.943 | 0.975 | 1.044 | 1.122 | 1.207 | 1.299 | 1.396 |
| 3.387499999999949 | 0.84 | 0.849 | 0.875 | 0.918 | 0.943 | 0.975 | 1.043 | 1.121 | 1.207 | 1.299 | 1.396 |
| 3.389999999999949 | 0.84 | 0.849 | 0.875 | 0.918 | 0.943 | 0.975 | 1.043 | 1.121 | 1.207 | 1.299 | 1.395 |
| 3.392499999999949 | 0.84 | 0.849 | 0.876 | 0.918 | 0.943 | 0.975 | 1.043 | 1.121 | 1.207 | 1.298 | 1.395 |
| 3.394999999999949 | 0.84 | 0.849 | 0.876 | 0.918 | 0.943 | 0.975 | 1.043 | 1.121 | 1.206 | 1.298 | 1.395 |
| 3.397499999999949 | 0.84 | 0.849 | 0.876 | 0.918 | 0.943 | 0.975 | 1.043 | 1.121 | 1.206 | 1.298 | 1.394 |
| 3.399999999999949 | 0.84 | 0.849 | 0.876 | 0.918 | 0.943 | 0.975 | 1.043 | 1.12 | 1.206 | 1.297 | 1.394 |
| 3.402499999999949 | 0.84 | 0.849 | 0.876 | 0.918 | 0.943 | 0.975 | 1.043 | 1.12 | 1.206 | 1.297 | 1.393 |
| 3.404999999999949 | 0.84 | 0.849 | 0.876 | 0.918 | 0.943 | 0.975 | 1.043 | 1.12 | 1.205 | 1.297 | 1.393 |
| 3.407499999999949 | 0.841 | 0.85 | 0.876 | 0.918 | 0.943 | 0.975 | 1.043 | 1.12 | 1.205 | 1.296 | 1.392 |
| 3.409999999999949 | 0.841 | 0.85 | 0.876 | 0.918 | 0.943 | 0.975 | 1.042 | 1.12 | 1.205 | 1.296 | 1.392 |
| 3.412499999999949 | 0.841 | 0.85 | 0.876 | 0.918 | 0.943 | 0.975 | 1.042 | 1.12 | 1.204 | 1.295 | 1.392 |
| 3.414999999999948 | 0.841 | 0.85 | 0.876 | 0.918 | 0.943 | 0.975 | 1.042 | 1.119 | 1.204 | 1.295 | 1.391 |
| 3.417499999999948 | 0.841 | 0.85 | 0.876 | 0.919 | 0.943 | 0.975 | 1.042 | 1.119 | 1.204 | 1.295 | 1.391 |
| 3.419999999999948 | 0.841 | 0.85 | 0.876 | 0.919 | 0.943 | 0.974 | 1.042 | 1.119 | 1.204 | 1.294 | 1.39 |
| 3.422499999999948 | 0.841 | 0.85 | 0.876 | 0.919 | 0.943 | 0.974 | 1.042 | 1.119 | 1.203 | 1.294 | 1.39 |
| 3.424999999999948 | 0.841 | 0.85 | 0.877 | 0.919 | 0.943 | 0.974 | 1.042 | 1.119 | 1.203 | 1.294 | 1.389 |
| 3.427499999999948 | 0.842 | 0.85 | 0.877 | 0.919 | 0.943 | 0.974 | 1.042 | 1.118 | 1.203 | 1.293 | 1.389 |
| 3.429999999999948 | 0.842 | 0.851 | 0.877 | 0.919 | 0.943 | 0.974 | 1.042 | 1.118 | 1.203 | 1.293 | 1.388 |
| 3.432499999999948 | 0.842 | 0.851 | 0.877 | 0.919 | 0.943 | 0.974 | 1.041 | 1.118 | 1.202 | 1.293 | 1.388 |
| 3.434999999999948 | 0.842 | 0.851 | 0.877 | 0.919 | 0.943 | 0.974 | 1.041 | 1.118 | 1.202 | 1.292 | 1.388 |
| 3.437499999999948 | 0.842 | 0.851 | 0.877 | 0.919 | 0.943 | 0.974 | 1.041 | 1.118 | 1.202 | 1.292 | 1.387 |
| 3.439999999999948 | 0.842 | 0.851 | 0.877 | 0.919 | 0.943 | 0.974 | 1.041 | 1.117 | 1.201 | 1.292 | 1.387 |
| 3.442499999999948 | 0.842 | 0.851 | 0.877 | 0.919 | 0.943 | 0.974 | 1.041 | 1.117 | 1.201 | 1.291 | 1.386 |
| 3.444999999999948 | 0.842 | 0.851 | 0.877 | 0.919 | 0.943 | 0.974 | 1.041 | 1.117 | 1.201 | 1.291 | 1.386 |
| 3.447499999999948 | 0.843 | 0.851 | 0.877 | 0.919 | 0.943 | 0.974 | 1.041 | 1.117 | 1.201 | 1.291 | 1.385 |
| 3.449999999999948 | 0.843 | 0.852 | 0.877 | 0.919 | 0.943 | 0.974 | 1.041 | 1.117 | 1.2 | 1.29 | 1.385 |
| 3.452499999999948 | 0.843 | 0.852 | 0.877 | 0.919 | 0.943 | 0.974 | 1.041 | 1.117 | 1.2 | 1.29 | 1.385 |
| 3.454999999999948 | 0.843 | 0.852 | 0.878 | 0.919 | 0.943 | 0.974 | 1.04 | 1.116 | 1.2 | 1.29 | 1.384 |
| 3.457499999999948 | 0.843 | 0.852 | 0.878 | 0.919 | 0.943 | 0.974 | 1.04 | 1.116 | 1.2 | 1.289 | 1.384 |
| 3.459999999999948 | 0.843 | 0.852 | 0.878 | 0.919 | 0.943 | 0.974 | 1.04 | 1.116 | 1.199 | 1.289 | 1.383 |
| 3.462499999999947 | 0.843 | 0.852 | 0.878 | 0.919 | 0.943 | 0.974 | 1.04 | 1.116 | 1.199 | 1.289 | 1.383 |
| 3.464999999999947 | 0.843 | 0.852 | 0.878 | 0.919 | 0.943 | 0.974 | 1.04 | 1.116 | 1.199 | 1.288 | 1.382 |
| 3.467499999999947 | 0.844 | 0.852 | 0.878 | 0.919 | 0.943 | 0.974 | 1.04 | 1.115 | 1.199 | 1.288 | 1.382 |
| 3.469999999999947 | 0.844 | 0.852 | 0.878 | 0.919 | 0.943 | 0.974 | 1.04 | 1.115 | 1.198 | 1.288 | 1.382 |
| 3.472499999999947 | 0.844 | 0.853 | 0.878 | 0.919 | 0.943 | 0.974 | 1.04 | 1.115 | 1.198 | 1.287 | 1.381 |
| 3.474999999999947 | 0.844 | 0.853 | 0.878 | 0.919 | 0.943 | 0.974 | 1.04 | 1.115 | 1.198 | 1.287 | 1.381 |
| 3.477499999999947 | 0.844 | 0.853 | 0.878 | 0.919 | 0.943 | 0.974 | 1.04 | 1.115 | 1.198 | 1.286 | 1.38 |
| 3.479999999999947 | 0.844 | 0.853 | 0.878 | 0.919 | 0.943 | 0.974 | 1.039 | 1.115 | 1.197 | 1.286 | 1.38 |
| 3.482499999999947 | 0.844 | 0.853 | 0.878 | 0.919 | 0.943 | 0.974 | 1.039 | 1.114 | 1.197 | 1.286 | 1.38 |
| 3.484999999999947 | 0.844 | 0.853 | 0.879 | 0.919 | 0.943 | 0.974 | 1.039 | 1.114 | 1.197 | 1.285 | 1.379 |
| 3.487499999999947 | 0.845 | 0.853 | 0.879 | 0.919 | 0.943 | 0.974 | 1.039 | 1.114 | 1.197 | 1.285 | 1.379 |
| 3.489999999999947 | 0.845 | 0.853 | 0.879 | 0.919 | 0.943 | 0.974 | 1.039 | 1.114 | 1.196 | 1.285 | 1.378 |
| 3.492499999999947 | 0.845 | 0.853 | 0.879 | 0.919 | 0.943 | 0.974 | 1.039 | 1.114 | 1.196 | 1.284 | 1.378 |
| 3.494999999999947 | 0.845 | 0.854 | 0.879 | 0.919 | 0.943 | 0.973 | 1.039 | 1.113 | 1.196 | 1.284 | 1.377 |
| 3.497499999999947 | 0.845 | 0.854 | 0.879 | 0.919 | 0.943 | 0.973 | 1.039 | 1.113 | 1.195 | 1.284 | 1.377 |
| 3.499999999999947 | 0.845 | 0.854 | 0.879 | 0.92 | 0.943 | 0.973 | 1.039 | 1.113 | 1.195 | 1.283 | 1.377 |
| 3.502499999999947 | 0.845 | 0.854 | 0.879 | 0.92 | 0.943 | 0.973 | 1.039 | 1.113 | 1.195 | 1.283 | 1.376 |
| 3.504999999999947 | 0.845 | 0.854 | 0.879 | 0.92 | 0.943 | 0.973 | 1.038 | 1.113 | 1.195 | 1.283 | 1.376 |
| 3.507499999999947 | 0.846 | 0.854 | 0.879 | 0.92 | 0.943 | 0.973 | 1.038 | 1.113 | 1.194 | 1.282 | 1.375 |
| 3.509999999999946 | 0.846 | 0.854 | 0.879 | 0.92 | 0.943 | 0.973 | 1.038 | 1.112 | 1.194 | 1.282 | 1.375 |
| 3.512499999999946 | 0.846 | 0.854 | 0.879 | 0.92 | 0.943 | 0.973 | 1.038 | 1.112 | 1.194 | 1.282 | 1.375 |
| 3.514999999999946 | 0.846 | 0.854 | 0.879 | 0.92 | 0.943 | 0.973 | 1.038 | 1.112 | 1.194 | 1.281 | 1.374 |
| 3.517499999999946 | 0.846 | 0.854 | 0.88 | 0.92 | 0.943 | 0.973 | 1.038 | 1.112 | 1.193 | 1.281 | 1.374 |
| 3.519999999999946 | 0.846 | 0.855 | 0.88 | 0.92 | 0.943 | 0.973 | 1.038 | 1.112 | 1.193 | 1.281 | 1.373 |
| 3.522499999999946 | 0.846 | 0.855 | 0.88 | 0.92 | 0.943 | 0.973 | 1.038 | 1.112 | 1.193 | 1.28 | 1.373 |
| 3.524999999999946 | 0.846 | 0.855 | 0.88 | 0.92 | 0.943 | 0.973 | 1.038 | 1.111 | 1.193 | 1.28 | 1.372 |
| 3.527499999999946 | 0.846 | 0.855 | 0.88 | 0.92 | 0.943 | 0.973 | 1.037 | 1.111 | 1.192 | 1.28 | 1.372 |
| 3.529999999999946 | 0.847 | 0.855 | 0.88 | 0.92 | 0.943 | 0.973 | 1.037 | 1.111 | 1.192 | 1.279 | 1.372 |
| 3.532499999999946 | 0.847 | 0.855 | 0.88 | 0.92 | 0.943 | 0.973 | 1.037 | 1.111 | 1.192 | 1.279 | 1.371 |
| 3.534999999999946 | 0.847 | 0.855 | 0.88 | 0.92 | 0.943 | 0.973 | 1.037 | 1.111 | 1.192 | 1.279 | 1.371 |
| 3.537499999999946 | 0.847 | 0.855 | 0.88 | 0.92 | 0.943 | 0.973 | 1.037 | 1.11 | 1.191 | 1.278 | 1.37 |
| 3.539999999999946 | 0.847 | 0.855 | 0.88 | 0.92 | 0.943 | 0.973 | 1.037 | 1.11 | 1.191 | 1.278 | 1.37 |
| 3.542499999999946 | 0.847 | 0.856 | 0.88 | 0.92 | 0.943 | 0.973 | 1.037 | 1.11 | 1.191 | 1.278 | 1.37 |
| 3.544999999999946 | 0.847 | 0.856 | 0.88 | 0.92 | 0.943 | 0.973 | 1.037 | 1.11 | 1.191 | 1.277 | 1.369 |
| 3.547499999999946 | 0.847 | 0.856 | 0.88 | 0.92 | 0.943 | 0.973 | 1.037 | 1.11 | 1.19 | 1.277 | 1.369 |
| 3.549999999999946 | 0.848 | 0.856 | 0.881 | 0.92 | 0.943 | 0.973 | 1.037 | 1.11 | 1.19 | 1.277 | 1.368 |
| 3.552499999999946 | 0.848 | 0.856 | 0.881 | 0.92 | 0.943 | 0.973 | 1.037 | 1.109 | 1.19 | 1.276 | 1.368 |
| 3.554999999999946 | 0.848 | 0.856 | 0.881 | 0.92 | 0.943 | 0.973 | 1.036 | 1.109 | 1.19 | 1.276 | 1.368 |
| 3.557499999999945 | 0.848 | 0.856 | 0.881 | 0.92 | 0.943 | 0.973 | 1.036 | 1.109 | 1.189 | 1.276 | 1.367 |
| 3.559999999999945 | 0.848 | 0.856 | 0.881 | 0.92 | 0.943 | 0.973 | 1.036 | 1.109 | 1.189 | 1.276 | 1.367 |
| 3.562499999999945 | 0.848 | 0.856 | 0.881 | 0.92 | 0.943 | 0.973 | 1.036 | 1.109 | 1.189 | 1.275 | 1.366 |
| 3.564999999999945 | 0.848 | 0.857 | 0.881 | 0.92 | 0.943 | 0.973 | 1.036 | 1.109 | 1.189 | 1.275 | 1.366 |
| 3.567499999999945 | 0.848 | 0.857 | 0.881 | 0.92 | 0.943 | 0.973 | 1.036 | 1.108 | 1.188 | 1.275 | 1.366 |
| 3.569999999999945 | 0.848 | 0.857 | 0.881 | 0.92 | 0.943 | 0.973 | 1.036 | 1.108 | 1.188 | 1.274 | 1.365 |
| 3.572499999999945 | 0.849 | 0.857 | 0.881 | 0.92 | 0.943 | 0.973 | 1.036 | 1.108 | 1.188 | 1.274 | 1.365 |
| 3.574999999999945 | 0.849 | 0.857 | 0.881 | 0.92 | 0.943 | 0.972 | 1.036 | 1.108 | 1.188 | 1.274 | 1.364 |
| 3.577499999999945 | 0.849 | 0.857 | 0.881 | 0.92 | 0.943 | 0.972 | 1.036 | 1.108 | 1.187 | 1.273 | 1.364 |
| 3.579999999999945 | 0.849 | 0.857 | 0.881 | 0.92 | 0.943 | 0.972 | 1.035 | 1.108 | 1.187 | 1.273 | 1.364 |
| 3.582499999999945 | 0.849 | 0.857 | 0.881 | 0.92 | 0.943 | 0.972 | 1.035 | 1.107 | 1.187 | 1.273 | 1.363 |
| 3.584999999999945 | 0.849 | 0.857 | 0.882 | 0.92 | 0.943 | 0.972 | 1.035 | 1.107 | 1.187 | 1.272 | 1.363 |
| 3.587499999999945 | 0.849 | 0.857 | 0.882 | 0.921 | 0.943 | 0.972 | 1.035 | 1.107 | 1.186 | 1.272 | 1.362 |
| 3.589999999999945 | 0.849 | 0.858 | 0.882 | 0.921 | 0.943 | 0.972 | 1.035 | 1.107 | 1.186 | 1.272 | 1.362 |
| 3.592499999999945 | 0.849 | 0.858 | 0.882 | 0.921 | 0.943 | 0.972 | 1.035 | 1.107 | 1.186 | 1.271 | 1.362 |
| 3.594999999999945 | 0.85 | 0.858 | 0.882 | 0.921 | 0.943 | 0.972 | 1.035 | 1.107 | 1.186 | 1.271 | 1.361 |
| 3.597499999999945 | 0.85 | 0.858 | 0.882 | 0.921 | 0.943 | 0.972 | 1.035 | 1.106 | 1.186 | 1.271 | 1.361 |
| 3.599999999999945 | 0.85 | 0.858 | 0.882 | 0.921 | 0.943 | 0.972 | 1.035 | 1.106 | 1.185 | 1.27 | 1.36 |
| 3.602499999999944 | 0.85 | 0.858 | 0.882 | 0.921 | 0.943 | 0.972 | 1.035 | 1.106 | 1.185 | 1.27 | 1.36 |
| 3.604999999999944 | 0.85 | 0.858 | 0.882 | 0.921 | 0.943 | 0.972 | 1.034 | 1.106 | 1.185 | 1.27 | 1.36 |
| 3.607499999999944 | 0.85 | 0.858 | 0.882 | 0.921 | 0.943 | 0.972 | 1.034 | 1.106 | 1.185 | 1.269 | 1.359 |
| 3.609999999999944 | 0.85 | 0.858 | 0.882 | 0.921 | 0.943 | 0.972 | 1.034 | 1.106 | 1.184 | 1.269 | 1.359 |
| 3.612499999999944 | 0.85 | 0.859 | 0.882 | 0.921 | 0.943 | 0.972 | 1.034 | 1.105 | 1.184 | 1.269 | 1.358 |
| 3.614999999999944 | 0.851 | 0.859 | 0.882 | 0.921 | 0.943 | 0.972 | 1.034 | 1.105 | 1.184 | 1.268 | 1.358 |
| 3.617499999999944 | 0.851 | 0.859 | 0.883 | 0.921 | 0.943 | 0.972 | 1.034 | 1.105 | 1.184 | 1.268 | 1.358 |
| 3.619999999999944 | 0.851 | 0.859 | 0.883 | 0.921 | 0.943 | 0.972 | 1.034 | 1.105 | 1.183 | 1.268 | 1.357 |
| 3.622499999999944 | 0.851 | 0.859 | 0.883 | 0.921 | 0.943 | 0.972 | 1.034 | 1.105 | 1.183 | 1.268 | 1.357 |
| 3.624999999999944 | 0.851 | 0.859 | 0.883 | 0.921 | 0.943 | 0.972 | 1.034 | 1.105 | 1.183 | 1.267 | 1.356 |
| 3.627499999999944 | 0.851 | 0.859 | 0.883 | 0.921 | 0.943 | 0.972 | 1.034 | 1.104 | 1.183 | 1.267 | 1.356 |
| 3.629999999999944 | 0.851 | 0.859 | 0.883 | 0.921 | 0.943 | 0.972 | 1.034 | 1.104 | 1.182 | 1.267 | 1.356 |
| 3.632499999999944 | 0.851 | 0.859 | 0.883 | 0.921 | 0.943 | 0.972 | 1.033 | 1.104 | 1.182 | 1.266 | 1.355 |
| 3.634999999999944 | 0.851 | 0.859 | 0.883 | 0.921 | 0.943 | 0.972 | 1.033 | 1.104 | 1.182 | 1.266 | 1.355 |
| 3.637499999999944 | 0.852 | 0.86 | 0.883 | 0.921 | 0.943 | 0.972 | 1.033 | 1.104 | 1.182 | 1.266 | 1.355 |
| 3.639999999999944 | 0.852 | 0.86 | 0.883 | 0.921 | 0.943 | 0.972 | 1.033 | 1.104 | 1.181 | 1.265 | 1.354 |
| 3.642499999999944 | 0.852 | 0.86 | 0.883 | 0.921 | 0.943 | 0.972 | 1.033 | 1.103 | 1.181 | 1.265 | 1.354 |
| 3.644999999999944 | 0.852 | 0.86 | 0.883 | 0.921 | 0.943 | 0.972 | 1.033 | 1.103 | 1.181 | 1.265 | 1.353 |
| 3.647499999999943 | 0.852 | 0.86 | 0.883 | 0.921 | 0.943 | 0.972 | 1.033 | 1.103 | 1.181 | 1.264 | 1.353 |
| 3.649999999999943 | 0.852 | 0.86 | 0.883 | 0.921 | 0.943 | 0.972 | 1.033 | 1.103 | 1.181 | 1.264 | 1.353 |
| 3.652499999999943 | 0.852 | 0.86 | 0.884 | 0.921 | 0.943 | 0.972 | 1.033 | 1.103 | 1.18 | 1.264 | 1.352 |
| 3.654999999999943 | 0.852 | 0.86 | 0.884 | 0.921 | 0.943 | 0.972 | 1.033 | 1.103 | 1.18 | 1.263 | 1.352 |
| 3.657499999999943 | 0.852 | 0.86 | 0.884 | 0.921 | 0.943 | 0.972 | 1.033 | 1.102 | 1.18 | 1.263 | 1.351 |
| 3.659999999999943 | 0.853 | 0.86 | 0.884 | 0.921 | 0.943 | 0.971 | 1.032 | 1.102 | 1.18 | 1.263 | 1.351 |
| 3.662499999999943 | 0.853 | 0.861 | 0.884 | 0.921 | 0.943 | 0.971 | 1.032 | 1.102 | 1.179 | 1.263 | 1.351 |
| 3.664999999999943 | 0.853 | 0.861 | 0.884 | 0.921 | 0.943 | 0.971 | 1.032 | 1.102 | 1.179 | 1.262 | 1.35 |
| 3.667499999999943 | 0.853 | 0.861 | 0.884 | 0.921 | 0.943 | 0.971 | 1.032 | 1.102 | 1.179 | 1.262 | 1.35 |
| 3.669999999999943 | 0.853 | 0.861 | 0.884 | 0.921 | 0.943 | 0.971 | 1.032 | 1.102 | 1.179 | 1.262 | 1.35 |
| 3.672499999999943 | 0.853 | 0.861 | 0.884 | 0.921 | 0.943 | 0.971 | 1.032 | 1.101 | 1.178 | 1.261 | 1.349 |
| 3.674999999999943 | 0.853 | 0.861 | 0.884 | 0.921 | 0.943 | 0.971 | 1.032 | 1.101 | 1.178 | 1.261 | 1.349 |
| 3.677499999999943 | 0.853 | 0.861 | 0.884 | 0.922 | 0.943 | 0.971 | 1.032 | 1.101 | 1.178 | 1.261 | 1.348 |
| 3.679999999999943 | 0.853 | 0.861 | 0.884 | 0.922 | 0.943 | 0.971 | 1.032 | 1.101 | 1.178 | 1.26 | 1.348 |
| 3.682499999999943 | 0.853 | 0.861 | 0.884 | 0.922 | 0.943 | 0.971 | 1.032 | 1.101 | 1.177 | 1.26 | 1.348 |
| 3.684999999999943 | 0.854 | 0.861 | 0.884 | 0.922 | 0.943 | 0.971 | 1.031 | 1.101 | 1.177 | 1.26 | 1.347 |
| 3.687499999999943 | 0.854 | 0.862 | 0.885 | 0.922 | 0.943 | 0.971 | 1.031 | 1.101 | 1.177 | 1.26 | 1.347 |
| 3.689999999999943 | 0.854 | 0.862 | 0.885 | 0.922 | 0.943 | 0.971 | 1.031 | 1.1 | 1.177 | 1.259 | 1.347 |
| 3.692499999999942 | 0.854 | 0.862 | 0.885 | 0.922 | 0.943 | 0.971 | 1.031 | 1.1 | 1.177 | 1.259 | 1.346 |
| 3.694999999999942 | 0.854 | 0.862 | 0.885 | 0.922 | 0.943 | 0.971 | 1.031 | 1.1 | 1.176 | 1.259 | 1.346 |
| 3.697499999999942 | 0.854 | 0.862 | 0.885 | 0.922 | 0.943 | 0.971 | 1.031 | 1.1 | 1.176 | 1.258 | 1.345 |
| 3.699999999999942 | 0.854 | 0.862 | 0.885 | 0.922 | 0.943 | 0.971 | 1.031 | 1.1 | 1.176 | 1.258 | 1.345 |
| 3.702499999999942 | 0.854 | 0.862 | 0.885 | 0.922 | 0.943 | 0.971 | 1.031 | 1.1 | 1.176 | 1.258 | 1.345 |
| 3.704999999999942 | 0.854 | 0.862 | 0.885 | 0.922 | 0.943 | 0.971 | 1.031 | 1.099 | 1.175 | 1.257 | 1.344 |
| 3.707499999999942 | 0.855 | 0.862 | 0.885 | 0.922 | 0.943 | 0.971 | 1.031 | 1.099 | 1.175 | 1.257 | 1.344 |
| 3.709999999999942 | 0.855 | 0.862 | 0.885 | 0.922 | 0.943 | 0.971 | 1.031 | 1.099 | 1.175 | 1.257 | 1.344 |
| 3.712499999999942 | 0.855 | 0.862 | 0.885 | 0.922 | 0.943 | 0.971 | 1.031 | 1.099 | 1.175 | 1.257 | 1.343 |
| 3.714999999999942 | 0.855 | 0.863 | 0.885 | 0.922 | 0.943 | 0.971 | 1.03 | 1.099 | 1.175 | 1.256 | 1.343 |
| 3.717499999999942 | 0.855 | 0.863 | 0.885 | 0.922 | 0.943 | 0.971 | 1.03 | 1.099 | 1.174 | 1.256 | 1.342 |
| 3.719999999999942 | 0.855 | 0.863 | 0.885 | 0.922 | 0.943 | 0.971 | 1.03 | 1.099 | 1.174 | 1.256 | 1.342 |
| 3.722499999999942 | 0.855 | 0.863 | 0.886 | 0.922 | 0.943 | 0.971 | 1.03 | 1.098 | 1.174 | 1.255 | 1.342 |
| 3.724999999999942 | 0.855 | 0.863 | 0.886 | 0.922 | 0.943 | 0.971 | 1.03 | 1.098 | 1.174 | 1.255 | 1.341 |
| 3.727499999999942 | 0.855 | 0.863 | 0.886 | 0.922 | 0.943 | 0.971 | 1.03 | 1.098 | 1.173 | 1.255 | 1.341 |
| 3.729999999999942 | 0.856 | 0.863 | 0.886 | 0.922 | 0.943 | 0.971 | 1.03 | 1.098 | 1.173 | 1.254 | 1.341 |
| 3.732499999999942 | 0.856 | 0.863 | 0.886 | 0.922 | 0.943 | 0.971 | 1.03 | 1.098 | 1.173 | 1.254 | 1.34 |
| 3.734999999999942 | 0.856 | 0.863 | 0.886 | 0.922 | 0.943 | 0.971 | 1.03 | 1.098 | 1.173 | 1.254 | 1.34 |
| 3.737499999999942 | 0.856 | 0.863 | 0.886 | 0.922 | 0.943 | 0.971 | 1.03 | 1.097 | 1.172 | 1.254 | 1.339 |
| 3.739999999999942 | 0.856 | 0.864 | 0.886 | 0.922 | 0.943 | 0.971 | 1.03 | 1.097 | 1.172 | 1.253 | 1.339 |
| 3.742499999999941 | 0.856 | 0.864 | 0.886 | 0.922 | 0.943 | 0.971 | 1.029 | 1.097 | 1.172 | 1.253 | 1.339 |
| 3.744999999999941 | 0.856 | 0.864 | 0.886 | 0.922 | 0.943 | 0.971 | 1.029 | 1.097 | 1.172 | 1.253 | 1.338 |
| 3.747499999999941 | 0.856 | 0.864 | 0.886 | 0.922 | 0.943 | 0.971 | 1.029 | 1.097 | 1.172 | 1.252 | 1.338 |
| 3.749999999999941 | 0.856 | 0.864 | 0.886 | 0.922 | 0.943 | 0.971 | 1.029 | 1.097 | 1.171 | 1.252 | 1.338 |
| 3.752499999999941 | 0.856 | 0.864 | 0.886 | 0.922 | 0.943 | 0.971 | 1.029 | 1.097 | 1.171 | 1.252 | 1.337 |
| 3.754999999999941 | 0.857 | 0.864 | 0.886 | 0.922 | 0.943 | 0.97 | 1.029 | 1.096 | 1.171 | 1.251 | 1.337 |
| 3.757499999999941 | 0.857 | 0.864 | 0.886 | 0.922 | 0.943 | 0.97 | 1.029 | 1.096 | 1.171 | 1.251 | 1.337 |
| 3.759999999999941 | 0.857 | 0.864 | 0.887 | 0.922 | 0.943 | 0.97 | 1.029 | 1.096 | 1.171 | 1.251 | 1.336 |
| 3.762499999999941 | 0.857 | 0.864 | 0.887 | 0.922 | 0.943 | 0.97 | 1.029 | 1.096 | 1.17 | 1.251 | 1.336 |
| 3.764999999999941 | 0.857 | 0.864 | 0.887 | 0.922 | 0.943 | 0.97 | 1.029 | 1.096 | 1.17 | 1.25 | 1.335 |
| 3.767499999999941 | 0.857 | 0.865 | 0.887 | 0.923 | 0.943 | 0.97 | 1.029 | 1.096 | 1.17 | 1.25 | 1.335 |
| 3.769999999999941 | 0.857 | 0.865 | 0.887 | 0.923 | 0.943 | 0.97 | 1.029 | 1.095 | 1.17 | 1.25 | 1.335 |
| 3.772499999999941 | 0.857 | 0.865 | 0.887 | 0.923 | 0.943 | 0.97 | 1.028 | 1.095 | 1.169 | 1.249 | 1.334 |
| 3.774999999999941 | 0.857 | 0.865 | 0.887 | 0.923 | 0.943 | 0.97 | 1.028 | 1.095 | 1.169 | 1.249 | 1.334 |
| 3.777499999999941 | 0.857 | 0.865 | 0.887 | 0.923 | 0.943 | 0.97 | 1.028 | 1.095 | 1.169 | 1.249 | 1.334 |
| 3.779999999999941 | 0.858 | 0.865 | 0.887 | 0.923 | 0.943 | 0.97 | 1.028 | 1.095 | 1.169 | 1.249 | 1.333 |
| 3.782499999999941 | 0.858 | 0.865 | 0.887 | 0.923 | 0.943 | 0.97 | 1.028 | 1.095 | 1.169 | 1.248 | 1.333 |
| 3.784999999999941 | 0.858 | 0.865 | 0.887 | 0.923 | 0.943 | 0.97 | 1.028 | 1.095 | 1.168 | 1.248 | 1.333 |
| 3.78749999999994 | 0.858 | 0.865 | 0.887 | 0.923 | 0.943 | 0.97 | 1.028 | 1.094 | 1.168 | 1.248 | 1.332 |
| 3.78999999999994 | 0.858 | 0.865 | 0.887 | 0.923 | 0.943 | 0.97 | 1.028 | 1.094 | 1.168 | 1.247 | 1.332 |
| 3.79249999999994 | 0.858 | 0.866 | 0.887 | 0.923 | 0.943 | 0.97 | 1.028 | 1.094 | 1.168 | 1.247 | 1.332 |
| 3.79499999999994 | 0.858 | 0.866 | 0.887 | 0.923 | 0.943 | 0.97 | 1.028 | 1.094 | 1.167 | 1.247 | 1.331 |
| 3.79749999999994 | 0.858 | 0.866 | 0.888 | 0.923 | 0.943 | 0.97 | 1.028 | 1.094 | 1.167 | 1.247 | 1.331 |
| 3.79999999999994 | 0.858 | 0.866 | 0.888 | 0.923 | 0.943 | 0.97 | 1.028 | 1.094 | 1.167 | 1.246 | 1.33 |
| 3.80249999999994 | 0.858 | 0.866 | 0.888 | 0.923 | 0.943 | 0.97 | 1.027 | 1.094 | 1.167 | 1.246 | 1.33 |
| 3.80499999999994 | 0.859 | 0.866 | 0.888 | 0.923 | 0.943 | 0.97 | 1.027 | 1.093 | 1.167 | 1.246 | 1.33 |
| 3.80749999999994 | 0.859 | 0.866 | 0.888 | 0.923 | 0.943 | 0.97 | 1.027 | 1.093 | 1.166 | 1.245 | 1.329 |
| 3.80999999999994 | 0.859 | 0.866 | 0.888 | 0.923 | 0.943 | 0.97 | 1.027 | 1.093 | 1.166 | 1.245 | 1.329 |
| 3.81249999999994 | 0.859 | 0.866 | 0.888 | 0.923 | 0.943 | 0.97 | 1.027 | 1.093 | 1.166 | 1.245 | 1.329 |
| 3.81499999999994 | 0.859 | 0.866 | 0.888 | 0.923 | 0.943 | 0.97 | 1.027 | 1.093 | 1.166 | 1.245 | 1.328 |
| 3.81749999999994 | 0.859 | 0.866 | 0.888 | 0.923 | 0.943 | 0.97 | 1.027 | 1.093 | 1.166 | 1.244 | 1.328 |
| 3.81999999999994 | 0.859 | 0.867 | 0.888 | 0.923 | 0.943 | 0.97 | 1.027 | 1.092 | 1.165 | 1.244 | 1.328 |
| 3.82249999999994 | 0.859 | 0.867 | 0.888 | 0.923 | 0.943 | 0.97 | 1.027 | 1.092 | 1.165 | 1.244 | 1.327 |
| 3.82499999999994 | 0.859 | 0.867 | 0.888 | 0.923 | 0.943 | 0.97 | 1.027 | 1.092 | 1.165 | 1.243 | 1.327 |
| 3.82749999999994 | 0.859 | 0.867 | 0.888 | 0.923 | 0.943 | 0.97 | 1.027 | 1.092 | 1.165 | 1.243 | 1.327 |
| 3.82999999999994 | 0.86 | 0.867 | 0.888 | 0.923 | 0.943 | 0.97 | 1.027 | 1.092 | 1.164 | 1.243 | 1.326 |
| 3.83249999999994 | 0.86 | 0.867 | 0.888 | 0.923 | 0.943 | 0.97 | 1.026 | 1.092 | 1.164 | 1.243 | 1.326 |
| 3.83499999999994 | 0.86 | 0.867 | 0.889 | 0.923 | 0.943 | 0.97 | 1.026 | 1.092 | 1.164 | 1.242 | 1.326 |
| 3.837499999999939 | 0.86 | 0.867 | 0.889 | 0.923 | 0.943 | 0.97 | 1.026 | 1.091 | 1.164 | 1.242 | 1.325 |
| 3.839999999999939 | 0.86 | 0.867 | 0.889 | 0.923 | 0.943 | 0.97 | 1.026 | 1.091 | 1.164 | 1.242 | 1.325 |
| 3.842499999999939 | 0.86 | 0.867 | 0.889 | 0.923 | 0.943 | 0.97 | 1.026 | 1.091 | 1.163 | 1.242 | 1.325 |
| 3.844999999999939 | 0.86 | 0.867 | 0.889 | 0.923 | 0.943 | 0.97 | 1.026 | 1.091 | 1.163 | 1.241 | 1.324 |
| 3.847499999999939 | 0.86 | 0.868 | 0.889 | 0.923 | 0.943 | 0.97 | 1.026 | 1.091 | 1.163 | 1.241 | 1.324 |
| 3.849999999999939 | 0.86 | 0.868 | 0.889 | 0.923 | 0.943 | 0.97 | 1.026 | 1.091 | 1.163 | 1.241 | 1.323 |
| 3.852499999999939 | 0.86 | 0.868 | 0.889 | 0.923 | 0.943 | 0.97 | 1.026 | 1.091 | 1.163 | 1.24 | 1.323 |
| 3.854999999999939 | 0.861 | 0.868 | 0.889 | 0.923 | 0.943 | 0.97 | 1.026 | 1.09 | 1.162 | 1.24 | 1.323 |
| 3.857499999999939 | 0.861 | 0.868 | 0.889 | 0.923 | 0.943 | 0.969 | 1.026 | 1.09 | 1.162 | 1.24 | 1.322 |
| 3.859999999999939 | 0.861 | 0.868 | 0.889 | 0.923 | 0.943 | 0.969 | 1.026 | 1.09 | 1.162 | 1.24 | 1.322 |
| 3.862499999999939 | 0.861 | 0.868 | 0.889 | 0.924 | 0.943 | 0.969 | 1.025 | 1.09 | 1.162 | 1.239 | 1.322 |
| 3.864999999999939 | 0.861 | 0.868 | 0.889 | 0.924 | 0.943 | 0.969 | 1.025 | 1.09 | 1.162 | 1.239 | 1.321 |
| 3.867499999999939 | 0.861 | 0.868 | 0.889 | 0.924 | 0.943 | 0.969 | 1.025 | 1.09 | 1.161 | 1.239 | 1.321 |
| 3.869999999999939 | 0.861 | 0.868 | 0.889 | 0.924 | 0.943 | 0.969 | 1.025 | 1.09 | 1.161 | 1.238 | 1.321 |
| 3.872499999999939 | 0.861 | 0.868 | 0.89 | 0.924 | 0.943 | 0.969 | 1.025 | 1.089 | 1.161 | 1.238 | 1.32 |
| 3.874999999999939 | 0.861 | 0.868 | 0.89 | 0.924 | 0.943 | 0.969 | 1.025 | 1.089 | 1.161 | 1.238 | 1.32 |
| 3.877499999999939 | 0.861 | 0.869 | 0.89 | 0.924 | 0.943 | 0.969 | 1.025 | 1.089 | 1.16 | 1.238 | 1.32 |
| 3.879999999999939 | 0.862 | 0.869 | 0.89 | 0.924 | 0.943 | 0.969 | 1.025 | 1.089 | 1.16 | 1.237 | 1.319 |
| 3.882499999999938 | 0.862 | 0.869 | 0.89 | 0.924 | 0.944 | 0.969 | 1.025 | 1.089 | 1.16 | 1.237 | 1.319 |
| 3.884999999999938 | 0.862 | 0.869 | 0.89 | 0.924 | 0.944 | 0.969 | 1.025 | 1.089 | 1.16 | 1.237 | 1.319 |
| 3.887499999999938 | 0.862 | 0.869 | 0.89 | 0.924 | 0.944 | 0.969 | 1.025 | 1.089 | 1.16 | 1.237 | 1.318 |
| 3.889999999999938 | 0.862 | 0.869 | 0.89 | 0.924 | 0.944 | 0.969 | 1.025 | 1.088 | 1.159 | 1.236 | 1.318 |
| 3.892499999999938 | 0.862 | 0.869 | 0.89 | 0.924 | 0.944 | 0.969 | 1.025 | 1.088 | 1.159 | 1.236 | 1.318 |
| 3.894999999999938 | 0.862 | 0.869 | 0.89 | 0.924 | 0.944 | 0.969 | 1.024 | 1.088 | 1.159 | 1.236 | 1.317 |
| 3.897499999999938 | 0.862 | 0.869 | 0.89 | 0.924 | 0.944 | 0.969 | 1.024 | 1.088 | 1.159 | 1.236 | 1.317 |
| 3.899999999999938 | 0.862 | 0.869 | 0.89 | 0.924 | 0.944 | 0.969 | 1.024 | 1.088 | 1.159 | 1.235 | 1.317 |
| 3.902499999999938 | 0.862 | 0.869 | 0.89 | 0.924 | 0.944 | 0.969 | 1.024 | 1.088 | 1.158 | 1.235 | 1.316 |
| 3.904999999999938 | 0.863 | 0.87 | 0.89 | 0.924 | 0.944 | 0.969 | 1.024 | 1.088 | 1.158 | 1.235 | 1.316 |
| 3.907499999999938 | 0.863 | 0.87 | 0.89 | 0.924 | 0.944 | 0.969 | 1.024 | 1.088 | 1.158 | 1.234 | 1.316 |
| 3.909999999999938 | 0.863 | 0.87 | 0.89 | 0.924 | 0.944 | 0.969 | 1.024 | 1.087 | 1.158 | 1.234 | 1.315 |
| 3.912499999999938 | 0.863 | 0.87 | 0.891 | 0.924 | 0.944 | 0.969 | 1.024 | 1.087 | 1.158 | 1.234 | 1.315 |
| 3.914999999999938 | 0.863 | 0.87 | 0.891 | 0.924 | 0.944 | 0.969 | 1.024 | 1.087 | 1.157 | 1.234 | 1.315 |
| 3.917499999999938 | 0.863 | 0.87 | 0.891 | 0.924 | 0.944 | 0.969 | 1.024 | 1.087 | 1.157 | 1.233 | 1.314 |
| 3.919999999999938 | 0.863 | 0.87 | 0.891 | 0.924 | 0.944 | 0.969 | 1.024 | 1.087 | 1.157 | 1.233 | 1.314 |
| 3.922499999999938 | 0.863 | 0.87 | 0.891 | 0.924 | 0.944 | 0.969 | 1.024 | 1.087 | 1.157 | 1.233 | 1.314 |
| 3.924999999999938 | 0.863 | 0.87 | 0.891 | 0.924 | 0.944 | 0.969 | 1.024 | 1.087 | 1.157 | 1.233 | 1.313 |
| 3.927499999999938 | 0.863 | 0.87 | 0.891 | 0.924 | 0.944 | 0.969 | 1.023 | 1.086 | 1.156 | 1.232 | 1.313 |
| 3.929999999999938 | 0.863 | 0.87 | 0.891 | 0.924 | 0.944 | 0.969 | 1.023 | 1.086 | 1.156 | 1.232 | 1.313 |
| 3.932499999999937 | 0.864 | 0.87 | 0.891 | 0.924 | 0.944 | 0.969 | 1.023 | 1.086 | 1.156 | 1.232 | 1.312 |
| 3.934999999999937 | 0.864 | 0.871 | 0.891 | 0.924 | 0.944 | 0.969 | 1.023 | 1.086 | 1.156 | 1.231 | 1.312 |
| 3.937499999999937 | 0.864 | 0.871 | 0.891 | 0.924 | 0.944 | 0.969 | 1.023 | 1.086 | 1.156 | 1.231 | 1.312 |
| 3.939999999999937 | 0.864 | 0.871 | 0.891 | 0.924 | 0.944 | 0.969 | 1.023 | 1.086 | 1.155 | 1.231 | 1.311 |
| 3.942499999999937 | 0.864 | 0.871 | 0.891 | 0.924 | 0.944 | 0.969 | 1.023 | 1.086 | 1.155 | 1.231 | 1.311 |
| 3.944999999999937 | 0.864 | 0.871 | 0.891 | 0.924 | 0.944 | 0.969 | 1.023 | 1.085 | 1.155 | 1.23 | 1.311 |
| 3.947499999999937 | 0.864 | 0.871 | 0.891 | 0.924 | 0.944 | 0.969 | 1.023 | 1.085 | 1.155 | 1.23 | 1.31 |
| 3.949999999999937 | 0.864 | 0.871 | 0.891 | 0.924 | 0.944 | 0.969 | 1.023 | 1.085 | 1.155 | 1.23 | 1.31 |
| 3.952499999999937 | 0.864 | 0.871 | 0.892 | 0.924 | 0.944 | 0.969 | 1.023 | 1.085 | 1.154 | 1.23 | 1.31 |
| 3.954999999999937 | 0.864 | 0.871 | 0.892 | 0.924 | 0.944 | 0.969 | 1.023 | 1.085 | 1.154 | 1.229 | 1.309 |
| 3.957499999999937 | 0.864 | 0.871 | 0.892 | 0.924 | 0.944 | 0.969 | 1.023 | 1.085 | 1.154 | 1.229 | 1.309 |
| 3.959999999999937 | 0.865 | 0.871 | 0.892 | 0.925 | 0.944 | 0.969 | 1.022 | 1.085 | 1.154 | 1.229 | 1.309 |
| 3.962499999999937 | 0.865 | 0.872 | 0.892 | 0.925 | 0.944 | 0.969 | 1.022 | 1.085 | 1.154 | 1.229 | 1.308 |
| 3.964999999999937 | 0.865 | 0.872 | 0.892 | 0.925 | 0.944 | 0.969 | 1.022 | 1.084 | 1.153 | 1.228 | 1.308 |
| 3.967499999999937 | 0.865 | 0.872 | 0.892 | 0.925 | 0.944 | 0.969 | 1.022 | 1.084 | 1.153 | 1.228 | 1.308 |
| 3.969999999999937 | 0.865 | 0.872 | 0.892 | 0.925 | 0.944 | 0.968 | 1.022 | 1.084 | 1.153 | 1.228 | 1.307 |
| 3.972499999999937 | 0.865 | 0.872 | 0.892 | 0.925 | 0.944 | 0.968 | 1.022 | 1.084 | 1.153 | 1.228 | 1.307 |
| 3.974999999999937 | 0.865 | 0.872 | 0.892 | 0.925 | 0.944 | 0.968 | 1.022 | 1.084 | 1.153 | 1.227 | 1.307 |
| 3.977499999999936 | 0.865 | 0.872 | 0.892 | 0.925 | 0.944 | 0.968 | 1.022 | 1.084 | 1.152 | 1.227 | 1.306 |
| 3.979999999999936 | 0.865 | 0.872 | 0.892 | 0.925 | 0.944 | 0.968 | 1.022 | 1.084 | 1.152 | 1.227 | 1.306 |
| 3.982499999999936 | 0.865 | 0.872 | 0.892 | 0.925 | 0.944 | 0.968 | 1.022 | 1.083 | 1.152 | 1.227 | 1.306 |
| 3.984999999999936 | 0.865 | 0.872 | 0.892 | 0.925 | 0.944 | 0.968 | 1.022 | 1.083 | 1.152 | 1.226 | 1.305 |
| 3.987499999999936 | 0.866 | 0.872 | 0.892 | 0.925 | 0.944 | 0.968 | 1.022 | 1.083 | 1.152 | 1.226 | 1.305 |
| 3.989999999999936 | 0.866 | 0.872 | 0.892 | 0.925 | 0.944 | 0.968 | 1.022 | 1.083 | 1.152 | 1.226 | 1.305 |
| 3.992499999999936 | 0.866 | 0.873 | 0.892 | 0.925 | 0.944 | 0.968 | 1.021 | 1.083 | 1.151 | 1.226 | 1.305 |
| 3.994999999999936 | 0.866 | 0.873 | 0.893 | 0.925 | 0.944 | 0.968 | 1.021 | 1.083 | 1.151 | 1.225 | 1.304 |
| 3.997499999999936 | 0.866 | 0.873 | 0.893 | 0.925 | 0.944 | 0.968 | 1.021 | 1.083 | 1.151 | 1.225 | 1.304 |
| 3.999999999999936 | 0.866 | 0.873 | 0.893 | 0.925 | 0.944 | 0.968 | 1.021 | 1.083 | 1.151 | 1.225 | 1.304 |
| 4.002499999999936 | 0.866 | 0.873 | 0.893 | 0.925 | 0.944 | 0.968 | 1.021 | 1.082 | 1.151 | 1.224 | 1.303 |
| 4.004999999999937 | 0.866 | 0.873 | 0.893 | 0.925 | 0.944 | 0.968 | 1.021 | 1.082 | 1.15 | 1.224 | 1.303 |
| 4.007499999999937 | 0.866 | 0.873 | 0.893 | 0.925 | 0.944 | 0.968 | 1.021 | 1.082 | 1.15 | 1.224 | 1.303 |
| 4.009999999999937 | 0.866 | 0.873 | 0.893 | 0.925 | 0.944 | 0.968 | 1.021 | 1.082 | 1.15 | 1.224 | 1.302 |
| 4.012499999999938 | 0.866 | 0.873 | 0.893 | 0.925 | 0.944 | 0.968 | 1.021 | 1.082 | 1.15 | 1.223 | 1.302 |
| 4.014999999999938 | 0.867 | 0.873 | 0.893 | 0.925 | 0.944 | 0.968 | 1.021 | 1.082 | 1.15 | 1.223 | 1.302 |
| 4.017499999999939 | 0.867 | 0.873 | 0.893 | 0.925 | 0.944 | 0.968 | 1.021 | 1.082 | 1.149 | 1.223 | 1.301 |
| 4.01999999999994 | 0.867 | 0.873 | 0.893 | 0.925 | 0.944 | 0.968 | 1.021 | 1.081 | 1.149 | 1.223 | 1.301 |
| 4.02249999999994 | 0.867 | 0.874 | 0.893 | 0.925 | 0.944 | 0.968 | 1.021 | 1.081 | 1.149 | 1.222 | 1.301 |
| 4.02499999999994 | 0.867 | 0.874 | 0.893 | 0.925 | 0.944 | 0.968 | 1.021 | 1.081 | 1.149 | 1.222 | 1.3 |
| 4.02749999999994 | 0.867 | 0.874 | 0.893 | 0.925 | 0.944 | 0.968 | 1.02 | 1.081 | 1.149 | 1.222 | 1.3 |
| 4.029999999999941 | 0.867 | 0.874 | 0.893 | 0.925 | 0.944 | 0.968 | 1.02 | 1.081 | 1.148 | 1.222 | 1.3 |
| 4.032499999999941 | 0.867 | 0.874 | 0.893 | 0.925 | 0.944 | 0.968 | 1.02 | 1.081 | 1.148 | 1.221 | 1.299 |
| 4.034999999999942 | 0.867 | 0.874 | 0.894 | 0.925 | 0.944 | 0.968 | 1.02 | 1.081 | 1.148 | 1.221 | 1.299 |
| 4.037499999999942 | 0.867 | 0.874 | 0.894 | 0.925 | 0.944 | 0.968 | 1.02 | 1.081 | 1.148 | 1.221 | 1.299 |
| 4.039999999999942 | 0.867 | 0.874 | 0.894 | 0.925 | 0.944 | 0.968 | 1.02 | 1.08 | 1.148 | 1.221 | 1.298 |
| 4.042499999999943 | 0.868 | 0.874 | 0.894 | 0.925 | 0.944 | 0.968 | 1.02 | 1.08 | 1.148 | 1.22 | 1.298 |
| 4.044999999999943 | 0.868 | 0.874 | 0.894 | 0.925 | 0.944 | 0.968 | 1.02 | 1.08 | 1.147 | 1.22 | 1.298 |
| 4.047499999999943 | 0.868 | 0.874 | 0.894 | 0.925 | 0.944 | 0.968 | 1.02 | 1.08 | 1.147 | 1.22 | 1.298 |
| 4.049999999999944 | 0.868 | 0.874 | 0.894 | 0.925 | 0.944 | 0.968 | 1.02 | 1.08 | 1.147 | 1.22 | 1.297 |
| 4.052499999999944 | 0.868 | 0.874 | 0.894 | 0.925 | 0.944 | 0.968 | 1.02 | 1.08 | 1.147 | 1.219 | 1.297 |
| 4.054999999999945 | 0.868 | 0.875 | 0.894 | 0.925 | 0.944 | 0.968 | 1.02 | 1.08 | 1.147 | 1.219 | 1.297 |
| 4.057499999999945 | 0.868 | 0.875 | 0.894 | 0.925 | 0.944 | 0.968 | 1.02 | 1.08 | 1.146 | 1.219 | 1.296 |
| 4.059999999999945 | 0.868 | 0.875 | 0.894 | 0.926 | 0.944 | 0.968 | 1.02 | 1.079 | 1.146 | 1.219 | 1.296 |
| 4.062499999999946 | 0.868 | 0.875 | 0.894 | 0.926 | 0.944 | 0.968 | 1.019 | 1.079 | 1.146 | 1.218 | 1.296 |
| 4.064999999999946 | 0.868 | 0.875 | 0.894 | 0.926 | 0.944 | 0.968 | 1.019 | 1.079 | 1.146 | 1.218 | 1.295 |
| 4.067499999999947 | 0.868 | 0.875 | 0.894 | 0.926 | 0.944 | 0.968 | 1.019 | 1.079 | 1.146 | 1.218 | 1.295 |
| 4.069999999999947 | 0.869 | 0.875 | 0.894 | 0.926 | 0.944 | 0.968 | 1.019 | 1.079 | 1.145 | 1.218 | 1.295 |
| 4.072499999999947 | 0.869 | 0.875 | 0.894 | 0.926 | 0.944 | 0.968 | 1.019 | 1.079 | 1.145 | 1.217 | 1.294 |
| 4.074999999999948 | 0.869 | 0.875 | 0.894 | 0.926 | 0.944 | 0.968 | 1.019 | 1.079 | 1.145 | 1.217 | 1.294 |
| 4.077499999999948 | 0.869 | 0.875 | 0.895 | 0.926 | 0.944 | 0.968 | 1.019 | 1.079 | 1.145 | 1.217 | 1.294 |
| 4.079999999999948 | 0.869 | 0.875 | 0.895 | 0.926 | 0.944 | 0.968 | 1.019 | 1.078 | 1.145 | 1.217 | 1.294 |
| 4.082499999999949 | 0.869 | 0.875 | 0.895 | 0.926 | 0.944 | 0.968 | 1.019 | 1.078 | 1.145 | 1.217 | 1.293 |
| 4.084999999999949 | 0.869 | 0.876 | 0.895 | 0.926 | 0.944 | 0.968 | 1.019 | 1.078 | 1.144 | 1.216 | 1.293 |
| 4.08749999999995 | 0.869 | 0.876 | 0.895 | 0.926 | 0.944 | 0.968 | 1.019 | 1.078 | 1.144 | 1.216 | 1.293 |
| 4.08999999999995 | 0.869 | 0.876 | 0.895 | 0.926 | 0.944 | 0.968 | 1.019 | 1.078 | 1.144 | 1.216 | 1.292 |
| 4.09249999999995 | 0.869 | 0.876 | 0.895 | 0.926 | 0.944 | 0.968 | 1.019 | 1.078 | 1.144 | 1.216 | 1.292 |
| 4.094999999999951 | 0.869 | 0.876 | 0.895 | 0.926 | 0.944 | 0.968 | 1.019 | 1.078 | 1.144 | 1.215 | 1.292 |
| 4.097499999999951 | 0.869 | 0.876 | 0.895 | 0.926 | 0.944 | 0.967 | 1.019 | 1.078 | 1.143 | 1.215 | 1.291 |
| 4.099999999999952 | 0.87 | 0.876 | 0.895 | 0.926 | 0.944 | 0.967 | 1.018 | 1.077 | 1.143 | 1.215 | 1.291 |
| 4.102499999999952 | 0.87 | 0.876 | 0.895 | 0.926 | 0.944 | 0.967 | 1.018 | 1.077 | 1.143 | 1.215 | 1.291 |
| 4.104999999999952 | 0.87 | 0.876 | 0.895 | 0.926 | 0.944 | 0.967 | 1.018 | 1.077 | 1.143 | 1.214 | 1.29 |
| 4.107499999999953 | 0.87 | 0.876 | 0.895 | 0.926 | 0.944 | 0.967 | 1.018 | 1.077 | 1.143 | 1.214 | 1.29 |
| 4.109999999999953 | 0.87 | 0.876 | 0.895 | 0.926 | 0.944 | 0.967 | 1.018 | 1.077 | 1.143 | 1.214 | 1.29 |
| 4.112499999999954 | 0.87 | 0.876 | 0.895 | 0.926 | 0.944 | 0.967 | 1.018 | 1.077 | 1.142 | 1.214 | 1.29 |
| 4.114999999999954 | 0.87 | 0.876 | 0.895 | 0.926 | 0.944 | 0.967 | 1.018 | 1.077 | 1.142 | 1.213 | 1.289 |
| 4.117499999999954 | 0.87 | 0.877 | 0.895 | 0.926 | 0.944 | 0.967 | 1.018 | 1.077 | 1.142 | 1.213 | 1.289 |
| 4.119999999999955 | 0.87 | 0.877 | 0.895 | 0.926 | 0.944 | 0.967 | 1.018 | 1.076 | 1.142 | 1.213 | 1.289 |
| 4.122499999999955 | 0.87 | 0.877 | 0.896 | 0.926 | 0.944 | 0.967 | 1.018 | 1.076 | 1.142 | 1.213 | 1.288 |
| 4.124999999999956 | 0.87 | 0.877 | 0.896 | 0.926 | 0.944 | 0.967 | 1.018 | 1.076 | 1.141 | 1.212 | 1.288 |
| 4.127499999999956 | 0.87 | 0.877 | 0.896 | 0.926 | 0.944 | 0.967 | 1.018 | 1.076 | 1.141 | 1.212 | 1.288 |
| 4.129999999999956 | 0.871 | 0.877 | 0.896 | 0.926 | 0.944 | 0.967 | 1.018 | 1.076 | 1.141 | 1.212 | 1.287 |
| 4.132499999999957 | 0.871 | 0.877 | 0.896 | 0.926 | 0.944 | 0.967 | 1.018 | 1.076 | 1.141 | 1.212 | 1.287 |
| 4.134999999999957 | 0.871 | 0.877 | 0.896 | 0.926 | 0.944 | 0.967 | 1.017 | 1.076 | 1.141 | 1.211 | 1.287 |
| 4.137499999999958 | 0.871 | 0.877 | 0.896 | 0.926 | 0.944 | 0.967 | 1.017 | 1.076 | 1.141 | 1.211 | 1.287 |
| 4.139999999999958 | 0.871 | 0.877 | 0.896 | 0.926 | 0.944 | 0.967 | 1.017 | 1.076 | 1.14 | 1.211 | 1.286 |
| 4.142499999999958 | 0.871 | 0.877 | 0.896 | 0.926 | 0.944 | 0.967 | 1.017 | 1.075 | 1.14 | 1.211 | 1.286 |
| 4.144999999999959 | 0.871 | 0.877 | 0.896 | 0.926 | 0.944 | 0.967 | 1.017 | 1.075 | 1.14 | 1.211 | 1.286 |
| 4.147499999999959 | 0.871 | 0.877 | 0.896 | 0.926 | 0.944 | 0.967 | 1.017 | 1.075 | 1.14 | 1.21 | 1.285 |
| 4.149999999999959 | 0.871 | 0.878 | 0.896 | 0.926 | 0.944 | 0.967 | 1.017 | 1.075 | 1.14 | 1.21 | 1.285 |
| 4.15249999999996 | 0.871 | 0.878 | 0.896 | 0.926 | 0.944 | 0.967 | 1.017 | 1.075 | 1.14 | 1.21 | 1.285 |
| 4.15499999999996 | 0.871 | 0.878 | 0.896 | 0.926 | 0.944 | 0.967 | 1.017 | 1.075 | 1.139 | 1.21 | 1.285 |
| 4.157499999999961 | 0.871 | 0.878 | 0.896 | 0.926 | 0.944 | 0.967 | 1.017 | 1.075 | 1.139 | 1.209 | 1.284 |
| 4.159999999999961 | 0.872 | 0.878 | 0.896 | 0.926 | 0.944 | 0.967 | 1.017 | 1.075 | 1.139 | 1.209 | 1.284 |
| 4.162499999999961 | 0.872 | 0.878 | 0.896 | 0.927 | 0.944 | 0.967 | 1.017 | 1.074 | 1.139 | 1.209 | 1.284 |
| 4.164999999999962 | 0.872 | 0.878 | 0.896 | 0.927 | 0.944 | 0.967 | 1.017 | 1.074 | 1.139 | 1.209 | 1.283 |
| 4.167499999999962 | 0.872 | 0.878 | 0.897 | 0.927 | 0.944 | 0.967 | 1.017 | 1.074 | 1.138 | 1.208 | 1.283 |
| 4.169999999999963 | 0.872 | 0.878 | 0.897 | 0.927 | 0.944 | 0.967 | 1.017 | 1.074 | 1.138 | 1.208 | 1.283 |
| 4.172499999999963 | 0.872 | 0.878 | 0.897 | 0.927 | 0.944 | 0.967 | 1.017 | 1.074 | 1.138 | 1.208 | 1.282 |
| 4.174999999999963 | 0.872 | 0.878 | 0.897 | 0.927 | 0.944 | 0.967 | 1.016 | 1.074 | 1.138 | 1.208 | 1.282 |
| 4.177499999999964 | 0.872 | 0.878 | 0.897 | 0.927 | 0.944 | 0.967 | 1.016 | 1.074 | 1.138 | 1.207 | 1.282 |
| 4.179999999999964 | 0.872 | 0.878 | 0.897 | 0.927 | 0.944 | 0.967 | 1.016 | 1.074 | 1.138 | 1.207 | 1.282 |
| 4.182499999999964 | 0.872 | 0.879 | 0.897 | 0.927 | 0.944 | 0.967 | 1.016 | 1.073 | 1.137 | 1.207 | 1.281 |
| 4.184999999999965 | 0.872 | 0.879 | 0.897 | 0.927 | 0.944 | 0.967 | 1.016 | 1.073 | 1.137 | 1.207 | 1.281 |
| 4.187499999999965 | 0.872 | 0.879 | 0.897 | 0.927 | 0.944 | 0.967 | 1.016 | 1.073 | 1.137 | 1.207 | 1.281 |
| 4.189999999999965 | 0.873 | 0.879 | 0.897 | 0.927 | 0.944 | 0.967 | 1.016 | 1.073 | 1.137 | 1.206 | 1.28 |
| 4.192499999999966 | 0.873 | 0.879 | 0.897 | 0.927 | 0.944 | 0.967 | 1.016 | 1.073 | 1.137 | 1.206 | 1.28 |
| 4.194999999999967 | 0.873 | 0.879 | 0.897 | 0.927 | 0.944 | 0.967 | 1.016 | 1.073 | 1.137 | 1.206 | 1.28 |
| 4.197499999999967 | 0.873 | 0.879 | 0.897 | 0.927 | 0.944 | 0.967 | 1.016 | 1.073 | 1.136 | 1.206 | 1.28 |
| 4.199999999999967 | 0.873 | 0.879 | 0.897 | 0.927 | 0.944 | 0.967 | 1.016 | 1.073 | 1.136 | 1.205 | 1.279 |
| 4.202499999999967 | 0.873 | 0.879 | 0.897 | 0.927 | 0.944 | 0.967 | 1.016 | 1.073 | 1.136 | 1.205 | 1.279 |
| 4.204999999999968 | 0.873 | 0.879 | 0.897 | 0.927 | 0.944 | 0.967 | 1.016 | 1.072 | 1.136 | 1.205 | 1.279 |
| 4.207499999999968 | 0.873 | 0.879 | 0.897 | 0.927 | 0.944 | 0.967 | 1.016 | 1.072 | 1.136 | 1.205 | 1.278 |
| 4.209999999999968 | 0.873 | 0.879 | 0.897 | 0.927 | 0.944 | 0.967 | 1.016 | 1.072 | 1.136 | 1.204 | 1.278 |
| 4.21249999999997 | 0.873 | 0.879 | 0.898 | 0.927 | 0.944 | 0.967 | 1.015 | 1.072 | 1.135 | 1.204 | 1.278 |
| 4.21499999999997 | 0.873 | 0.879 | 0.898 | 0.927 | 0.944 | 0.967 | 1.015 | 1.072 | 1.135 | 1.204 | 1.278 |
| 4.21749999999997 | 0.873 | 0.88 | 0.898 | 0.927 | 0.944 | 0.967 | 1.015 | 1.072 | 1.135 | 1.204 | 1.277 |
| 4.21999999999997 | 0.874 | 0.88 | 0.898 | 0.927 | 0.944 | 0.967 | 1.015 | 1.072 | 1.135 | 1.204 | 1.277 |
| 4.222499999999971 | 0.874 | 0.88 | 0.898 | 0.927 | 0.944 | 0.967 | 1.015 | 1.072 | 1.135 | 1.203 | 1.277 |
| 4.224999999999971 | 0.874 | 0.88 | 0.898 | 0.927 | 0.944 | 0.967 | 1.015 | 1.072 | 1.135 | 1.203 | 1.276 |
| 4.227499999999972 | 0.874 | 0.88 | 0.898 | 0.927 | 0.944 | 0.967 | 1.015 | 1.071 | 1.134 | 1.203 | 1.276 |
| 4.229999999999972 | 0.874 | 0.88 | 0.898 | 0.927 | 0.944 | 0.967 | 1.015 | 1.071 | 1.134 | 1.203 | 1.276 |
| 4.232499999999972 | 0.874 | 0.88 | 0.898 | 0.927 | 0.944 | 0.967 | 1.015 | 1.071 | 1.134 | 1.202 | 1.276 |
| 4.234999999999973 | 0.874 | 0.88 | 0.898 | 0.927 | 0.944 | 0.967 | 1.015 | 1.071 | 1.134 | 1.202 | 1.275 |
| 4.237499999999973 | 0.874 | 0.88 | 0.898 | 0.927 | 0.944 | 0.967 | 1.015 | 1.071 | 1.134 | 1.202 | 1.275 |
| 4.239999999999973 | 0.874 | 0.88 | 0.898 | 0.927 | 0.944 | 0.967 | 1.015 | 1.071 | 1.134 | 1.202 | 1.275 |
| 4.242499999999974 | 0.874 | 0.88 | 0.898 | 0.927 | 0.944 | 0.967 | 1.015 | 1.071 | 1.133 | 1.202 | 1.274 |
| 4.244999999999974 | 0.874 | 0.88 | 0.898 | 0.927 | 0.944 | 0.966 | 1.015 | 1.071 | 1.133 | 1.201 | 1.274 |
| 4.247499999999974 | 0.874 | 0.88 | 0.898 | 0.927 | 0.944 | 0.966 | 1.015 | 1.071 | 1.133 | 1.201 | 1.274 |
| 4.249999999999975 | 0.874 | 0.881 | 0.898 | 0.927 | 0.944 | 0.966 | 1.015 | 1.07 | 1.133 | 1.201 | 1.274 |
| 4.252499999999975 | 0.875 | 0.881 | 0.898 | 0.927 | 0.944 | 0.966 | 1.014 | 1.07 | 1.133 | 1.201 | 1.273 |
| 4.254999999999976 | 0.875 | 0.881 | 0.898 | 0.927 | 0.944 | 0.966 | 1.014 | 1.07 | 1.133 | 1.2 | 1.273 |
| 4.257499999999976 | 0.875 | 0.881 | 0.899 | 0.927 | 0.944 | 0.966 | 1.014 | 1.07 | 1.132 | 1.2 | 1.273 |
| 4.259999999999976 | 0.875 | 0.881 | 0.899 | 0.927 | 0.944 | 0.966 | 1.014 | 1.07 | 1.132 | 1.2 | 1.272 |
| 4.262499999999977 | 0.875 | 0.881 | 0.899 | 0.927 | 0.944 | 0.966 | 1.014 | 1.07 | 1.132 | 1.2 | 1.272 |
| 4.264999999999977 | 0.875 | 0.881 | 0.899 | 0.927 | 0.944 | 0.966 | 1.014 | 1.07 | 1.132 | 1.2 | 1.272 |
| 4.267499999999978 | 0.875 | 0.881 | 0.899 | 0.928 | 0.944 | 0.966 | 1.014 | 1.07 | 1.132 | 1.199 | 1.272 |
| 4.269999999999978 | 0.875 | 0.881 | 0.899 | 0.928 | 0.944 | 0.966 | 1.014 | 1.069 | 1.132 | 1.199 | 1.271 |
| 4.272499999999978 | 0.875 | 0.881 | 0.899 | 0.928 | 0.944 | 0.966 | 1.014 | 1.069 | 1.131 | 1.199 | 1.271 |
| 4.27499999999998 | 0.875 | 0.881 | 0.899 | 0.928 | 0.944 | 0.966 | 1.014 | 1.069 | 1.131 | 1.199 | 1.271 |
| 4.27749999999998 | 0.875 | 0.881 | 0.899 | 0.928 | 0.944 | 0.966 | 1.014 | 1.069 | 1.131 | 1.198 | 1.271 |
| 4.27999999999998 | 0.875 | 0.881 | 0.899 | 0.928 | 0.944 | 0.966 | 1.014 | 1.069 | 1.131 | 1.198 | 1.27 |
| 4.28249999999998 | 0.875 | 0.881 | 0.899 | 0.928 | 0.944 | 0.966 | 1.014 | 1.069 | 1.131 | 1.198 | 1.27 |
| 4.284999999999981 | 0.876 | 0.882 | 0.899 | 0.928 | 0.944 | 0.966 | 1.014 | 1.069 | 1.131 | 1.198 | 1.27 |
| 4.287499999999981 | 0.876 | 0.882 | 0.899 | 0.928 | 0.944 | 0.966 | 1.014 | 1.069 | 1.13 | 1.198 | 1.269 |
| 4.289999999999981 | 0.876 | 0.882 | 0.899 | 0.928 | 0.944 | 0.966 | 1.014 | 1.069 | 1.13 | 1.197 | 1.269 |
| 4.292499999999982 | 0.876 | 0.882 | 0.899 | 0.928 | 0.944 | 0.966 | 1.014 | 1.069 | 1.13 | 1.197 | 1.269 |
| 4.294999999999982 | 0.876 | 0.882 | 0.899 | 0.928 | 0.944 | 0.966 | 1.013 | 1.068 | 1.13 | 1.197 | 1.269 |
| 4.297499999999983 | 0.876 | 0.882 | 0.899 | 0.928 | 0.944 | 0.966 | 1.013 | 1.068 | 1.13 | 1.197 | 1.268 |
| 4.299999999999983 | 0.876 | 0.882 | 0.899 | 0.928 | 0.944 | 0.966 | 1.013 | 1.068 | 1.13 | 1.196 | 1.268 |
| 4.302499999999983 | 0.876 | 0.882 | 0.899 | 0.928 | 0.944 | 0.966 | 1.013 | 1.068 | 1.129 | 1.196 | 1.268 |
| 4.304999999999984 | 0.876 | 0.882 | 0.9 | 0.928 | 0.944 | 0.966 | 1.013 | 1.068 | 1.129 | 1.196 | 1.267 |
| 4.307499999999984 | 0.876 | 0.882 | 0.9 | 0.928 | 0.944 | 0.966 | 1.013 | 1.068 | 1.129 | 1.196 | 1.267 |
| 4.309999999999984 | 0.876 | 0.882 | 0.9 | 0.928 | 0.944 | 0.966 | 1.013 | 1.068 | 1.129 | 1.196 | 1.267 |
| 4.312499999999985 | 0.876 | 0.882 | 0.9 | 0.928 | 0.944 | 0.966 | 1.013 | 1.068 | 1.129 | 1.195 | 1.267 |
| 4.314999999999985 | 0.876 | 0.882 | 0.9 | 0.928 | 0.944 | 0.966 | 1.013 | 1.068 | 1.129 | 1.195 | 1.266 |
| 4.317499999999986 | 0.877 | 0.882 | 0.9 | 0.928 | 0.944 | 0.966 | 1.013 | 1.067 | 1.128 | 1.195 | 1.266 |
| 4.319999999999986 | 0.877 | 0.883 | 0.9 | 0.928 | 0.944 | 0.966 | 1.013 | 1.067 | 1.128 | 1.195 | 1.266 |
| 4.322499999999986 | 0.877 | 0.883 | 0.9 | 0.928 | 0.944 | 0.966 | 1.013 | 1.067 | 1.128 | 1.195 | 1.266 |
| 4.324999999999987 | 0.877 | 0.883 | 0.9 | 0.928 | 0.945 | 0.966 | 1.013 | 1.067 | 1.128 | 1.194 | 1.265 |
| 4.327499999999987 | 0.877 | 0.883 | 0.9 | 0.928 | 0.945 | 0.966 | 1.013 | 1.067 | 1.128 | 1.194 | 1.265 |
| 4.329999999999988 | 0.877 | 0.883 | 0.9 | 0.928 | 0.945 | 0.966 | 1.013 | 1.067 | 1.128 | 1.194 | 1.265 |
| 4.332499999999988 | 0.877 | 0.883 | 0.9 | 0.928 | 0.945 | 0.966 | 1.013 | 1.067 | 1.127 | 1.194 | 1.265 |
| 4.334999999999988 | 0.877 | 0.883 | 0.9 | 0.928 | 0.945 | 0.966 | 1.013 | 1.067 | 1.127 | 1.193 | 1.264 |
| 4.337499999999989 | 0.877 | 0.883 | 0.9 | 0.928 | 0.945 | 0.966 | 1.012 | 1.067 | 1.127 | 1.193 | 1.264 |
| 4.33999999999999 | 0.877 | 0.883 | 0.9 | 0.928 | 0.945 | 0.966 | 1.012 | 1.066 | 1.127 | 1.193 | 1.264 |
| 4.34249999999999 | 0.877 | 0.883 | 0.9 | 0.928 | 0.945 | 0.966 | 1.012 | 1.066 | 1.127 | 1.193 | 1.263 |
| 4.34499999999999 | 0.877 | 0.883 | 0.9 | 0.928 | 0.945 | 0.966 | 1.012 | 1.066 | 1.127 | 1.193 | 1.263 |
| 4.34749999999999 | 0.877 | 0.883 | 0.9 | 0.928 | 0.945 | 0.966 | 1.012 | 1.066 | 1.127 | 1.192 | 1.263 |
| 4.349999999999991 | 0.878 | 0.883 | 0.9 | 0.928 | 0.945 | 0.966 | 1.012 | 1.066 | 1.126 | 1.192 | 1.263 |
| 4.352499999999991 | 0.878 | 0.883 | 0.901 | 0.928 | 0.945 | 0.966 | 1.012 | 1.066 | 1.126 | 1.192 | 1.262 |
| 4.354999999999991 | 0.878 | 0.883 | 0.901 | 0.928 | 0.945 | 0.966 | 1.012 | 1.066 | 1.126 | 1.192 | 1.262 |
| 4.357499999999992 | 0.878 | 0.884 | 0.901 | 0.928 | 0.945 | 0.966 | 1.012 | 1.066 | 1.126 | 1.192 | 1.262 |
| 4.359999999999992 | 0.878 | 0.884 | 0.901 | 0.928 | 0.945 | 0.966 | 1.012 | 1.066 | 1.126 | 1.191 | 1.262 |
| 4.362499999999993 | 0.878 | 0.884 | 0.901 | 0.928 | 0.945 | 0.966 | 1.012 | 1.065 | 1.126 | 1.191 | 1.261 |
| 4.364999999999993 | 0.878 | 0.884 | 0.901 | 0.928 | 0.945 | 0.966 | 1.012 | 1.065 | 1.125 | 1.191 | 1.261 |
| 4.367499999999993 | 0.878 | 0.884 | 0.901 | 0.928 | 0.945 | 0.966 | 1.012 | 1.065 | 1.125 | 1.191 | 1.261 |
| 4.369999999999994 | 0.878 | 0.884 | 0.901 | 0.928 | 0.945 | 0.966 | 1.012 | 1.065 | 1.125 | 1.19 | 1.261 |
| 4.372499999999994 | 0.878 | 0.884 | 0.901 | 0.928 | 0.945 | 0.966 | 1.012 | 1.065 | 1.125 | 1.19 | 1.26 |
| 4.374999999999995 | 0.878 | 0.884 | 0.901 | 0.928 | 0.945 | 0.966 | 1.012 | 1.065 | 1.125 | 1.19 | 1.26 |
| 4.377499999999995 | 0.878 | 0.884 | 0.901 | 0.929 | 0.945 | 0.966 | 1.012 | 1.065 | 1.125 | 1.19 | 1.26 |
| 4.379999999999995 | 0.878 | 0.884 | 0.901 | 0.929 | 0.945 | 0.966 | 1.011 | 1.065 | 1.124 | 1.19 | 1.259 |
| 4.382499999999996 | 0.879 | 0.884 | 0.901 | 0.929 | 0.945 | 0.966 | 1.011 | 1.065 | 1.124 | 1.189 | 1.259 |
| 4.384999999999996 | 0.879 | 0.884 | 0.901 | 0.929 | 0.945 | 0.966 | 1.011 | 1.065 | 1.124 | 1.189 | 1.259 |
| 4.387499999999997 | 0.879 | 0.884 | 0.901 | 0.929 | 0.945 | 0.966 | 1.011 | 1.064 | 1.124 | 1.189 | 1.259 |
| 4.389999999999997 | 0.879 | 0.884 | 0.901 | 0.929 | 0.945 | 0.966 | 1.011 | 1.064 | 1.124 | 1.189 | 1.258 |
| 4.392499999999997 | 0.879 | 0.885 | 0.901 | 0.929 | 0.945 | 0.966 | 1.011 | 1.064 | 1.124 | 1.189 | 1.258 |
| 4.394999999999998 | 0.879 | 0.885 | 0.901 | 0.929 | 0.945 | 0.966 | 1.011 | 1.064 | 1.124 | 1.188 | 1.258 |
| 4.397499999999998 | 0.879 | 0.885 | 0.901 | 0.929 | 0.945 | 0.966 | 1.011 | 1.064 | 1.123 | 1.188 | 1.258 |
| 4.399999999999999 | 0.879 | 0.885 | 0.901 | 0.929 | 0.945 | 0.966 | 1.011 | 1.064 | 1.123 | 1.188 | 1.257 |
| 4.402499999999999 | 0.879 | 0.885 | 0.902 | 0.929 | 0.945 | 0.966 | 1.011 | 1.064 | 1.123 | 1.188 | 1.257 |
| 4.404999999999999 | 0.879 | 0.885 | 0.902 | 0.929 | 0.945 | 0.966 | 1.011 | 1.064 | 1.123 | 1.188 | 1.257 |
| 4.4075 | 0.879 | 0.885 | 0.902 | 0.929 | 0.945 | 0.966 | 1.011 | 1.064 | 1.123 | 1.187 | 1.257 |
| 4.41 | 0.879 | 0.885 | 0.902 | 0.929 | 0.945 | 0.966 | 1.011 | 1.064 | 1.123 | 1.187 | 1.256 |
| 4.412500000000001 | 0.879 | 0.885 | 0.902 | 0.929 | 0.945 | 0.966 | 1.011 | 1.063 | 1.122 | 1.187 | 1.256 |
| 4.415000000000001 | 0.879 | 0.885 | 0.902 | 0.929 | 0.945 | 0.966 | 1.011 | 1.063 | 1.122 | 1.187 | 1.256 |
| 4.417500000000001 | 0.88 | 0.885 | 0.902 | 0.929 | 0.945 | 0.966 | 1.011 | 1.063 | 1.122 | 1.187 | 1.256 |
| 4.420000000000002 | 0.88 | 0.885 | 0.902 | 0.929 | 0.945 | 0.965 | 1.011 | 1.063 | 1.122 | 1.186 | 1.255 |
| 4.422500000000002 | 0.88 | 0.885 | 0.902 | 0.929 | 0.945 | 0.965 | 1.011 | 1.063 | 1.122 | 1.186 | 1.255 |
| 4.425000000000002 | 0.88 | 0.885 | 0.902 | 0.929 | 0.945 | 0.965 | 1.01 | 1.063 | 1.122 | 1.186 | 1.255 |
| 4.427500000000003 | 0.88 | 0.885 | 0.902 | 0.929 | 0.945 | 0.965 | 1.01 | 1.063 | 1.122 | 1.186 | 1.255 |
| 4.430000000000003 | 0.88 | 0.886 | 0.902 | 0.929 | 0.945 | 0.965 | 1.01 | 1.063 | 1.121 | 1.186 | 1.254 |
| 4.432500000000004 | 0.88 | 0.886 | 0.902 | 0.929 | 0.945 | 0.965 | 1.01 | 1.063 | 1.121 | 1.185 | 1.254 |
| 4.435000000000004 | 0.88 | 0.886 | 0.902 | 0.929 | 0.945 | 0.965 | 1.01 | 1.063 | 1.121 | 1.185 | 1.254 |
| 4.437500000000004 | 0.88 | 0.886 | 0.902 | 0.929 | 0.945 | 0.965 | 1.01 | 1.062 | 1.121 | 1.185 | 1.254 |
| 4.440000000000004 | 0.88 | 0.886 | 0.902 | 0.929 | 0.945 | 0.965 | 1.01 | 1.062 | 1.121 | 1.185 | 1.253 |
| 4.442500000000005 | 0.88 | 0.886 | 0.902 | 0.929 | 0.945 | 0.965 | 1.01 | 1.062 | 1.121 | 1.185 | 1.253 |
| 4.445000000000005 | 0.88 | 0.886 | 0.902 | 0.929 | 0.945 | 0.965 | 1.01 | 1.062 | 1.121 | 1.184 | 1.253 |
| 4.447500000000006 | 0.88 | 0.886 | 0.902 | 0.929 | 0.945 | 0.965 | 1.01 | 1.062 | 1.12 | 1.184 | 1.252 |
| 4.450000000000006 | 0.881 | 0.886 | 0.902 | 0.929 | 0.945 | 0.965 | 1.01 | 1.062 | 1.12 | 1.184 | 1.252 |
| 4.452500000000007 | 0.881 | 0.886 | 0.903 | 0.929 | 0.945 | 0.965 | 1.01 | 1.062 | 1.12 | 1.184 | 1.252 |
| 4.455000000000007 | 0.881 | 0.886 | 0.903 | 0.929 | 0.945 | 0.965 | 1.01 | 1.062 | 1.12 | 1.184 | 1.252 |
| 4.457500000000008 | 0.881 | 0.886 | 0.903 | 0.929 | 0.945 | 0.965 | 1.01 | 1.062 | 1.12 | 1.183 | 1.251 |
| 4.460000000000008 | 0.881 | 0.886 | 0.903 | 0.929 | 0.945 | 0.965 | 1.01 | 1.062 | 1.12 | 1.183 | 1.251 |
| 4.462500000000008 | 0.881 | 0.886 | 0.903 | 0.929 | 0.945 | 0.965 | 1.01 | 1.061 | 1.119 | 1.183 | 1.251 |
| 4.465000000000009 | 0.881 | 0.886 | 0.903 | 0.929 | 0.945 | 0.965 | 1.01 | 1.061 | 1.119 | 1.183 | 1.251 |
| 4.467500000000009 | 0.881 | 0.887 | 0.903 | 0.929 | 0.945 | 0.965 | 1.01 | 1.061 | 1.119 | 1.183 | 1.25 |
| 4.47000000000001 | 0.881 | 0.887 | 0.903 | 0.929 | 0.945 | 0.965 | 1.01 | 1.061 | 1.119 | 1.182 | 1.25 |
| 4.47250000000001 | 0.881 | 0.887 | 0.903 | 0.929 | 0.945 | 0.965 | 1.009 | 1.061 | 1.119 | 1.182 | 1.25 |
| 4.47500000000001 | 0.881 | 0.887 | 0.903 | 0.929 | 0.945 | 0.965 | 1.009 | 1.061 | 1.119 | 1.182 | 1.25 |
| 4.477500000000011 | 0.881 | 0.887 | 0.903 | 0.929 | 0.945 | 0.965 | 1.009 | 1.061 | 1.119 | 1.182 | 1.249 |
| 4.480000000000011 | 0.881 | 0.887 | 0.903 | 0.929 | 0.945 | 0.965 | 1.009 | 1.061 | 1.118 | 1.182 | 1.249 |
| 4.482500000000011 | 0.881 | 0.887 | 0.903 | 0.929 | 0.945 | 0.965 | 1.009 | 1.061 | 1.118 | 1.181 | 1.249 |
| 4.485000000000012 | 0.881 | 0.887 | 0.903 | 0.929 | 0.945 | 0.965 | 1.009 | 1.061 | 1.118 | 1.181 | 1.249 |
| 4.487500000000012 | 0.882 | 0.887 | 0.903 | 0.93 | 0.945 | 0.965 | 1.009 | 1.06 | 1.118 | 1.181 | 1.248 |
| 4.490000000000013 | 0.882 | 0.887 | 0.903 | 0.93 | 0.945 | 0.965 | 1.009 | 1.06 | 1.118 | 1.181 | 1.248 |
| 4.492500000000013 | 0.882 | 0.887 | 0.903 | 0.93 | 0.945 | 0.965 | 1.009 | 1.06 | 1.118 | 1.181 | 1.248 |
| 4.495000000000013 | 0.882 | 0.887 | 0.903 | 0.93 | 0.945 | 0.965 | 1.009 | 1.06 | 1.118 | 1.18 | 1.248 |
| 4.497500000000014 | 0.882 | 0.887 | 0.903 | 0.93 | 0.945 | 0.965 | 1.009 | 1.06 | 1.117 | 1.18 | 1.247 |
| 4.500000000000014 | 0.882 | 0.887 | 0.903 | 0.93 | 0.945 | 0.965 | 1.009 | 1.06 | 1.117 | 1.18 | 1.247 |
| 4.502500000000015 | 0.882 | 0.887 | 0.903 | 0.93 | 0.945 | 0.965 | 1.009 | 1.06 | 1.117 | 1.18 | 1.247 |
| 4.505000000000015 | 0.882 | 0.887 | 0.904 | 0.93 | 0.945 | 0.965 | 1.009 | 1.06 | 1.117 | 1.18 | 1.247 |
| 4.507500000000015 | 0.882 | 0.888 | 0.904 | 0.93 | 0.945 | 0.965 | 1.009 | 1.06 | 1.117 | 1.179 | 1.246 |
| 4.510000000000016 | 0.882 | 0.888 | 0.904 | 0.93 | 0.945 | 0.965 | 1.009 | 1.06 | 1.117 | 1.179 | 1.246 |
| 4.512500000000016 | 0.882 | 0.888 | 0.904 | 0.93 | 0.945 | 0.965 | 1.009 | 1.059 | 1.117 | 1.179 | 1.246 |
| 4.515000000000017 | 0.882 | 0.888 | 0.904 | 0.93 | 0.945 | 0.965 | 1.009 | 1.059 | 1.116 | 1.179 | 1.246 |
| 4.517500000000017 | 0.882 | 0.888 | 0.904 | 0.93 | 0.945 | 0.965 | 1.009 | 1.059 | 1.116 | 1.179 | 1.245 |
| 4.520000000000017 | 0.882 | 0.888 | 0.904 | 0.93 | 0.945 | 0.965 | 1.008 | 1.059 | 1.116 | 1.178 | 1.245 |
| 4.522500000000018 | 0.883 | 0.888 | 0.904 | 0.93 | 0.945 | 0.965 | 1.008 | 1.059 | 1.116 | 1.178 | 1.245 |
| 4.525000000000018 | 0.883 | 0.888 | 0.904 | 0.93 | 0.945 | 0.965 | 1.008 | 1.059 | 1.116 | 1.178 | 1.245 |
| 4.527500000000019 | 0.883 | 0.888 | 0.904 | 0.93 | 0.945 | 0.965 | 1.008 | 1.059 | 1.116 | 1.178 | 1.245 |
| 4.530000000000019 | 0.883 | 0.888 | 0.904 | 0.93 | 0.945 | 0.965 | 1.008 | 1.059 | 1.116 | 1.178 | 1.244 |
| 4.532500000000019 | 0.883 | 0.888 | 0.904 | 0.93 | 0.945 | 0.965 | 1.008 | 1.059 | 1.115 | 1.177 | 1.244 |
| 4.53500000000002 | 0.883 | 0.888 | 0.904 | 0.93 | 0.945 | 0.965 | 1.008 | 1.059 | 1.115 | 1.177 | 1.244 |
| 4.53750000000002 | 0.883 | 0.888 | 0.904 | 0.93 | 0.945 | 0.965 | 1.008 | 1.058 | 1.115 | 1.177 | 1.244 |
| 4.54000000000002 | 0.883 | 0.888 | 0.904 | 0.93 | 0.945 | 0.965 | 1.008 | 1.058 | 1.115 | 1.177 | 1.243 |
| 4.542500000000021 | 0.883 | 0.888 | 0.904 | 0.93 | 0.945 | 0.965 | 1.008 | 1.058 | 1.115 | 1.177 | 1.243 |
| 4.545000000000021 | 0.883 | 0.888 | 0.904 | 0.93 | 0.945 | 0.965 | 1.008 | 1.058 | 1.115 | 1.176 | 1.243 |
| 4.547500000000022 | 0.883 | 0.889 | 0.904 | 0.93 | 0.945 | 0.965 | 1.008 | 1.058 | 1.115 | 1.176 | 1.243 |
| 4.550000000000022 | 0.883 | 0.889 | 0.904 | 0.93 | 0.945 | 0.965 | 1.008 | 1.058 | 1.114 | 1.176 | 1.242 |
| 4.552500000000022 | 0.883 | 0.889 | 0.904 | 0.93 | 0.945 | 0.965 | 1.008 | 1.058 | 1.114 | 1.176 | 1.242 |
| 4.555000000000023 | 0.883 | 0.889 | 0.904 | 0.93 | 0.945 | 0.965 | 1.008 | 1.058 | 1.114 | 1.176 | 1.242 |
| 4.557500000000023 | 0.884 | 0.889 | 0.905 | 0.93 | 0.945 | 0.965 | 1.008 | 1.058 | 1.114 | 1.176 | 1.242 |
| 4.560000000000024 | 0.884 | 0.889 | 0.905 | 0.93 | 0.945 | 0.965 | 1.008 | 1.058 | 1.114 | 1.175 | 1.241 |
| 4.562500000000024 | 0.884 | 0.889 | 0.905 | 0.93 | 0.945 | 0.965 | 1.008 | 1.058 | 1.114 | 1.175 | 1.241 |
| 4.565000000000024 | 0.884 | 0.889 | 0.905 | 0.93 | 0.945 | 0.965 | 1.008 | 1.057 | 1.114 | 1.175 | 1.241 |
| 4.567500000000025 | 0.884 | 0.889 | 0.905 | 0.93 | 0.945 | 0.965 | 1.008 | 1.057 | 1.113 | 1.175 | 1.241 |
| 4.570000000000025 | 0.884 | 0.889 | 0.905 | 0.93 | 0.945 | 0.965 | 1.007 | 1.057 | 1.113 | 1.175 | 1.24 |
| 4.572500000000025 | 0.884 | 0.889 | 0.905 | 0.93 | 0.945 | 0.965 | 1.007 | 1.057 | 1.113 | 1.174 | 1.24 |
| 4.575000000000025 | 0.884 | 0.889 | 0.905 | 0.93 | 0.945 | 0.965 | 1.007 | 1.057 | 1.113 | 1.174 | 1.24 |
| 4.577500000000026 | 0.884 | 0.889 | 0.905 | 0.93 | 0.945 | 0.965 | 1.007 | 1.057 | 1.113 | 1.174 | 1.24 |
| 4.580000000000026 | 0.884 | 0.889 | 0.905 | 0.93 | 0.945 | 0.965 | 1.007 | 1.057 | 1.113 | 1.174 | 1.239 |
| 4.582500000000027 | 0.884 | 0.889 | 0.905 | 0.93 | 0.945 | 0.965 | 1.007 | 1.057 | 1.113 | 1.174 | 1.239 |
| 4.585000000000027 | 0.884 | 0.889 | 0.905 | 0.93 | 0.945 | 0.965 | 1.007 | 1.057 | 1.112 | 1.173 | 1.239 |
| 4.587500000000028 | 0.884 | 0.89 | 0.905 | 0.93 | 0.945 | 0.965 | 1.007 | 1.057 | 1.112 | 1.173 | 1.239 |
| 4.590000000000028 | 0.884 | 0.89 | 0.905 | 0.93 | 0.945 | 0.965 | 1.007 | 1.057 | 1.112 | 1.173 | 1.239 |
| 4.592500000000029 | 0.884 | 0.89 | 0.905 | 0.93 | 0.945 | 0.965 | 1.007 | 1.056 | 1.112 | 1.173 | 1.238 |
| 4.59500000000003 | 0.885 | 0.89 | 0.905 | 0.93 | 0.945 | 0.965 | 1.007 | 1.056 | 1.112 | 1.173 | 1.238 |
| 4.597500000000029 | 0.885 | 0.89 | 0.905 | 0.93 | 0.945 | 0.965 | 1.007 | 1.056 | 1.112 | 1.173 | 1.238 |
| 4.60000000000003 | 0.885 | 0.89 | 0.905 | 0.93 | 0.945 | 0.965 | 1.007 | 1.056 | 1.112 | 1.172 | 1.238 |
| 4.60250000000003 | 0.885 | 0.89 | 0.905 | 0.931 | 0.945 | 0.965 | 1.007 | 1.056 | 1.111 | 1.172 | 1.237 |
| 4.605000000000031 | 0.885 | 0.89 | 0.905 | 0.931 | 0.945 | 0.965 | 1.007 | 1.056 | 1.111 | 1.172 | 1.237 |
| 4.607500000000031 | 0.885 | 0.89 | 0.905 | 0.931 | 0.945 | 0.965 | 1.007 | 1.056 | 1.111 | 1.172 | 1.237 |
| 4.610000000000031 | 0.885 | 0.89 | 0.905 | 0.931 | 0.945 | 0.965 | 1.007 | 1.056 | 1.111 | 1.172 | 1.237 |
| 4.612500000000032 | 0.885 | 0.89 | 0.906 | 0.931 | 0.945 | 0.965 | 1.007 | 1.056 | 1.111 | 1.171 | 1.236 |
| 4.615000000000032 | 0.885 | 0.89 | 0.906 | 0.931 | 0.945 | 0.965 | 1.007 | 1.056 | 1.111 | 1.171 | 1.236 |
| 4.617500000000032 | 0.885 | 0.89 | 0.906 | 0.931 | 0.945 | 0.965 | 1.007 | 1.056 | 1.111 | 1.171 | 1.236 |
| 4.620000000000033 | 0.885 | 0.89 | 0.906 | 0.931 | 0.945 | 0.965 | 1.006 | 1.055 | 1.111 | 1.171 | 1.236 |
| 4.622500000000033 | 0.885 | 0.89 | 0.906 | 0.931 | 0.945 | 0.965 | 1.006 | 1.055 | 1.11 | 1.171 | 1.235 |
| 4.625000000000034 | 0.885 | 0.89 | 0.906 | 0.931 | 0.945 | 0.965 | 1.006 | 1.055 | 1.11 | 1.17 | 1.235 |
| 4.627500000000034 | 0.885 | 0.891 | 0.906 | 0.931 | 0.945 | 0.965 | 1.006 | 1.055 | 1.11 | 1.17 | 1.235 |
| 4.630000000000034 | 0.885 | 0.891 | 0.906 | 0.931 | 0.945 | 0.965 | 1.006 | 1.055 | 1.11 | 1.17 | 1.235 |
| 4.632500000000035 | 0.886 | 0.891 | 0.906 | 0.931 | 0.945 | 0.965 | 1.006 | 1.055 | 1.11 | 1.17 | 1.235 |
| 4.635000000000035 | 0.886 | 0.891 | 0.906 | 0.931 | 0.945 | 0.965 | 1.006 | 1.055 | 1.11 | 1.17 | 1.234 |
| 4.637500000000036 | 0.886 | 0.891 | 0.906 | 0.931 | 0.945 | 0.964 | 1.006 | 1.055 | 1.11 | 1.17 | 1.234 |
| 4.640000000000036 | 0.886 | 0.891 | 0.906 | 0.931 | 0.945 | 0.964 | 1.006 | 1.055 | 1.109 | 1.169 | 1.234 |
| 4.642500000000036 | 0.886 | 0.891 | 0.906 | 0.931 | 0.945 | 0.964 | 1.006 | 1.055 | 1.109 | 1.169 | 1.234 |
| 4.645000000000037 | 0.886 | 0.891 | 0.906 | 0.931 | 0.945 | 0.964 | 1.006 | 1.055 | 1.109 | 1.169 | 1.233 |
| 4.647500000000037 | 0.886 | 0.891 | 0.906 | 0.931 | 0.945 | 0.964 | 1.006 | 1.054 | 1.109 | 1.169 | 1.233 |
| 4.650000000000038 | 0.886 | 0.891 | 0.906 | 0.931 | 0.945 | 0.964 | 1.006 | 1.054 | 1.109 | 1.169 | 1.233 |
| 4.652500000000038 | 0.886 | 0.891 | 0.906 | 0.931 | 0.945 | 0.964 | 1.006 | 1.054 | 1.109 | 1.168 | 1.233 |
| 4.655000000000038 | 0.886 | 0.891 | 0.906 | 0.931 | 0.945 | 0.964 | 1.006 | 1.054 | 1.109 | 1.168 | 1.232 |
| 4.657500000000039 | 0.886 | 0.891 | 0.906 | 0.931 | 0.945 | 0.964 | 1.006 | 1.054 | 1.108 | 1.168 | 1.232 |
| 4.660000000000039 | 0.886 | 0.891 | 0.906 | 0.931 | 0.945 | 0.964 | 1.006 | 1.054 | 1.108 | 1.168 | 1.232 |
| 4.66250000000004 | 0.886 | 0.891 | 0.906 | 0.931 | 0.945 | 0.964 | 1.006 | 1.054 | 1.108 | 1.168 | 1.232 |
| 4.66500000000004 | 0.886 | 0.891 | 0.906 | 0.931 | 0.945 | 0.964 | 1.006 | 1.054 | 1.108 | 1.168 | 1.232 |
| 4.66750000000004 | 0.886 | 0.891 | 0.907 | 0.931 | 0.945 | 0.964 | 1.006 | 1.054 | 1.108 | 1.167 | 1.231 |
| 4.670000000000041 | 0.886 | 0.892 | 0.907 | 0.931 | 0.945 | 0.964 | 1.006 | 1.054 | 1.108 | 1.167 | 1.231 |
| 4.672500000000041 | 0.887 | 0.892 | 0.907 | 0.931 | 0.946 | 0.964 | 1.005 | 1.054 | 1.108 | 1.167 | 1.231 |
| 4.675000000000041 | 0.887 | 0.892 | 0.907 | 0.931 | 0.946 | 0.964 | 1.005 | 1.053 | 1.108 | 1.167 | 1.231 |
| 4.677500000000042 | 0.887 | 0.892 | 0.907 | 0.931 | 0.946 | 0.964 | 1.005 | 1.053 | 1.107 | 1.167 | 1.23 |
| 4.680000000000042 | 0.887 | 0.892 | 0.907 | 0.931 | 0.946 | 0.964 | 1.005 | 1.053 | 1.107 | 1.167 | 1.23 |
| 4.682500000000043 | 0.887 | 0.892 | 0.907 | 0.931 | 0.946 | 0.964 | 1.005 | 1.053 | 1.107 | 1.166 | 1.23 |
| 4.685000000000043 | 0.887 | 0.892 | 0.907 | 0.931 | 0.946 | 0.964 | 1.005 | 1.053 | 1.107 | 1.166 | 1.23 |
| 4.687500000000043 | 0.887 | 0.892 | 0.907 | 0.931 | 0.946 | 0.964 | 1.005 | 1.053 | 1.107 | 1.166 | 1.229 |
| 4.690000000000044 | 0.887 | 0.892 | 0.907 | 0.931 | 0.946 | 0.964 | 1.005 | 1.053 | 1.107 | 1.166 | 1.229 |
| 4.692500000000044 | 0.887 | 0.892 | 0.907 | 0.931 | 0.946 | 0.964 | 1.005 | 1.053 | 1.107 | 1.166 | 1.229 |
| 4.695000000000045 | 0.887 | 0.892 | 0.907 | 0.931 | 0.946 | 0.964 | 1.005 | 1.053 | 1.107 | 1.165 | 1.229 |
| 4.697500000000045 | 0.887 | 0.892 | 0.907 | 0.931 | 0.946 | 0.964 | 1.005 | 1.053 | 1.106 | 1.165 | 1.229 |
| 4.700000000000045 | 0.887 | 0.892 | 0.907 | 0.931 | 0.946 | 0.964 | 1.005 | 1.053 | 1.106 | 1.165 | 1.228 |
| 4.702500000000046 | 0.887 | 0.892 | 0.907 | 0.931 | 0.946 | 0.964 | 1.005 | 1.053 | 1.106 | 1.165 | 1.228 |
| 4.705000000000046 | 0.887 | 0.892 | 0.907 | 0.931 | 0.946 | 0.964 | 1.005 | 1.052 | 1.106 | 1.165 | 1.228 |
| 4.707500000000047 | 0.887 | 0.892 | 0.907 | 0.931 | 0.946 | 0.964 | 1.005 | 1.052 | 1.106 | 1.165 | 1.228 |
| 4.710000000000047 | 0.888 | 0.893 | 0.907 | 0.931 | 0.946 | 0.964 | 1.005 | 1.052 | 1.106 | 1.164 | 1.227 |
| 4.712500000000047 | 0.888 | 0.893 | 0.907 | 0.931 | 0.946 | 0.964 | 1.005 | 1.052 | 1.106 | 1.164 | 1.227 |
| 4.715000000000048 | 0.888 | 0.893 | 0.907 | 0.931 | 0.946 | 0.964 | 1.005 | 1.052 | 1.105 | 1.164 | 1.227 |
| 4.717500000000048 | 0.888 | 0.893 | 0.907 | 0.932 | 0.946 | 0.964 | 1.005 | 1.052 | 1.105 | 1.164 | 1.227 |
| 4.720000000000049 | 0.888 | 0.893 | 0.907 | 0.932 | 0.946 | 0.964 | 1.005 | 1.052 | 1.105 | 1.164 | 1.227 |
| 4.722500000000049 | 0.888 | 0.893 | 0.908 | 0.932 | 0.946 | 0.964 | 1.005 | 1.052 | 1.105 | 1.164 | 1.226 |
| 4.725000000000049 | 0.888 | 0.893 | 0.908 | 0.932 | 0.946 | 0.964 | 1.005 | 1.052 | 1.105 | 1.163 | 1.226 |
| 4.72750000000005 | 0.888 | 0.893 | 0.908 | 0.932 | 0.946 | 0.964 | 1.004 | 1.052 | 1.105 | 1.163 | 1.226 |
| 4.73000000000005 | 0.888 | 0.893 | 0.908 | 0.932 | 0.946 | 0.964 | 1.004 | 1.052 | 1.105 | 1.163 | 1.226 |
| 4.73250000000005 | 0.888 | 0.893 | 0.908 | 0.932 | 0.946 | 0.964 | 1.004 | 1.051 | 1.105 | 1.163 | 1.225 |
| 4.735000000000051 | 0.888 | 0.893 | 0.908 | 0.932 | 0.946 | 0.964 | 1.004 | 1.051 | 1.104 | 1.163 | 1.225 |
| 4.737500000000051 | 0.888 | 0.893 | 0.908 | 0.932 | 0.946 | 0.964 | 1.004 | 1.051 | 1.104 | 1.162 | 1.225 |
| 4.740000000000052 | 0.888 | 0.893 | 0.908 | 0.932 | 0.946 | 0.964 | 1.004 | 1.051 | 1.104 | 1.162 | 1.225 |
| 4.742500000000052 | 0.888 | 0.893 | 0.908 | 0.932 | 0.946 | 0.964 | 1.004 | 1.051 | 1.104 | 1.162 | 1.225 |
| 4.745000000000052 | 0.888 | 0.893 | 0.908 | 0.932 | 0.946 | 0.964 | 1.004 | 1.051 | 1.104 | 1.162 | 1.224 |
| 4.747500000000053 | 0.888 | 0.893 | 0.908 | 0.932 | 0.946 | 0.964 | 1.004 | 1.051 | 1.104 | 1.162 | 1.224 |
| 4.750000000000053 | 0.889 | 0.893 | 0.908 | 0.932 | 0.946 | 0.964 | 1.004 | 1.051 | 1.104 | 1.162 | 1.224 |
| 4.752500000000054 | 0.889 | 0.893 | 0.908 | 0.932 | 0.946 | 0.964 | 1.004 | 1.051 | 1.104 | 1.161 | 1.224 |
| 4.755000000000054 | 0.889 | 0.894 | 0.908 | 0.932 | 0.946 | 0.964 | 1.004 | 1.051 | 1.103 | 1.161 | 1.224 |
| 4.757500000000054 | 0.889 | 0.894 | 0.908 | 0.932 | 0.946 | 0.964 | 1.004 | 1.051 | 1.103 | 1.161 | 1.223 |
| 4.760000000000055 | 0.889 | 0.894 | 0.908 | 0.932 | 0.946 | 0.964 | 1.004 | 1.051 | 1.103 | 1.161 | 1.223 |
| 4.762500000000055 | 0.889 | 0.894 | 0.908 | 0.932 | 0.946 | 0.964 | 1.004 | 1.05 | 1.103 | 1.161 | 1.223 |
| 4.765000000000056 | 0.889 | 0.894 | 0.908 | 0.932 | 0.946 | 0.964 | 1.004 | 1.05 | 1.103 | 1.161 | 1.223 |
| 4.767500000000056 | 0.889 | 0.894 | 0.908 | 0.932 | 0.946 | 0.964 | 1.004 | 1.05 | 1.103 | 1.16 | 1.222 |
| 4.770000000000056 | 0.889 | 0.894 | 0.908 | 0.932 | 0.946 | 0.964 | 1.004 | 1.05 | 1.103 | 1.16 | 1.222 |
| 4.772500000000057 | 0.889 | 0.894 | 0.908 | 0.932 | 0.946 | 0.964 | 1.004 | 1.05 | 1.103 | 1.16 | 1.222 |
| 4.775000000000057 | 0.889 | 0.894 | 0.908 | 0.932 | 0.946 | 0.964 | 1.004 | 1.05 | 1.102 | 1.16 | 1.222 |
| 4.777500000000058 | 0.889 | 0.894 | 0.908 | 0.932 | 0.946 | 0.964 | 1.004 | 1.05 | 1.102 | 1.16 | 1.222 |
| 4.780000000000058 | 0.889 | 0.894 | 0.909 | 0.932 | 0.946 | 0.964 | 1.004 | 1.05 | 1.102 | 1.16 | 1.221 |
| 4.782500000000058 | 0.889 | 0.894 | 0.909 | 0.932 | 0.946 | 0.964 | 1.004 | 1.05 | 1.102 | 1.159 | 1.221 |
| 4.785000000000059 | 0.889 | 0.894 | 0.909 | 0.932 | 0.946 | 0.964 | 1.003 | 1.05 | 1.102 | 1.159 | 1.221 |
| 4.787500000000059 | 0.889 | 0.894 | 0.909 | 0.932 | 0.946 | 0.964 | 1.003 | 1.05 | 1.102 | 1.159 | 1.221 |
| 4.790000000000059 | 0.89 | 0.894 | 0.909 | 0.932 | 0.946 | 0.964 | 1.003 | 1.05 | 1.102 | 1.159 | 1.22 |
| 4.79250000000006 | 0.89 | 0.894 | 0.909 | 0.932 | 0.946 | 0.964 | 1.003 | 1.049 | 1.102 | 1.159 | 1.22 |
| 4.79500000000006 | 0.89 | 0.894 | 0.909 | 0.932 | 0.946 | 0.964 | 1.003 | 1.049 | 1.101 | 1.159 | 1.22 |
| 4.797500000000061 | 0.89 | 0.895 | 0.909 | 0.932 | 0.946 | 0.964 | 1.003 | 1.049 | 1.101 | 1.158 | 1.22 |
| 4.800000000000061 | 0.89 | 0.895 | 0.909 | 0.932 | 0.946 | 0.964 | 1.003 | 1.049 | 1.101 | 1.158 | 1.22 |
| 4.802500000000061 | 0.89 | 0.895 | 0.909 | 0.932 | 0.946 | 0.964 | 1.003 | 1.049 | 1.101 | 1.158 | 1.219 |
| 4.805000000000062 | 0.89 | 0.895 | 0.909 | 0.932 | 0.946 | 0.964 | 1.003 | 1.049 | 1.101 | 1.158 | 1.219 |
| 4.807500000000062 | 0.89 | 0.895 | 0.909 | 0.932 | 0.946 | 0.964 | 1.003 | 1.049 | 1.101 | 1.158 | 1.219 |
| 4.810000000000063 | 0.89 | 0.895 | 0.909 | 0.932 | 0.946 | 0.964 | 1.003 | 1.049 | 1.101 | 1.158 | 1.219 |
| 4.812500000000063 | 0.89 | 0.895 | 0.909 | 0.932 | 0.946 | 0.964 | 1.003 | 1.049 | 1.101 | 1.157 | 1.219 |
| 4.815000000000063 | 0.89 | 0.895 | 0.909 | 0.932 | 0.946 | 0.964 | 1.003 | 1.049 | 1.1 | 1.157 | 1.218 |
| 4.817500000000064 | 0.89 | 0.895 | 0.909 | 0.932 | 0.946 | 0.964 | 1.003 | 1.049 | 1.1 | 1.157 | 1.218 |
| 4.820000000000064 | 0.89 | 0.895 | 0.909 | 0.932 | 0.946 | 0.964 | 1.003 | 1.049 | 1.1 | 1.157 | 1.218 |
| 4.822500000000065 | 0.89 | 0.895 | 0.909 | 0.932 | 0.946 | 0.964 | 1.003 | 1.049 | 1.1 | 1.157 | 1.218 |
| 4.825000000000065 | 0.89 | 0.895 | 0.909 | 0.932 | 0.946 | 0.964 | 1.003 | 1.048 | 1.1 | 1.157 | 1.217 |
| 4.827500000000065 | 0.89 | 0.895 | 0.909 | 0.932 | 0.946 | 0.964 | 1.003 | 1.048 | 1.1 | 1.156 | 1.217 |
| 4.830000000000065 | 0.89 | 0.895 | 0.909 | 0.932 | 0.946 | 0.964 | 1.003 | 1.048 | 1.1 | 1.156 | 1.217 |
| 4.832500000000066 | 0.891 | 0.895 | 0.909 | 0.932 | 0.946 | 0.964 | 1.003 | 1.048 | 1.1 | 1.156 | 1.217 |
| 4.835000000000066 | 0.891 | 0.895 | 0.909 | 0.932 | 0.946 | 0.964 | 1.003 | 1.048 | 1.099 | 1.156 | 1.217 |
| 4.837500000000067 | 0.891 | 0.895 | 0.909 | 0.932 | 0.946 | 0.964 | 1.003 | 1.048 | 1.099 | 1.156 | 1.216 |
| 4.840000000000067 | 0.891 | 0.895 | 0.91 | 0.933 | 0.946 | 0.964 | 1.003 | 1.048 | 1.099 | 1.156 | 1.216 |
| 4.842500000000068 | 0.891 | 0.896 | 0.91 | 0.933 | 0.946 | 0.964 | 1.002 | 1.048 | 1.099 | 1.155 | 1.216 |
| 4.845000000000068 | 0.891 | 0.896 | 0.91 | 0.933 | 0.946 | 0.964 | 1.002 | 1.048 | 1.099 | 1.155 | 1.216 |
| 4.847500000000068 | 0.891 | 0.896 | 0.91 | 0.933 | 0.946 | 0.964 | 1.002 | 1.048 | 1.099 | 1.155 | 1.216 |
| 4.850000000000069 | 0.891 | 0.896 | 0.91 | 0.933 | 0.946 | 0.964 | 1.002 | 1.048 | 1.099 | 1.155 | 1.215 |
| 4.852500000000069 | 0.891 | 0.896 | 0.91 | 0.933 | 0.946 | 0.964 | 1.002 | 1.048 | 1.099 | 1.155 | 1.215 |
| 4.85500000000007 | 0.891 | 0.896 | 0.91 | 0.933 | 0.946 | 0.964 | 1.002 | 1.047 | 1.098 | 1.155 | 1.215 |
| 4.85750000000007 | 0.891 | 0.896 | 0.91 | 0.933 | 0.946 | 0.964 | 1.002 | 1.047 | 1.098 | 1.154 | 1.215 |
| 4.86000000000007 | 0.891 | 0.896 | 0.91 | 0.933 | 0.946 | 0.964 | 1.002 | 1.047 | 1.098 | 1.154 | 1.215 |
| 4.862500000000071 | 0.891 | 0.896 | 0.91 | 0.933 | 0.946 | 0.964 | 1.002 | 1.047 | 1.098 | 1.154 | 1.214 |
| 4.865000000000071 | 0.891 | 0.896 | 0.91 | 0.933 | 0.946 | 0.964 | 1.002 | 1.047 | 1.098 | 1.154 | 1.214 |
| 4.867500000000072 | 0.891 | 0.896 | 0.91 | 0.933 | 0.946 | 0.964 | 1.002 | 1.047 | 1.098 | 1.154 | 1.214 |
| 4.870000000000072 | 0.891 | 0.896 | 0.91 | 0.933 | 0.946 | 0.964 | 1.002 | 1.047 | 1.098 | 1.154 | 1.214 |
| 4.872500000000072 | 0.891 | 0.896 | 0.91 | 0.933 | 0.946 | 0.964 | 1.002 | 1.047 | 1.098 | 1.153 | 1.214 |
| 4.875000000000073 | 0.892 | 0.896 | 0.91 | 0.933 | 0.946 | 0.964 | 1.002 | 1.047 | 1.098 | 1.153 | 1.213 |
| 4.877500000000073 | 0.892 | 0.896 | 0.91 | 0.933 | 0.946 | 0.964 | 1.002 | 1.047 | 1.097 | 1.153 | 1.213 |
| 4.880000000000074 | 0.892 | 0.896 | 0.91 | 0.933 | 0.946 | 0.964 | 1.002 | 1.047 | 1.097 | 1.153 | 1.213 |
| 4.882500000000074 | 0.892 | 0.896 | 0.91 | 0.933 | 0.946 | 0.964 | 1.002 | 1.047 | 1.097 | 1.153 | 1.213 |
| 4.885000000000074 | 0.892 | 0.896 | 0.91 | 0.933 | 0.946 | 0.964 | 1.002 | 1.047 | 1.097 | 1.153 | 1.213 |
| 4.887500000000075 | 0.892 | 0.897 | 0.91 | 0.933 | 0.946 | 0.964 | 1.002 | 1.046 | 1.097 | 1.152 | 1.212 |
| 4.890000000000075 | 0.892 | 0.897 | 0.91 | 0.933 | 0.946 | 0.964 | 1.002 | 1.046 | 1.097 | 1.152 | 1.212 |
| 4.892500000000075 | 0.892 | 0.897 | 0.91 | 0.933 | 0.946 | 0.964 | 1.002 | 1.046 | 1.097 | 1.152 | 1.212 |
| 4.895000000000076 | 0.892 | 0.897 | 0.91 | 0.933 | 0.946 | 0.964 | 1.002 | 1.046 | 1.097 | 1.152 | 1.212 |
| 4.897500000000076 | 0.892 | 0.897 | 0.91 | 0.933 | 0.946 | 0.964 | 1.002 | 1.046 | 1.096 | 1.152 | 1.211 |
| 4.900000000000076 | 0.892 | 0.897 | 0.911 | 0.933 | 0.946 | 0.964 | 1.002 | 1.046 | 1.096 | 1.152 | 1.211 |
| 4.902500000000077 | 0.892 | 0.897 | 0.911 | 0.933 | 0.946 | 0.964 | 1.002 | 1.046 | 1.096 | 1.151 | 1.211 |
| 4.905000000000077 | 0.892 | 0.897 | 0.911 | 0.933 | 0.946 | 0.964 | 1.001 | 1.046 | 1.096 | 1.151 | 1.211 |
| 4.907500000000078 | 0.892 | 0.897 | 0.911 | 0.933 | 0.946 | 0.964 | 1.001 | 1.046 | 1.096 | 1.151 | 1.211 |
| 4.910000000000078 | 0.892 | 0.897 | 0.911 | 0.933 | 0.946 | 0.964 | 1.001 | 1.046 | 1.096 | 1.151 | 1.21 |
| 4.912500000000079 | 0.892 | 0.897 | 0.911 | 0.933 | 0.946 | 0.964 | 1.001 | 1.046 | 1.096 | 1.151 | 1.21 |
| 4.91500000000008 | 0.892 | 0.897 | 0.911 | 0.933 | 0.946 | 0.964 | 1.001 | 1.046 | 1.096 | 1.151 | 1.21 |
| 4.917500000000079 | 0.893 | 0.897 | 0.911 | 0.933 | 0.946 | 0.964 | 1.001 | 1.046 | 1.096 | 1.151 | 1.21 |
| 4.92000000000008 | 0.893 | 0.897 | 0.911 | 0.933 | 0.946 | 0.964 | 1.001 | 1.045 | 1.095 | 1.15 | 1.21 |
| 4.92250000000008 | 0.893 | 0.897 | 0.911 | 0.933 | 0.946 | 0.964 | 1.001 | 1.045 | 1.095 | 1.15 | 1.209 |
| 4.925000000000081 | 0.893 | 0.897 | 0.911 | 0.933 | 0.946 | 0.964 | 1.001 | 1.045 | 1.095 | 1.15 | 1.209 |
| 4.927500000000081 | 0.893 | 0.897 | 0.911 | 0.933 | 0.946 | 0.964 | 1.001 | 1.045 | 1.095 | 1.15 | 1.209 |
| 4.930000000000081 | 0.893 | 0.897 | 0.911 | 0.933 | 0.946 | 0.964 | 1.001 | 1.045 | 1.095 | 1.15 | 1.209 |
| 4.932500000000082 | 0.893 | 0.897 | 0.911 | 0.933 | 0.946 | 0.964 | 1.001 | 1.045 | 1.095 | 1.15 | 1.209 |
| 4.935000000000082 | 0.893 | 0.898 | 0.911 | 0.933 | 0.946 | 0.963 | 1.001 | 1.045 | 1.095 | 1.149 | 1.208 |
| 4.937500000000083 | 0.893 | 0.898 | 0.911 | 0.933 | 0.946 | 0.963 | 1.001 | 1.045 | 1.095 | 1.149 | 1.208 |
| 4.940000000000083 | 0.893 | 0.898 | 0.911 | 0.933 | 0.946 | 0.963 | 1.001 | 1.045 | 1.095 | 1.149 | 1.208 |
| 4.942500000000083 | 0.893 | 0.898 | 0.911 | 0.933 | 0.946 | 0.963 | 1.001 | 1.045 | 1.094 | 1.149 | 1.208 |
| 4.945000000000084 | 0.893 | 0.898 | 0.911 | 0.933 | 0.946 | 0.963 | 1.001 | 1.045 | 1.094 | 1.149 | 1.208 |
| 4.947500000000084 | 0.893 | 0.898 | 0.911 | 0.933 | 0.946 | 0.963 | 1.001 | 1.045 | 1.094 | 1.149 | 1.207 |
| 4.950000000000084 | 0.893 | 0.898 | 0.911 | 0.933 | 0.946 | 0.963 | 1.001 | 1.045 | 1.094 | 1.149 | 1.207 |
| 4.952500000000085 | 0.893 | 0.898 | 0.911 | 0.933 | 0.946 | 0.963 | 1.001 | 1.044 | 1.094 | 1.148 | 1.207 |
| 4.955000000000085 | 0.893 | 0.898 | 0.911 | 0.933 | 0.946 | 0.963 | 1.001 | 1.044 | 1.094 | 1.148 | 1.207 |
| 4.957500000000086 | 0.893 | 0.898 | 0.911 | 0.933 | 0.946 | 0.963 | 1.001 | 1.044 | 1.094 | 1.148 | 1.207 |
| 4.960000000000086 | 0.894 | 0.898 | 0.912 | 0.933 | 0.946 | 0.963 | 1.001 | 1.044 | 1.094 | 1.148 | 1.206 |
| 4.962500000000086 | 0.894 | 0.898 | 0.912 | 0.934 | 0.946 | 0.963 | 1.001 | 1.044 | 1.093 | 1.148 | 1.206 |
| 4.965000000000087 | 0.894 | 0.898 | 0.912 | 0.934 | 0.946 | 0.963 | 1.001 | 1.044 | 1.093 | 1.148 | 1.206 |
| 4.967500000000087 | 0.894 | 0.898 | 0.912 | 0.934 | 0.946 | 0.963 | 1 | 1.044 | 1.093 | 1.147 | 1.206 |
| 4.970000000000087 | 0.894 | 0.898 | 0.912 | 0.934 | 0.946 | 0.963 | 1 | 1.044 | 1.093 | 1.147 | 1.206 |
| 4.972500000000088 | 0.894 | 0.898 | 0.912 | 0.934 | 0.946 | 0.963 | 1 | 1.044 | 1.093 | 1.147 | 1.205 |
| 4.975000000000088 | 0.894 | 0.898 | 0.912 | 0.934 | 0.946 | 0.963 | 1 | 1.044 | 1.093 | 1.147 | 1.205 |
| 4.977500000000089 | 0.894 | 0.898 | 0.912 | 0.934 | 0.946 | 0.963 | 1 | 1.044 | 1.093 | 1.147 | 1.205 |
| 4.98000000000009 | 0.894 | 0.898 | 0.912 | 0.934 | 0.947 | 0.963 | 1 | 1.044 | 1.093 | 1.147 | 1.205 |
| 4.98250000000009 | 0.894 | 0.899 | 0.912 | 0.934 | 0.947 | 0.963 | 1 | 1.044 | 1.093 | 1.146 | 1.205 |
| 4.98500000000009 | 0.894 | 0.899 | 0.912 | 0.934 | 0.947 | 0.963 | 1 | 1.044 | 1.092 | 1.146 | 1.204 |
| 4.98750000000009 | 0.894 | 0.899 | 0.912 | 0.934 | 0.947 | 0.963 | 1 | 1.043 | 1.092 | 1.146 | 1.204 |
| 4.990000000000091 | 0.894 | 0.899 | 0.912 | 0.934 | 0.947 | 0.963 | 1 | 1.043 | 1.092 | 1.146 | 1.204 |
| 4.992500000000091 | 0.894 | 0.899 | 0.912 | 0.934 | 0.947 | 0.963 | 1 | 1.043 | 1.092 | 1.146 | 1.204 |
| 4.995000000000092 | 0.894 | 0.899 | 0.912 | 0.934 | 0.947 | 0.963 | 1 | 1.043 | 1.092 | 1.146 | 1.204 |
| 4.997500000000092 | 0.894 | 0.899 | 0.912 | 0.934 | 0.947 | 0.963 | 1 | 1.043 | 1.092 | 1.146 | 1.204 |
| 5.000000000000092 | 0.894 | 0.899 | 0.912 | 0.934 | 0.947 | 0.963 | 1 | 1.043 | 1.092 | 1.145 | 1.203 |
| 5.002500000000093 | 0.894 | 0.899 | 0.912 | 0.934 | 0.947 | 0.963 | 1 | 1.043 | 1.092 | 1.145 | 1.203 |
| 5.005000000000093 | 0.895 | 0.899 | 0.912 | 0.934 | 0.947 | 0.963 | 1 | 1.043 | 1.092 | 1.145 | 1.203 |
| 5.007500000000094 | 0.895 | 0.899 | 0.912 | 0.934 | 0.947 | 0.963 | 1 | 1.043 | 1.091 | 1.145 | 1.203 |
| 5.010000000000094 | 0.895 | 0.899 | 0.912 | 0.934 | 0.947 | 0.963 | 1 | 1.043 | 1.091 | 1.145 | 1.203 |
| 5.012500000000094 | 0.895 | 0.899 | 0.912 | 0.934 | 0.947 | 0.963 | 1 | 1.043 | 1.091 | 1.145 | 1.202 |
| 5.015000000000095 | 0.895 | 0.899 | 0.912 | 0.934 | 0.947 | 0.963 | 1 | 1.043 | 1.091 | 1.145 | 1.202 |
| 5.017500000000095 | 0.895 | 0.899 | 0.912 | 0.934 | 0.947 | 0.963 | 1 | 1.043 | 1.091 | 1.144 | 1.202 |
| 5.020000000000095 | 0.895 | 0.899 | 0.912 | 0.934 | 0.947 | 0.963 | 1 | 1.042 | 1.091 | 1.144 | 1.202 |
| 5.022500000000096 | 0.895 | 0.899 | 0.912 | 0.934 | 0.947 | 0.963 | 1 | 1.042 | 1.091 | 1.144 | 1.202 |
| 5.025000000000096 | 0.895 | 0.899 | 0.913 | 0.934 | 0.947 | 0.963 | 1 | 1.042 | 1.091 | 1.144 | 1.201 |
| 5.027500000000097 | 0.895 | 0.899 | 0.913 | 0.934 | 0.947 | 0.963 | 1 | 1.042 | 1.091 | 1.144 | 1.201 |
| 5.030000000000097 | 0.895 | 0.9 | 0.913 | 0.934 | 0.947 | 0.963 | 1 | 1.042 | 1.09 | 1.144 | 1.201 |
| 5.032500000000097 | 0.895 | 0.9 | 0.913 | 0.934 | 0.947 | 0.963 | 1 | 1.042 | 1.09 | 1.143 | 1.201 |
| 5.035000000000098 | 0.895 | 0.9 | 0.913 | 0.934 | 0.947 | 0.963 | 0.999 | 1.042 | 1.09 | 1.143 | 1.201 |
| 5.037500000000098 | 0.895 | 0.9 | 0.913 | 0.934 | 0.947 | 0.963 | 0.999 | 1.042 | 1.09 | 1.143 | 1.2 |
| 5.040000000000099 | 0.895 | 0.9 | 0.913 | 0.934 | 0.947 | 0.963 | 0.999 | 1.042 | 1.09 | 1.143 | 1.2 |
| 5.042500000000099 | 0.895 | 0.9 | 0.913 | 0.934 | 0.947 | 0.963 | 0.999 | 1.042 | 1.09 | 1.143 | 1.2 |
| 5.045000000000099 | 0.895 | 0.9 | 0.913 | 0.934 | 0.947 | 0.963 | 0.999 | 1.042 | 1.09 | 1.143 | 1.2 |
| 5.0475000000001 | 0.895 | 0.9 | 0.913 | 0.934 | 0.947 | 0.963 | 0.999 | 1.042 | 1.09 | 1.143 | 1.2 |
| 5.0500000000001 | 0.896 | 0.9 | 0.913 | 0.934 | 0.947 | 0.963 | 0.999 | 1.042 | 1.09 | 1.142 | 1.199 |
| 5.052500000000101 | 0.896 | 0.9 | 0.913 | 0.934 | 0.947 | 0.963 | 0.999 | 1.042 | 1.089 | 1.142 | 1.199 |
| 5.055000000000101 | 0.896 | 0.9 | 0.913 | 0.934 | 0.947 | 0.963 | 0.999 | 1.041 | 1.089 | 1.142 | 1.199 |
| 5.057500000000101 | 0.896 | 0.9 | 0.913 | 0.934 | 0.947 | 0.963 | 0.999 | 1.041 | 1.089 | 1.142 | 1.199 |
| 5.060000000000102 | 0.896 | 0.9 | 0.913 | 0.934 | 0.947 | 0.963 | 0.999 | 1.041 | 1.089 | 1.142 | 1.199 |
| 5.062500000000102 | 0.896 | 0.9 | 0.913 | 0.934 | 0.947 | 0.963 | 0.999 | 1.041 | 1.089 | 1.142 | 1.199 |
| 5.065000000000103 | 0.896 | 0.9 | 0.913 | 0.934 | 0.947 | 0.963 | 0.999 | 1.041 | 1.089 | 1.142 | 1.198 |
| 5.067500000000103 | 0.896 | 0.9 | 0.913 | 0.934 | 0.947 | 0.963 | 0.999 | 1.041 | 1.089 | 1.141 | 1.198 |
| 5.070000000000103 | 0.896 | 0.9 | 0.913 | 0.934 | 0.947 | 0.963 | 0.999 | 1.041 | 1.089 | 1.141 | 1.198 |
| 5.072500000000104 | 0.896 | 0.9 | 0.913 | 0.934 | 0.947 | 0.963 | 0.999 | 1.041 | 1.089 | 1.141 | 1.198 |
| 5.075000000000104 | 0.896 | 0.9 | 0.913 | 0.934 | 0.947 | 0.963 | 0.999 | 1.041 | 1.089 | 1.141 | 1.198 |
| 5.077500000000104 | 0.896 | 0.9 | 0.913 | 0.934 | 0.947 | 0.963 | 0.999 | 1.041 | 1.088 | 1.141 | 1.197 |
| 5.080000000000104 | 0.896 | 0.901 | 0.913 | 0.934 | 0.947 | 0.963 | 0.999 | 1.041 | 1.088 | 1.141 | 1.197 |
| 5.082500000000105 | 0.896 | 0.901 | 0.913 | 0.934 | 0.947 | 0.963 | 0.999 | 1.041 | 1.088 | 1.141 | 1.197 |
| 5.085000000000105 | 0.896 | 0.901 | 0.913 | 0.934 | 0.947 | 0.963 | 0.999 | 1.041 | 1.088 | 1.14 | 1.197 |
| 5.087500000000106 | 0.896 | 0.901 | 0.913 | 0.934 | 0.947 | 0.963 | 0.999 | 1.041 | 1.088 | 1.14 | 1.197 |
| 5.090000000000106 | 0.896 | 0.901 | 0.914 | 0.935 | 0.947 | 0.963 | 0.999 | 1.041 | 1.088 | 1.14 | 1.196 |
| 5.092500000000107 | 0.896 | 0.901 | 0.914 | 0.935 | 0.947 | 0.963 | 0.999 | 1.04 | 1.088 | 1.14 | 1.196 |
| 5.095000000000107 | 0.897 | 0.901 | 0.914 | 0.935 | 0.947 | 0.963 | 0.999 | 1.04 | 1.088 | 1.14 | 1.196 |
| 5.097500000000108 | 0.897 | 0.901 | 0.914 | 0.935 | 0.947 | 0.963 | 0.999 | 1.04 | 1.088 | 1.14 | 1.196 |
| 5.100000000000108 | 0.897 | 0.901 | 0.914 | 0.935 | 0.947 | 0.963 | 0.999 | 1.04 | 1.087 | 1.139 | 1.196 |
| 5.102500000000108 | 0.897 | 0.901 | 0.914 | 0.935 | 0.947 | 0.963 | 0.999 | 1.04 | 1.087 | 1.139 | 1.196 |
| 5.105000000000109 | 0.897 | 0.901 | 0.914 | 0.935 | 0.947 | 0.963 | 0.998 | 1.04 | 1.087 | 1.139 | 1.195 |
| 5.107500000000109 | 0.897 | 0.901 | 0.914 | 0.935 | 0.947 | 0.963 | 0.998 | 1.04 | 1.087 | 1.139 | 1.195 |
| 5.11000000000011 | 0.897 | 0.901 | 0.914 | 0.935 | 0.947 | 0.963 | 0.998 | 1.04 | 1.087 | 1.139 | 1.195 |
| 5.11250000000011 | 0.897 | 0.901 | 0.914 | 0.935 | 0.947 | 0.963 | 0.998 | 1.04 | 1.087 | 1.139 | 1.195 |
| 5.11500000000011 | 0.897 | 0.901 | 0.914 | 0.935 | 0.947 | 0.963 | 0.998 | 1.04 | 1.087 | 1.139 | 1.195 |
| 5.117500000000111 | 0.897 | 0.901 | 0.914 | 0.935 | 0.947 | 0.963 | 0.998 | 1.04 | 1.087 | 1.138 | 1.194 |
| 5.120000000000111 | 0.897 | 0.901 | 0.914 | 0.935 | 0.947 | 0.963 | 0.998 | 1.04 | 1.087 | 1.138 | 1.194 |
| 5.122500000000112 | 0.897 | 0.901 | 0.914 | 0.935 | 0.947 | 0.963 | 0.998 | 1.04 | 1.087 | 1.138 | 1.194 |
| 5.125000000000112 | 0.897 | 0.901 | 0.914 | 0.935 | 0.947 | 0.963 | 0.998 | 1.04 | 1.086 | 1.138 | 1.194 |
| 5.127500000000112 | 0.897 | 0.901 | 0.914 | 0.935 | 0.947 | 0.963 | 0.998 | 1.039 | 1.086 | 1.138 | 1.194 |
| 5.130000000000113 | 0.897 | 0.902 | 0.914 | 0.935 | 0.947 | 0.963 | 0.998 | 1.039 | 1.086 | 1.138 | 1.194 |
| 5.132500000000113 | 0.897 | 0.902 | 0.914 | 0.935 | 0.947 | 0.963 | 0.998 | 1.039 | 1.086 | 1.138 | 1.193 |
| 5.135000000000113 | 0.897 | 0.902 | 0.914 | 0.935 | 0.947 | 0.963 | 0.998 | 1.039 | 1.086 | 1.137 | 1.193 |
| 5.137500000000114 | 0.897 | 0.902 | 0.914 | 0.935 | 0.947 | 0.963 | 0.998 | 1.039 | 1.086 | 1.137 | 1.193 |
| 5.140000000000114 | 0.897 | 0.902 | 0.914 | 0.935 | 0.947 | 0.963 | 0.998 | 1.039 | 1.086 | 1.137 | 1.193 |
| 5.142500000000115 | 0.898 | 0.902 | 0.914 | 0.935 | 0.947 | 0.963 | 0.998 | 1.039 | 1.086 | 1.137 | 1.193 |
| 5.145000000000115 | 0.898 | 0.902 | 0.914 | 0.935 | 0.947 | 0.963 | 0.998 | 1.039 | 1.086 | 1.137 | 1.192 |
| 5.147500000000115 | 0.898 | 0.902 | 0.914 | 0.935 | 0.947 | 0.963 | 0.998 | 1.039 | 1.085 | 1.137 | 1.192 |
| 5.150000000000116 | 0.898 | 0.902 | 0.914 | 0.935 | 0.947 | 0.963 | 0.998 | 1.039 | 1.085 | 1.137 | 1.192 |
| 5.152500000000116 | 0.898 | 0.902 | 0.914 | 0.935 | 0.947 | 0.963 | 0.998 | 1.039 | 1.085 | 1.136 | 1.192 |
| 5.155000000000117 | 0.898 | 0.902 | 0.915 | 0.935 | 0.947 | 0.963 | 0.998 | 1.039 | 1.085 | 1.136 | 1.192 |
| 5.157500000000117 | 0.898 | 0.902 | 0.915 | 0.935 | 0.947 | 0.963 | 0.998 | 1.039 | 1.085 | 1.136 | 1.192 |
| 5.160000000000117 | 0.898 | 0.902 | 0.915 | 0.935 | 0.947 | 0.963 | 0.998 | 1.039 | 1.085 | 1.136 | 1.191 |
| 5.162500000000118 | 0.898 | 0.902 | 0.915 | 0.935 | 0.947 | 0.963 | 0.998 | 1.039 | 1.085 | 1.136 | 1.191 |
| 5.165000000000118 | 0.898 | 0.902 | 0.915 | 0.935 | 0.947 | 0.963 | 0.998 | 1.038 | 1.085 | 1.136 | 1.191 |
| 5.167500000000119 | 0.898 | 0.902 | 0.915 | 0.935 | 0.947 | 0.963 | 0.998 | 1.038 | 1.085 | 1.136 | 1.191 |
| 5.170000000000119 | 0.898 | 0.902 | 0.915 | 0.935 | 0.947 | 0.963 | 0.998 | 1.038 | 1.085 | 1.136 | 1.191 |
| 5.172500000000119 | 0.898 | 0.902 | 0.915 | 0.935 | 0.947 | 0.963 | 0.998 | 1.038 | 1.084 | 1.135 | 1.19 |
| 5.17500000000012 | 0.898 | 0.902 | 0.915 | 0.935 | 0.947 | 0.963 | 0.998 | 1.038 | 1.084 | 1.135 | 1.19 |
| 5.17750000000012 | 0.898 | 0.902 | 0.915 | 0.935 | 0.947 | 0.963 | 0.997 | 1.038 | 1.084 | 1.135 | 1.19 |
| 5.18000000000012 | 0.898 | 0.902 | 0.915 | 0.935 | 0.947 | 0.963 | 0.997 | 1.038 | 1.084 | 1.135 | 1.19 |
| 5.182500000000121 | 0.898 | 0.903 | 0.915 | 0.935 | 0.947 | 0.963 | 0.997 | 1.038 | 1.084 | 1.135 | 1.19 |
| 5.185000000000121 | 0.898 | 0.903 | 0.915 | 0.935 | 0.947 | 0.963 | 0.997 | 1.038 | 1.084 | 1.135 | 1.19 |
| 5.187500000000122 | 0.898 | 0.903 | 0.915 | 0.935 | 0.947 | 0.963 | 0.997 | 1.038 | 1.084 | 1.135 | 1.189 |
| 5.190000000000122 | 0.899 | 0.903 | 0.915 | 0.935 | 0.947 | 0.963 | 0.997 | 1.038 | 1.084 | 1.134 | 1.189 |
| 5.192500000000122 | 0.899 | 0.903 | 0.915 | 0.935 | 0.947 | 0.963 | 0.997 | 1.038 | 1.084 | 1.134 | 1.189 |
| 5.195000000000123 | 0.899 | 0.903 | 0.915 | 0.935 | 0.947 | 0.963 | 0.997 | 1.038 | 1.084 | 1.134 | 1.189 |
| 5.197500000000123 | 0.899 | 0.903 | 0.915 | 0.935 | 0.947 | 0.963 | 0.997 | 1.038 | 1.083 | 1.134 | 1.189 |
| 5.200000000000123 | 0.899 | 0.903 | 0.915 | 0.935 | 0.947 | 0.963 | 0.997 | 1.038 | 1.083 | 1.134 | 1.189 |
| 5.202500000000124 | 0.899 | 0.903 | 0.915 | 0.935 | 0.947 | 0.963 | 0.997 | 1.037 | 1.083 | 1.134 | 1.188 |
| 5.205000000000124 | 0.899 | 0.903 | 0.915 | 0.935 | 0.947 | 0.963 | 0.997 | 1.037 | 1.083 | 1.134 | 1.188 |
| 5.207500000000124 | 0.899 | 0.903 | 0.915 | 0.935 | 0.947 | 0.963 | 0.997 | 1.037 | 1.083 | 1.133 | 1.188 |
| 5.210000000000125 | 0.899 | 0.903 | 0.915 | 0.935 | 0.947 | 0.963 | 0.997 | 1.037 | 1.083 | 1.133 | 1.188 |
| 5.212500000000125 | 0.899 | 0.903 | 0.915 | 0.935 | 0.947 | 0.963 | 0.997 | 1.037 | 1.083 | 1.133 | 1.188 |
| 5.215000000000125 | 0.899 | 0.903 | 0.915 | 0.935 | 0.947 | 0.963 | 0.997 | 1.037 | 1.083 | 1.133 | 1.187 |
| 5.217500000000126 | 0.899 | 0.903 | 0.915 | 0.935 | 0.947 | 0.963 | 0.997 | 1.037 | 1.083 | 1.133 | 1.187 |
| 5.220000000000126 | 0.899 | 0.903 | 0.915 | 0.936 | 0.947 | 0.963 | 0.997 | 1.037 | 1.083 | 1.133 | 1.187 |
| 5.222500000000127 | 0.899 | 0.903 | 0.916 | 0.936 | 0.947 | 0.963 | 0.997 | 1.037 | 1.082 | 1.133 | 1.187 |
| 5.225000000000127 | 0.899 | 0.903 | 0.916 | 0.936 | 0.947 | 0.963 | 0.997 | 1.037 | 1.082 | 1.132 | 1.187 |
| 5.227500000000128 | 0.899 | 0.903 | 0.916 | 0.936 | 0.947 | 0.963 | 0.997 | 1.037 | 1.082 | 1.132 | 1.187 |
| 5.230000000000128 | 0.899 | 0.903 | 0.916 | 0.936 | 0.947 | 0.963 | 0.997 | 1.037 | 1.082 | 1.132 | 1.186 |
| 5.232500000000128 | 0.899 | 0.903 | 0.916 | 0.936 | 0.947 | 0.963 | 0.997 | 1.037 | 1.082 | 1.132 | 1.186 |
| 5.23500000000013 | 0.899 | 0.904 | 0.916 | 0.936 | 0.947 | 0.963 | 0.997 | 1.037 | 1.082 | 1.132 | 1.186 |
| 5.23750000000013 | 0.899 | 0.904 | 0.916 | 0.936 | 0.947 | 0.963 | 0.997 | 1.037 | 1.082 | 1.132 | 1.186 |
| 5.24000000000013 | 0.9 | 0.904 | 0.916 | 0.936 | 0.947 | 0.963 | 0.997 | 1.037 | 1.082 | 1.132 | 1.186 |
| 5.24250000000013 | 0.9 | 0.904 | 0.916 | 0.936 | 0.947 | 0.963 | 0.997 | 1.036 | 1.082 | 1.132 | 1.186 |
| 5.24500000000013 | 0.9 | 0.904 | 0.916 | 0.936 | 0.947 | 0.963 | 0.997 | 1.036 | 1.082 | 1.131 | 1.185 |
| 5.247500000000131 | 0.9 | 0.904 | 0.916 | 0.936 | 0.947 | 0.963 | 0.997 | 1.036 | 1.081 | 1.131 | 1.185 |
| 5.250000000000131 | 0.9 | 0.904 | 0.916 | 0.936 | 0.947 | 0.963 | 0.997 | 1.036 | 1.081 | 1.131 | 1.185 |
| 5.252500000000132 | 0.9 | 0.904 | 0.916 | 0.936 | 0.947 | 0.963 | 0.997 | 1.036 | 1.081 | 1.131 | 1.185 |
| 5.255000000000132 | 0.9 | 0.904 | 0.916 | 0.936 | 0.947 | 0.963 | 0.996 | 1.036 | 1.081 | 1.131 | 1.185 |
| 5.257500000000133 | 0.9 | 0.904 | 0.916 | 0.936 | 0.947 | 0.963 | 0.996 | 1.036 | 1.081 | 1.131 | 1.185 |
| 5.260000000000133 | 0.9 | 0.904 | 0.916 | 0.936 | 0.947 | 0.963 | 0.996 | 1.036 | 1.081 | 1.131 | 1.184 |
| 5.262500000000133 | 0.9 | 0.904 | 0.916 | 0.936 | 0.947 | 0.963 | 0.996 | 1.036 | 1.081 | 1.13 | 1.184 |
| 5.265000000000134 | 0.9 | 0.904 | 0.916 | 0.936 | 0.947 | 0.963 | 0.996 | 1.036 | 1.081 | 1.13 | 1.184 |
| 5.267500000000134 | 0.9 | 0.904 | 0.916 | 0.936 | 0.947 | 0.963 | 0.996 | 1.036 | 1.081 | 1.13 | 1.184 |
| 5.270000000000134 | 0.9 | 0.904 | 0.916 | 0.936 | 0.948 | 0.963 | 0.996 | 1.036 | 1.081 | 1.13 | 1.184 |
| 5.272500000000134 | 0.9 | 0.904 | 0.916 | 0.936 | 0.948 | 0.963 | 0.996 | 1.036 | 1.08 | 1.13 | 1.183 |
| 5.275000000000135 | 0.9 | 0.904 | 0.916 | 0.936 | 0.948 | 0.963 | 0.996 | 1.036 | 1.08 | 1.13 | 1.183 |
| 5.277500000000135 | 0.9 | 0.904 | 0.916 | 0.936 | 0.948 | 0.963 | 0.996 | 1.036 | 1.08 | 1.13 | 1.183 |
| 5.280000000000136 | 0.9 | 0.904 | 0.916 | 0.936 | 0.948 | 0.963 | 0.996 | 1.036 | 1.08 | 1.13 | 1.183 |
| 5.282500000000136 | 0.9 | 0.904 | 0.916 | 0.936 | 0.948 | 0.963 | 0.996 | 1.035 | 1.08 | 1.129 | 1.183 |
| 5.285000000000136 | 0.9 | 0.904 | 0.916 | 0.936 | 0.948 | 0.963 | 0.996 | 1.035 | 1.08 | 1.129 | 1.183 |
| 5.287500000000137 | 0.9 | 0.905 | 0.916 | 0.936 | 0.948 | 0.963 | 0.996 | 1.035 | 1.08 | 1.129 | 1.182 |
| 5.290000000000137 | 0.901 | 0.905 | 0.916 | 0.936 | 0.948 | 0.963 | 0.996 | 1.035 | 1.08 | 1.129 | 1.182 |
| 5.292500000000138 | 0.901 | 0.905 | 0.917 | 0.936 | 0.948 | 0.963 | 0.996 | 1.035 | 1.08 | 1.129 | 1.182 |
| 5.295000000000138 | 0.901 | 0.905 | 0.917 | 0.936 | 0.948 | 0.963 | 0.996 | 1.035 | 1.08 | 1.129 | 1.182 |
| 5.297500000000139 | 0.901 | 0.905 | 0.917 | 0.936 | 0.948 | 0.963 | 0.996 | 1.035 | 1.08 | 1.129 | 1.182 |
| 5.30000000000014 | 0.901 | 0.905 | 0.917 | 0.936 | 0.948 | 0.963 | 0.996 | 1.035 | 1.079 | 1.128 | 1.182 |
| 5.30250000000014 | 0.901 | 0.905 | 0.917 | 0.936 | 0.948 | 0.963 | 0.996 | 1.035 | 1.079 | 1.128 | 1.181 |
| 5.30500000000014 | 0.901 | 0.905 | 0.917 | 0.936 | 0.948 | 0.963 | 0.996 | 1.035 | 1.079 | 1.128 | 1.181 |
| 5.30750000000014 | 0.901 | 0.905 | 0.917 | 0.936 | 0.948 | 0.963 | 0.996 | 1.035 | 1.079 | 1.128 | 1.181 |
| 5.310000000000141 | 0.901 | 0.905 | 0.917 | 0.936 | 0.948 | 0.963 | 0.996 | 1.035 | 1.079 | 1.128 | 1.181 |
| 5.312500000000141 | 0.901 | 0.905 | 0.917 | 0.936 | 0.948 | 0.963 | 0.996 | 1.035 | 1.079 | 1.128 | 1.181 |
| 5.315000000000142 | 0.901 | 0.905 | 0.917 | 0.936 | 0.948 | 0.963 | 0.996 | 1.035 | 1.079 | 1.128 | 1.181 |
| 5.317500000000142 | 0.901 | 0.905 | 0.917 | 0.936 | 0.948 | 0.963 | 0.996 | 1.035 | 1.079 | 1.128 | 1.18 |
| 5.320000000000142 | 0.901 | 0.905 | 0.917 | 0.936 | 0.948 | 0.963 | 0.996 | 1.035 | 1.079 | 1.127 | 1.18 |
| 5.322500000000143 | 0.901 | 0.905 | 0.917 | 0.936 | 0.948 | 0.963 | 0.996 | 1.034 | 1.079 | 1.127 | 1.18 |
| 5.325000000000143 | 0.901 | 0.905 | 0.917 | 0.936 | 0.948 | 0.963 | 0.996 | 1.034 | 1.078 | 1.127 | 1.18 |
| 5.327500000000144 | 0.901 | 0.905 | 0.917 | 0.936 | 0.948 | 0.963 | 0.996 | 1.034 | 1.078 | 1.127 | 1.18 |
| 5.330000000000144 | 0.901 | 0.905 | 0.917 | 0.936 | 0.948 | 0.963 | 0.996 | 1.034 | 1.078 | 1.127 | 1.18 |
| 5.332500000000144 | 0.901 | 0.905 | 0.917 | 0.936 | 0.948 | 0.963 | 0.996 | 1.034 | 1.078 | 1.127 | 1.179 |
| 5.335000000000144 | 0.901 | 0.905 | 0.917 | 0.936 | 0.948 | 0.963 | 0.995 | 1.034 | 1.078 | 1.127 | 1.179 |
| 5.337500000000145 | 0.901 | 0.905 | 0.917 | 0.936 | 0.948 | 0.963 | 0.995 | 1.034 | 1.078 | 1.127 | 1.179 |
| 5.340000000000145 | 0.902 | 0.905 | 0.917 | 0.936 | 0.948 | 0.963 | 0.995 | 1.034 | 1.078 | 1.126 | 1.179 |
| 5.342500000000146 | 0.902 | 0.906 | 0.917 | 0.936 | 0.948 | 0.963 | 0.995 | 1.034 | 1.078 | 1.126 | 1.179 |
| 5.345000000000146 | 0.902 | 0.906 | 0.917 | 0.936 | 0.948 | 0.963 | 0.995 | 1.034 | 1.078 | 1.126 | 1.179 |
| 5.347500000000147 | 0.902 | 0.906 | 0.917 | 0.936 | 0.948 | 0.963 | 0.995 | 1.034 | 1.078 | 1.126 | 1.178 |
| 5.350000000000147 | 0.902 | 0.906 | 0.917 | 0.936 | 0.948 | 0.963 | 0.995 | 1.034 | 1.078 | 1.126 | 1.178 |
| 5.352500000000147 | 0.902 | 0.906 | 0.917 | 0.937 | 0.948 | 0.963 | 0.995 | 1.034 | 1.077 | 1.126 | 1.178 |
| 5.355000000000148 | 0.902 | 0.906 | 0.917 | 0.937 | 0.948 | 0.963 | 0.995 | 1.034 | 1.077 | 1.126 | 1.178 |
| 5.357500000000148 | 0.902 | 0.906 | 0.917 | 0.937 | 0.948 | 0.963 | 0.995 | 1.034 | 1.077 | 1.125 | 1.178 |
| 5.360000000000149 | 0.902 | 0.906 | 0.917 | 0.937 | 0.948 | 0.963 | 0.995 | 1.034 | 1.077 | 1.125 | 1.178 |
| 5.362500000000149 | 0.902 | 0.906 | 0.918 | 0.937 | 0.948 | 0.963 | 0.995 | 1.034 | 1.077 | 1.125 | 1.177 |
| 5.365000000000149 | 0.902 | 0.906 | 0.918 | 0.937 | 0.948 | 0.963 | 0.995 | 1.033 | 1.077 | 1.125 | 1.177 |
| 5.36750000000015 | 0.902 | 0.906 | 0.918 | 0.937 | 0.948 | 0.963 | 0.995 | 1.033 | 1.077 | 1.125 | 1.177 |
| 5.37000000000015 | 0.902 | 0.906 | 0.918 | 0.937 | 0.948 | 0.963 | 0.995 | 1.033 | 1.077 | 1.125 | 1.177 |
| 5.372500000000151 | 0.902 | 0.906 | 0.918 | 0.937 | 0.948 | 0.963 | 0.995 | 1.033 | 1.077 | 1.125 | 1.177 |
| 5.375000000000151 | 0.902 | 0.906 | 0.918 | 0.937 | 0.948 | 0.963 | 0.995 | 1.033 | 1.077 | 1.125 | 1.177 |
| 5.377500000000151 | 0.902 | 0.906 | 0.918 | 0.937 | 0.948 | 0.963 | 0.995 | 1.033 | 1.077 | 1.124 | 1.176 |
| 5.380000000000152 | 0.902 | 0.906 | 0.918 | 0.937 | 0.948 | 0.963 | 0.995 | 1.033 | 1.076 | 1.124 | 1.176 |
| 5.382500000000152 | 0.902 | 0.906 | 0.918 | 0.937 | 0.948 | 0.963 | 0.995 | 1.033 | 1.076 | 1.124 | 1.176 |
| 5.385000000000152 | 0.902 | 0.906 | 0.918 | 0.937 | 0.948 | 0.963 | 0.995 | 1.033 | 1.076 | 1.124 | 1.176 |
| 5.387500000000153 | 0.902 | 0.906 | 0.918 | 0.937 | 0.948 | 0.963 | 0.995 | 1.033 | 1.076 | 1.124 | 1.176 |
| 5.390000000000153 | 0.902 | 0.906 | 0.918 | 0.937 | 0.948 | 0.963 | 0.995 | 1.033 | 1.076 | 1.124 | 1.176 |
| 5.392500000000154 | 0.903 | 0.906 | 0.918 | 0.937 | 0.948 | 0.963 | 0.995 | 1.033 | 1.076 | 1.124 | 1.175 |
| 5.395000000000154 | 0.903 | 0.906 | 0.918 | 0.937 | 0.948 | 0.963 | 0.995 | 1.033 | 1.076 | 1.124 | 1.175 |
| 5.397500000000154 | 0.903 | 0.906 | 0.918 | 0.937 | 0.948 | 0.963 | 0.995 | 1.033 | 1.076 | 1.123 | 1.175 |
| 5.400000000000154 | 0.903 | 0.907 | 0.918 | 0.937 | 0.948 | 0.963 | 0.995 | 1.033 | 1.076 | 1.123 | 1.175 |
| 5.402500000000155 | 0.903 | 0.907 | 0.918 | 0.937 | 0.948 | 0.963 | 0.995 | 1.033 | 1.076 | 1.123 | 1.175 |
| 5.405000000000155 | 0.903 | 0.907 | 0.918 | 0.937 | 0.948 | 0.963 | 0.995 | 1.033 | 1.076 | 1.123 | 1.175 |
| 5.407500000000156 | 0.903 | 0.907 | 0.918 | 0.937 | 0.948 | 0.963 | 0.995 | 1.032 | 1.075 | 1.123 | 1.175 |
| 5.410000000000156 | 0.903 | 0.907 | 0.918 | 0.937 | 0.948 | 0.963 | 0.995 | 1.032 | 1.075 | 1.123 | 1.174 |
| 5.412500000000157 | 0.903 | 0.907 | 0.918 | 0.937 | 0.948 | 0.963 | 0.995 | 1.032 | 1.075 | 1.123 | 1.174 |
| 5.415000000000157 | 0.903 | 0.907 | 0.918 | 0.937 | 0.948 | 0.963 | 0.995 | 1.032 | 1.075 | 1.123 | 1.174 |
| 5.417500000000158 | 0.903 | 0.907 | 0.918 | 0.937 | 0.948 | 0.963 | 0.995 | 1.032 | 1.075 | 1.122 | 1.174 |
| 5.420000000000158 | 0.903 | 0.907 | 0.918 | 0.937 | 0.948 | 0.963 | 0.994 | 1.032 | 1.075 | 1.122 | 1.174 |
| 5.422500000000158 | 0.903 | 0.907 | 0.918 | 0.937 | 0.948 | 0.963 | 0.994 | 1.032 | 1.075 | 1.122 | 1.174 |
| 5.425000000000159 | 0.903 | 0.907 | 0.918 | 0.937 | 0.948 | 0.963 | 0.994 | 1.032 | 1.075 | 1.122 | 1.173 |
| 5.427500000000159 | 0.903 | 0.907 | 0.918 | 0.937 | 0.948 | 0.963 | 0.994 | 1.032 | 1.075 | 1.122 | 1.173 |
| 5.43000000000016 | 0.903 | 0.907 | 0.918 | 0.937 | 0.948 | 0.963 | 0.994 | 1.032 | 1.075 | 1.122 | 1.173 |
| 5.43250000000016 | 0.903 | 0.907 | 0.918 | 0.937 | 0.948 | 0.963 | 0.994 | 1.032 | 1.075 | 1.122 | 1.173 |
| 5.43500000000016 | 0.903 | 0.907 | 0.918 | 0.937 | 0.948 | 0.963 | 0.994 | 1.032 | 1.074 | 1.122 | 1.173 |
| 5.43750000000016 | 0.903 | 0.907 | 0.919 | 0.937 | 0.948 | 0.963 | 0.994 | 1.032 | 1.074 | 1.121 | 1.173 |
| 5.44000000000016 | 0.903 | 0.907 | 0.919 | 0.937 | 0.948 | 0.963 | 0.994 | 1.032 | 1.074 | 1.121 | 1.172 |
| 5.442500000000161 | 0.903 | 0.907 | 0.919 | 0.937 | 0.948 | 0.963 | 0.994 | 1.032 | 1.074 | 1.121 | 1.172 |
| 5.445000000000161 | 0.904 | 0.907 | 0.919 | 0.937 | 0.948 | 0.963 | 0.994 | 1.032 | 1.074 | 1.121 | 1.172 |
| 5.447500000000162 | 0.904 | 0.907 | 0.919 | 0.937 | 0.948 | 0.963 | 0.994 | 1.032 | 1.074 | 1.121 | 1.172 |
| 5.450000000000162 | 0.904 | 0.907 | 0.919 | 0.937 | 0.948 | 0.963 | 0.994 | 1.031 | 1.074 | 1.121 | 1.172 |
| 5.452500000000163 | 0.904 | 0.907 | 0.919 | 0.937 | 0.948 | 0.963 | 0.994 | 1.031 | 1.074 | 1.121 | 1.172 |
| 5.455000000000163 | 0.904 | 0.907 | 0.919 | 0.937 | 0.948 | 0.963 | 0.994 | 1.031 | 1.074 | 1.121 | 1.172 |
| 5.457500000000164 | 0.904 | 0.908 | 0.919 | 0.937 | 0.948 | 0.963 | 0.994 | 1.031 | 1.074 | 1.121 | 1.171 |
| 5.460000000000164 | 0.904 | 0.908 | 0.919 | 0.937 | 0.948 | 0.963 | 0.994 | 1.031 | 1.074 | 1.12 | 1.171 |
| 5.462500000000164 | 0.904 | 0.908 | 0.919 | 0.937 | 0.948 | 0.963 | 0.994 | 1.031 | 1.073 | 1.12 | 1.171 |
| 5.465000000000165 | 0.904 | 0.908 | 0.919 | 0.937 | 0.948 | 0.963 | 0.994 | 1.031 | 1.073 | 1.12 | 1.171 |
| 5.467500000000165 | 0.904 | 0.908 | 0.919 | 0.937 | 0.948 | 0.963 | 0.994 | 1.031 | 1.073 | 1.12 | 1.171 |
| 5.470000000000165 | 0.904 | 0.908 | 0.919 | 0.937 | 0.948 | 0.963 | 0.994 | 1.031 | 1.073 | 1.12 | 1.171 |
| 5.472500000000166 | 0.904 | 0.908 | 0.919 | 0.937 | 0.948 | 0.963 | 0.994 | 1.031 | 1.073 | 1.12 | 1.17 |
| 5.475000000000166 | 0.904 | 0.908 | 0.919 | 0.937 | 0.948 | 0.963 | 0.994 | 1.031 | 1.073 | 1.12 | 1.17 |
| 5.477500000000166 | 0.904 | 0.908 | 0.919 | 0.937 | 0.948 | 0.963 | 0.994 | 1.031 | 1.073 | 1.12 | 1.17 |
| 5.480000000000167 | 0.904 | 0.908 | 0.919 | 0.937 | 0.948 | 0.963 | 0.994 | 1.031 | 1.073 | 1.119 | 1.17 |
| 5.482500000000167 | 0.904 | 0.908 | 0.919 | 0.937 | 0.948 | 0.962 | 0.994 | 1.031 | 1.073 | 1.119 | 1.17 |
| 5.485000000000168 | 0.904 | 0.908 | 0.919 | 0.937 | 0.948 | 0.962 | 0.994 | 1.031 | 1.073 | 1.119 | 1.17 |
| 5.487500000000168 | 0.904 | 0.908 | 0.919 | 0.937 | 0.948 | 0.962 | 0.994 | 1.031 | 1.073 | 1.119 | 1.169 |
| 5.490000000000168 | 0.904 | 0.908 | 0.919 | 0.937 | 0.948 | 0.962 | 0.994 | 1.031 | 1.072 | 1.119 | 1.169 |
| 5.49250000000017 | 0.904 | 0.908 | 0.919 | 0.938 | 0.948 | 0.962 | 0.994 | 1.031 | 1.072 | 1.119 | 1.169 |
| 5.49500000000017 | 0.904 | 0.908 | 0.919 | 0.938 | 0.948 | 0.962 | 0.994 | 1.03 | 1.072 | 1.119 | 1.169 |
| 5.49750000000017 | 0.904 | 0.908 | 0.919 | 0.938 | 0.948 | 0.962 | 0.994 | 1.03 | 1.072 | 1.119 | 1.169 |
| 5.50000000000017 | 0.905 | 0.908 | 0.919 | 0.938 | 0.948 | 0.962 | 0.994 | 1.03 | 1.072 | 1.118 | 1.169 |
| 5.502500000000171 | 0.905 | 0.908 | 0.919 | 0.938 | 0.948 | 0.962 | 0.994 | 1.03 | 1.072 | 1.118 | 1.169 |
| 5.505000000000171 | 0.905 | 0.908 | 0.919 | 0.938 | 0.948 | 0.962 | 0.994 | 1.03 | 1.072 | 1.118 | 1.168 |
| 5.507500000000172 | 0.905 | 0.908 | 0.919 | 0.938 | 0.948 | 0.962 | 0.994 | 1.03 | 1.072 | 1.118 | 1.168 |
| 5.510000000000172 | 0.905 | 0.908 | 0.919 | 0.938 | 0.948 | 0.962 | 0.993 | 1.03 | 1.072 | 1.118 | 1.168 |
| 5.512500000000172 | 0.905 | 0.908 | 0.92 | 0.938 | 0.948 | 0.962 | 0.993 | 1.03 | 1.072 | 1.118 | 1.168 |
| 5.515000000000173 | 0.905 | 0.909 | 0.92 | 0.938 | 0.948 | 0.962 | 0.993 | 1.03 | 1.072 | 1.118 | 1.168 |
| 5.517500000000173 | 0.905 | 0.909 | 0.92 | 0.938 | 0.948 | 0.962 | 0.993 | 1.03 | 1.072 | 1.118 | 1.168 |
| 5.520000000000174 | 0.905 | 0.909 | 0.92 | 0.938 | 0.948 | 0.962 | 0.993 | 1.03 | 1.071 | 1.118 | 1.167 |
| 5.522500000000174 | 0.905 | 0.909 | 0.92 | 0.938 | 0.948 | 0.962 | 0.993 | 1.03 | 1.071 | 1.117 | 1.167 |
| 5.525000000000174 | 0.905 | 0.909 | 0.92 | 0.938 | 0.948 | 0.962 | 0.993 | 1.03 | 1.071 | 1.117 | 1.167 |
| 5.527500000000175 | 0.905 | 0.909 | 0.92 | 0.938 | 0.948 | 0.962 | 0.993 | 1.03 | 1.071 | 1.117 | 1.167 |
| 5.530000000000175 | 0.905 | 0.909 | 0.92 | 0.938 | 0.948 | 0.962 | 0.993 | 1.03 | 1.071 | 1.117 | 1.167 |
| 5.532500000000175 | 0.905 | 0.909 | 0.92 | 0.938 | 0.948 | 0.962 | 0.993 | 1.03 | 1.071 | 1.117 | 1.167 |
| 5.535000000000175 | 0.905 | 0.909 | 0.92 | 0.938 | 0.948 | 0.962 | 0.993 | 1.03 | 1.071 | 1.117 | 1.167 |
| 5.537500000000176 | 0.905 | 0.909 | 0.92 | 0.938 | 0.948 | 0.962 | 0.993 | 1.03 | 1.071 | 1.117 | 1.166 |
| 5.540000000000176 | 0.905 | 0.909 | 0.92 | 0.938 | 0.948 | 0.962 | 0.993 | 1.029 | 1.071 | 1.117 | 1.166 |
| 5.542500000000177 | 0.905 | 0.909 | 0.92 | 0.938 | 0.948 | 0.962 | 0.993 | 1.029 | 1.071 | 1.116 | 1.166 |
| 5.545000000000177 | 0.905 | 0.909 | 0.92 | 0.938 | 0.948 | 0.962 | 0.993 | 1.029 | 1.071 | 1.116 | 1.166 |
| 5.547500000000178 | 0.905 | 0.909 | 0.92 | 0.938 | 0.948 | 0.962 | 0.993 | 1.029 | 1.071 | 1.116 | 1.166 |
| 5.550000000000178 | 0.905 | 0.909 | 0.92 | 0.938 | 0.949 | 0.962 | 0.993 | 1.029 | 1.07 | 1.116 | 1.166 |
| 5.552500000000179 | 0.905 | 0.909 | 0.92 | 0.938 | 0.949 | 0.962 | 0.993 | 1.029 | 1.07 | 1.116 | 1.166 |
| 5.55500000000018 | 0.906 | 0.909 | 0.92 | 0.938 | 0.949 | 0.962 | 0.993 | 1.029 | 1.07 | 1.116 | 1.165 |
| 5.55750000000018 | 0.906 | 0.909 | 0.92 | 0.938 | 0.949 | 0.962 | 0.993 | 1.029 | 1.07 | 1.116 | 1.165 |
| 5.56000000000018 | 0.906 | 0.909 | 0.92 | 0.938 | 0.949 | 0.962 | 0.993 | 1.029 | 1.07 | 1.116 | 1.165 |
| 5.56250000000018 | 0.906 | 0.909 | 0.92 | 0.938 | 0.949 | 0.962 | 0.993 | 1.029 | 1.07 | 1.116 | 1.165 |
| 5.565000000000181 | 0.906 | 0.909 | 0.92 | 0.938 | 0.949 | 0.962 | 0.993 | 1.029 | 1.07 | 1.115 | 1.165 |
| 5.567500000000181 | 0.906 | 0.909 | 0.92 | 0.938 | 0.949 | 0.962 | 0.993 | 1.029 | 1.07 | 1.115 | 1.165 |
| 5.570000000000181 | 0.906 | 0.909 | 0.92 | 0.938 | 0.949 | 0.962 | 0.993 | 1.029 | 1.07 | 1.115 | 1.164 |
| 5.572500000000182 | 0.906 | 0.909 | 0.92 | 0.938 | 0.949 | 0.962 | 0.993 | 1.029 | 1.07 | 1.115 | 1.164 |
| 5.575000000000182 | 0.906 | 0.91 | 0.92 | 0.938 | 0.949 | 0.962 | 0.993 | 1.029 | 1.07 | 1.115 | 1.164 |
| 5.577500000000183 | 0.906 | 0.91 | 0.92 | 0.938 | 0.949 | 0.962 | 0.993 | 1.029 | 1.07 | 1.115 | 1.164 |
| 5.580000000000183 | 0.906 | 0.91 | 0.92 | 0.938 | 0.949 | 0.962 | 0.993 | 1.029 | 1.069 | 1.115 | 1.164 |
| 5.582500000000183 | 0.906 | 0.91 | 0.92 | 0.938 | 0.949 | 0.962 | 0.993 | 1.029 | 1.069 | 1.115 | 1.164 |
| 5.585000000000184 | 0.906 | 0.91 | 0.92 | 0.938 | 0.949 | 0.962 | 0.993 | 1.029 | 1.069 | 1.114 | 1.164 |
| 5.587500000000184 | 0.906 | 0.91 | 0.921 | 0.938 | 0.949 | 0.962 | 0.993 | 1.028 | 1.069 | 1.114 | 1.163 |
| 5.590000000000184 | 0.906 | 0.91 | 0.921 | 0.938 | 0.949 | 0.962 | 0.993 | 1.028 | 1.069 | 1.114 | 1.163 |
| 5.592500000000185 | 0.906 | 0.91 | 0.921 | 0.938 | 0.949 | 0.962 | 0.993 | 1.028 | 1.069 | 1.114 | 1.163 |
| 5.595000000000185 | 0.906 | 0.91 | 0.921 | 0.938 | 0.949 | 0.962 | 0.993 | 1.028 | 1.069 | 1.114 | 1.163 |
| 5.597500000000186 | 0.906 | 0.91 | 0.921 | 0.938 | 0.949 | 0.962 | 0.993 | 1.028 | 1.069 | 1.114 | 1.163 |
| 5.600000000000186 | 0.906 | 0.91 | 0.921 | 0.938 | 0.949 | 0.962 | 0.993 | 1.028 | 1.069 | 1.114 | 1.163 |
| 5.602500000000186 | 0.906 | 0.91 | 0.921 | 0.938 | 0.949 | 0.962 | 0.993 | 1.028 | 1.069 | 1.114 | 1.163 |
| 5.605000000000187 | 0.906 | 0.91 | 0.921 | 0.938 | 0.949 | 0.962 | 0.992 | 1.028 | 1.069 | 1.114 | 1.162 |
| 5.607500000000187 | 0.906 | 0.91 | 0.921 | 0.938 | 0.949 | 0.962 | 0.992 | 1.028 | 1.069 | 1.113 | 1.162 |
| 5.610000000000188 | 0.907 | 0.91 | 0.921 | 0.938 | 0.949 | 0.962 | 0.992 | 1.028 | 1.068 | 1.113 | 1.162 |
| 5.612500000000188 | 0.907 | 0.91 | 0.921 | 0.938 | 0.949 | 0.962 | 0.992 | 1.028 | 1.068 | 1.113 | 1.162 |
| 5.615000000000188 | 0.907 | 0.91 | 0.921 | 0.938 | 0.949 | 0.962 | 0.992 | 1.028 | 1.068 | 1.113 | 1.162 |
| 5.617500000000189 | 0.907 | 0.91 | 0.921 | 0.938 | 0.949 | 0.962 | 0.992 | 1.028 | 1.068 | 1.113 | 1.162 |
| 5.620000000000189 | 0.907 | 0.91 | 0.921 | 0.938 | 0.949 | 0.962 | 0.992 | 1.028 | 1.068 | 1.113 | 1.162 |
| 5.62250000000019 | 0.907 | 0.91 | 0.921 | 0.938 | 0.949 | 0.962 | 0.992 | 1.028 | 1.068 | 1.113 | 1.161 |
| 5.62500000000019 | 0.907 | 0.91 | 0.921 | 0.938 | 0.949 | 0.962 | 0.992 | 1.028 | 1.068 | 1.113 | 1.161 |
| 5.62750000000019 | 0.907 | 0.91 | 0.921 | 0.938 | 0.949 | 0.962 | 0.992 | 1.028 | 1.068 | 1.113 | 1.161 |
| 5.630000000000191 | 0.907 | 0.91 | 0.921 | 0.938 | 0.949 | 0.962 | 0.992 | 1.028 | 1.068 | 1.112 | 1.161 |
| 5.632500000000191 | 0.907 | 0.91 | 0.921 | 0.939 | 0.949 | 0.962 | 0.992 | 1.028 | 1.068 | 1.112 | 1.161 |
| 5.635000000000192 | 0.907 | 0.911 | 0.921 | 0.939 | 0.949 | 0.962 | 0.992 | 1.027 | 1.068 | 1.112 | 1.161 |
| 5.637500000000192 | 0.907 | 0.911 | 0.921 | 0.939 | 0.949 | 0.962 | 0.992 | 1.027 | 1.068 | 1.112 | 1.16 |
| 5.640000000000192 | 0.907 | 0.911 | 0.921 | 0.939 | 0.949 | 0.962 | 0.992 | 1.027 | 1.067 | 1.112 | 1.16 |
| 5.642500000000193 | 0.907 | 0.911 | 0.921 | 0.939 | 0.949 | 0.962 | 0.992 | 1.027 | 1.067 | 1.112 | 1.16 |
| 5.645000000000193 | 0.907 | 0.911 | 0.921 | 0.939 | 0.949 | 0.962 | 0.992 | 1.027 | 1.067 | 1.112 | 1.16 |
| 5.647500000000193 | 0.907 | 0.911 | 0.921 | 0.939 | 0.949 | 0.962 | 0.992 | 1.027 | 1.067 | 1.112 | 1.16 |
| 5.650000000000194 | 0.907 | 0.911 | 0.921 | 0.939 | 0.949 | 0.962 | 0.992 | 1.027 | 1.067 | 1.112 | 1.16 |
| 5.652500000000194 | 0.907 | 0.911 | 0.921 | 0.939 | 0.949 | 0.962 | 0.992 | 1.027 | 1.067 | 1.111 | 1.16 |
| 5.655000000000195 | 0.907 | 0.911 | 0.921 | 0.939 | 0.949 | 0.962 | 0.992 | 1.027 | 1.067 | 1.111 | 1.159 |
| 5.657500000000195 | 0.907 | 0.911 | 0.921 | 0.939 | 0.949 | 0.962 | 0.992 | 1.027 | 1.067 | 1.111 | 1.159 |
| 5.660000000000195 | 0.907 | 0.911 | 0.921 | 0.939 | 0.949 | 0.962 | 0.992 | 1.027 | 1.067 | 1.111 | 1.159 |
| 5.662500000000196 | 0.907 | 0.911 | 0.921 | 0.939 | 0.949 | 0.962 | 0.992 | 1.027 | 1.067 | 1.111 | 1.159 |
| 5.665000000000196 | 0.907 | 0.911 | 0.921 | 0.939 | 0.949 | 0.962 | 0.992 | 1.027 | 1.067 | 1.111 | 1.159 |
| 5.667500000000197 | 0.907 | 0.911 | 0.922 | 0.939 | 0.949 | 0.962 | 0.992 | 1.027 | 1.067 | 1.111 | 1.159 |
| 5.670000000000197 | 0.908 | 0.911 | 0.922 | 0.939 | 0.949 | 0.962 | 0.992 | 1.027 | 1.067 | 1.111 | 1.159 |
| 5.672500000000197 | 0.908 | 0.911 | 0.922 | 0.939 | 0.949 | 0.962 | 0.992 | 1.027 | 1.066 | 1.111 | 1.158 |
| 5.675000000000198 | 0.908 | 0.911 | 0.922 | 0.939 | 0.949 | 0.962 | 0.992 | 1.027 | 1.066 | 1.11 | 1.158 |
| 5.677500000000198 | 0.908 | 0.911 | 0.922 | 0.939 | 0.949 | 0.962 | 0.992 | 1.027 | 1.066 | 1.11 | 1.158 |
| 5.680000000000199 | 0.908 | 0.911 | 0.922 | 0.939 | 0.949 | 0.962 | 0.992 | 1.027 | 1.066 | 1.11 | 1.158 |
| 5.682500000000199 | 0.908 | 0.911 | 0.922 | 0.939 | 0.949 | 0.962 | 0.992 | 1.026 | 1.066 | 1.11 | 1.158 |
| 5.685000000000199 | 0.908 | 0.911 | 0.922 | 0.939 | 0.949 | 0.962 | 0.992 | 1.026 | 1.066 | 1.11 | 1.158 |
| 5.6875000000002 | 0.908 | 0.911 | 0.922 | 0.939 | 0.949 | 0.962 | 0.992 | 1.026 | 1.066 | 1.11 | 1.158 |
| 5.6900000000002 | 0.908 | 0.911 | 0.922 | 0.939 | 0.949 | 0.962 | 0.992 | 1.026 | 1.066 | 1.11 | 1.157 |
| 5.692500000000201 | 0.908 | 0.911 | 0.922 | 0.939 | 0.949 | 0.962 | 0.992 | 1.026 | 1.066 | 1.11 | 1.157 |
| 5.695000000000201 | 0.908 | 0.911 | 0.922 | 0.939 | 0.949 | 0.962 | 0.992 | 1.026 | 1.066 | 1.11 | 1.157 |
| 5.697500000000201 | 0.908 | 0.912 | 0.922 | 0.939 | 0.949 | 0.962 | 0.992 | 1.026 | 1.066 | 1.109 | 1.157 |
| 5.700000000000202 | 0.908 | 0.912 | 0.922 | 0.939 | 0.949 | 0.962 | 0.992 | 1.026 | 1.066 | 1.109 | 1.157 |
| 5.702500000000202 | 0.908 | 0.912 | 0.922 | 0.939 | 0.949 | 0.962 | 0.992 | 1.026 | 1.065 | 1.109 | 1.157 |
| 5.705000000000203 | 0.908 | 0.912 | 0.922 | 0.939 | 0.949 | 0.962 | 0.992 | 1.026 | 1.065 | 1.109 | 1.157 |
| 5.707500000000203 | 0.908 | 0.912 | 0.922 | 0.939 | 0.949 | 0.962 | 0.991 | 1.026 | 1.065 | 1.109 | 1.157 |
| 5.710000000000203 | 0.908 | 0.912 | 0.922 | 0.939 | 0.949 | 0.962 | 0.991 | 1.026 | 1.065 | 1.109 | 1.156 |
| 5.712500000000204 | 0.908 | 0.912 | 0.922 | 0.939 | 0.949 | 0.962 | 0.991 | 1.026 | 1.065 | 1.109 | 1.156 |
| 5.715000000000204 | 0.908 | 0.912 | 0.922 | 0.939 | 0.949 | 0.962 | 0.991 | 1.026 | 1.065 | 1.109 | 1.156 |
| 5.717500000000204 | 0.908 | 0.912 | 0.922 | 0.939 | 0.949 | 0.962 | 0.991 | 1.026 | 1.065 | 1.109 | 1.156 |
| 5.720000000000205 | 0.908 | 0.912 | 0.922 | 0.939 | 0.949 | 0.962 | 0.991 | 1.026 | 1.065 | 1.108 | 1.156 |
| 5.722500000000205 | 0.908 | 0.912 | 0.922 | 0.939 | 0.949 | 0.962 | 0.991 | 1.026 | 1.065 | 1.108 | 1.156 |
| 5.725000000000206 | 0.908 | 0.912 | 0.922 | 0.939 | 0.949 | 0.962 | 0.991 | 1.026 | 1.065 | 1.108 | 1.156 |
| 5.727500000000206 | 0.909 | 0.912 | 0.922 | 0.939 | 0.949 | 0.962 | 0.991 | 1.026 | 1.065 | 1.108 | 1.155 |
| 5.730000000000206 | 0.909 | 0.912 | 0.922 | 0.939 | 0.949 | 0.962 | 0.991 | 1.026 | 1.065 | 1.108 | 1.155 |
| 5.732500000000207 | 0.909 | 0.912 | 0.922 | 0.939 | 0.949 | 0.962 | 0.991 | 1.026 | 1.065 | 1.108 | 1.155 |
| 5.735000000000207 | 0.909 | 0.912 | 0.922 | 0.939 | 0.949 | 0.962 | 0.991 | 1.025 | 1.064 | 1.108 | 1.155 |
| 5.737500000000208 | 0.909 | 0.912 | 0.922 | 0.939 | 0.949 | 0.962 | 0.991 | 1.025 | 1.064 | 1.108 | 1.155 |
| 5.740000000000208 | 0.909 | 0.912 | 0.922 | 0.939 | 0.949 | 0.962 | 0.991 | 1.025 | 1.064 | 1.108 | 1.155 |
| 5.742500000000208 | 0.909 | 0.912 | 0.922 | 0.939 | 0.949 | 0.962 | 0.991 | 1.025 | 1.064 | 1.108 | 1.155 |
| 5.745000000000209 | 0.909 | 0.912 | 0.922 | 0.939 | 0.949 | 0.962 | 0.991 | 1.025 | 1.064 | 1.107 | 1.154 |
| 5.747500000000209 | 0.909 | 0.912 | 0.923 | 0.939 | 0.949 | 0.962 | 0.991 | 1.025 | 1.064 | 1.107 | 1.154 |
| 5.75000000000021 | 0.909 | 0.912 | 0.923 | 0.939 | 0.949 | 0.962 | 0.991 | 1.025 | 1.064 | 1.107 | 1.154 |
| 5.75250000000021 | 0.909 | 0.912 | 0.923 | 0.939 | 0.949 | 0.962 | 0.991 | 1.025 | 1.064 | 1.107 | 1.154 |
| 5.75500000000021 | 0.909 | 0.912 | 0.923 | 0.939 | 0.949 | 0.962 | 0.991 | 1.025 | 1.064 | 1.107 | 1.154 |
| 5.757500000000211 | 0.909 | 0.912 | 0.923 | 0.939 | 0.949 | 0.962 | 0.991 | 1.025 | 1.064 | 1.107 | 1.154 |
| 5.760000000000211 | 0.909 | 0.912 | 0.923 | 0.939 | 0.949 | 0.962 | 0.991 | 1.025 | 1.064 | 1.107 | 1.154 |
| 5.762500000000211 | 0.909 | 0.913 | 0.923 | 0.939 | 0.949 | 0.962 | 0.991 | 1.025 | 1.064 | 1.107 | 1.153 |
| 5.765000000000212 | 0.909 | 0.913 | 0.923 | 0.939 | 0.949 | 0.962 | 0.991 | 1.025 | 1.064 | 1.107 | 1.153 |
| 5.767500000000212 | 0.909 | 0.913 | 0.923 | 0.939 | 0.949 | 0.962 | 0.991 | 1.025 | 1.063 | 1.106 | 1.153 |
| 5.770000000000213 | 0.909 | 0.913 | 0.923 | 0.939 | 0.949 | 0.962 | 0.991 | 1.025 | 1.063 | 1.106 | 1.153 |
| 5.772500000000213 | 0.909 | 0.913 | 0.923 | 0.939 | 0.949 | 0.962 | 0.991 | 1.025 | 1.063 | 1.106 | 1.153 |
| 5.775000000000213 | 0.909 | 0.913 | 0.923 | 0.939 | 0.949 | 0.962 | 0.991 | 1.025 | 1.063 | 1.106 | 1.153 |
| 5.777500000000214 | 0.909 | 0.913 | 0.923 | 0.939 | 0.949 | 0.962 | 0.991 | 1.025 | 1.063 | 1.106 | 1.153 |
| 5.780000000000214 | 0.909 | 0.913 | 0.923 | 0.94 | 0.949 | 0.962 | 0.991 | 1.025 | 1.063 | 1.106 | 1.153 |
| 5.782500000000215 | 0.909 | 0.913 | 0.923 | 0.94 | 0.949 | 0.962 | 0.991 | 1.025 | 1.063 | 1.106 | 1.152 |
| 5.785000000000215 | 0.909 | 0.913 | 0.923 | 0.94 | 0.949 | 0.962 | 0.991 | 1.024 | 1.063 | 1.106 | 1.152 |
| 5.787500000000215 | 0.91 | 0.913 | 0.923 | 0.94 | 0.949 | 0.962 | 0.991 | 1.024 | 1.063 | 1.106 | 1.152 |
| 5.790000000000216 | 0.91 | 0.913 | 0.923 | 0.94 | 0.949 | 0.962 | 0.991 | 1.024 | 1.063 | 1.105 | 1.152 |
| 5.792500000000216 | 0.91 | 0.913 | 0.923 | 0.94 | 0.949 | 0.962 | 0.991 | 1.024 | 1.063 | 1.105 | 1.152 |
| 5.795000000000217 | 0.91 | 0.913 | 0.923 | 0.94 | 0.949 | 0.962 | 0.991 | 1.024 | 1.063 | 1.105 | 1.152 |
| 5.797500000000217 | 0.91 | 0.913 | 0.923 | 0.94 | 0.949 | 0.962 | 0.991 | 1.024 | 1.063 | 1.105 | 1.152 |
| 5.800000000000217 | 0.91 | 0.913 | 0.923 | 0.94 | 0.949 | 0.962 | 0.991 | 1.024 | 1.063 | 1.105 | 1.151 |
| 5.802500000000218 | 0.91 | 0.913 | 0.923 | 0.94 | 0.949 | 0.962 | 0.991 | 1.024 | 1.062 | 1.105 | 1.151 |
| 5.805000000000218 | 0.91 | 0.913 | 0.923 | 0.94 | 0.949 | 0.962 | 0.991 | 1.024 | 1.062 | 1.105 | 1.151 |
| 5.807500000000219 | 0.91 | 0.913 | 0.923 | 0.94 | 0.949 | 0.962 | 0.991 | 1.024 | 1.062 | 1.105 | 1.151 |
| 5.810000000000219 | 0.91 | 0.913 | 0.923 | 0.94 | 0.949 | 0.962 | 0.991 | 1.024 | 1.062 | 1.105 | 1.151 |
| 5.812500000000219 | 0.91 | 0.913 | 0.923 | 0.94 | 0.949 | 0.962 | 0.991 | 1.024 | 1.062 | 1.105 | 1.151 |
| 5.81500000000022 | 0.91 | 0.913 | 0.923 | 0.94 | 0.949 | 0.962 | 0.99 | 1.024 | 1.062 | 1.104 | 1.151 |
| 5.81750000000022 | 0.91 | 0.913 | 0.923 | 0.94 | 0.949 | 0.962 | 0.99 | 1.024 | 1.062 | 1.104 | 1.15 |
| 5.820000000000221 | 0.91 | 0.913 | 0.923 | 0.94 | 0.949 | 0.962 | 0.99 | 1.024 | 1.062 | 1.104 | 1.15 |
| 5.822500000000221 | 0.91 | 0.913 | 0.923 | 0.94 | 0.949 | 0.962 | 0.99 | 1.024 | 1.062 | 1.104 | 1.15 |
| 5.825000000000221 | 0.91 | 0.913 | 0.923 | 0.94 | 0.95 | 0.962 | 0.99 | 1.024 | 1.062 | 1.104 | 1.15 |
| 5.827500000000222 | 0.91 | 0.914 | 0.923 | 0.94 | 0.95 | 0.962 | 0.99 | 1.024 | 1.062 | 1.104 | 1.15 |
| 5.830000000000222 | 0.91 | 0.914 | 0.923 | 0.94 | 0.95 | 0.962 | 0.99 | 1.024 | 1.062 | 1.104 | 1.15 |
| 5.832500000000222 | 0.91 | 0.914 | 0.924 | 0.94 | 0.95 | 0.962 | 0.99 | 1.024 | 1.062 | 1.104 | 1.15 |
| 5.835000000000223 | 0.91 | 0.914 | 0.924 | 0.94 | 0.95 | 0.962 | 0.99 | 1.024 | 1.061 | 1.104 | 1.15 |
| 5.837500000000223 | 0.91 | 0.914 | 0.924 | 0.94 | 0.95 | 0.962 | 0.99 | 1.024 | 1.061 | 1.104 | 1.149 |
| 5.840000000000224 | 0.91 | 0.914 | 0.924 | 0.94 | 0.95 | 0.962 | 0.99 | 1.023 | 1.061 | 1.103 | 1.149 |
| 5.842500000000224 | 0.91 | 0.914 | 0.924 | 0.94 | 0.95 | 0.962 | 0.99 | 1.023 | 1.061 | 1.103 | 1.149 |
| 5.845000000000224 | 0.91 | 0.914 | 0.924 | 0.94 | 0.95 | 0.962 | 0.99 | 1.023 | 1.061 | 1.103 | 1.149 |
| 5.847500000000225 | 0.91 | 0.914 | 0.924 | 0.94 | 0.95 | 0.962 | 0.99 | 1.023 | 1.061 | 1.103 | 1.149 |
| 5.850000000000225 | 0.911 | 0.914 | 0.924 | 0.94 | 0.95 | 0.962 | 0.99 | 1.023 | 1.061 | 1.103 | 1.149 |
| 5.852500000000226 | 0.911 | 0.914 | 0.924 | 0.94 | 0.95 | 0.962 | 0.99 | 1.023 | 1.061 | 1.103 | 1.149 |
| 5.855000000000226 | 0.911 | 0.914 | 0.924 | 0.94 | 0.95 | 0.962 | 0.99 | 1.023 | 1.061 | 1.103 | 1.148 |
| 5.857500000000226 | 0.911 | 0.914 | 0.924 | 0.94 | 0.95 | 0.962 | 0.99 | 1.023 | 1.061 | 1.103 | 1.148 |
| 5.860000000000227 | 0.911 | 0.914 | 0.924 | 0.94 | 0.95 | 0.962 | 0.99 | 1.023 | 1.061 | 1.103 | 1.148 |
| 5.862500000000227 | 0.911 | 0.914 | 0.924 | 0.94 | 0.95 | 0.962 | 0.99 | 1.023 | 1.061 | 1.103 | 1.148 |
| 5.865000000000228 | 0.911 | 0.914 | 0.924 | 0.94 | 0.95 | 0.962 | 0.99 | 1.023 | 1.061 | 1.102 | 1.148 |
| 5.867500000000228 | 0.911 | 0.914 | 0.924 | 0.94 | 0.95 | 0.962 | 0.99 | 1.023 | 1.061 | 1.102 | 1.148 |
| 5.870000000000228 | 0.911 | 0.914 | 0.924 | 0.94 | 0.95 | 0.962 | 0.99 | 1.023 | 1.06 | 1.102 | 1.148 |
| 5.872500000000229 | 0.911 | 0.914 | 0.924 | 0.94 | 0.95 | 0.962 | 0.99 | 1.023 | 1.06 | 1.102 | 1.148 |
| 5.87500000000023 | 0.911 | 0.914 | 0.924 | 0.94 | 0.95 | 0.962 | 0.99 | 1.023 | 1.06 | 1.102 | 1.147 |
| 5.877500000000229 | 0.911 | 0.914 | 0.924 | 0.94 | 0.95 | 0.962 | 0.99 | 1.023 | 1.06 | 1.102 | 1.147 |
| 5.88000000000023 | 0.911 | 0.914 | 0.924 | 0.94 | 0.95 | 0.962 | 0.99 | 1.023 | 1.06 | 1.102 | 1.147 |
| 5.88250000000023 | 0.911 | 0.914 | 0.924 | 0.94 | 0.95 | 0.962 | 0.99 | 1.023 | 1.06 | 1.102 | 1.147 |
| 5.885000000000231 | 0.911 | 0.914 | 0.924 | 0.94 | 0.95 | 0.962 | 0.99 | 1.023 | 1.06 | 1.102 | 1.147 |
| 5.887500000000231 | 0.911 | 0.914 | 0.924 | 0.94 | 0.95 | 0.962 | 0.99 | 1.023 | 1.06 | 1.102 | 1.147 |
| 5.890000000000231 | 0.911 | 0.914 | 0.924 | 0.94 | 0.95 | 0.962 | 0.99 | 1.023 | 1.06 | 1.101 | 1.147 |
| 5.892500000000232 | 0.911 | 0.914 | 0.924 | 0.94 | 0.95 | 0.962 | 0.99 | 1.023 | 1.06 | 1.101 | 1.147 |
| 5.895000000000232 | 0.911 | 0.915 | 0.924 | 0.94 | 0.95 | 0.962 | 0.99 | 1.022 | 1.06 | 1.101 | 1.146 |
| 5.897500000000233 | 0.911 | 0.915 | 0.924 | 0.94 | 0.95 | 0.962 | 0.99 | 1.022 | 1.06 | 1.101 | 1.146 |
| 5.900000000000233 | 0.911 | 0.915 | 0.924 | 0.94 | 0.95 | 0.962 | 0.99 | 1.022 | 1.06 | 1.101 | 1.146 |
| 5.902500000000233 | 0.911 | 0.915 | 0.924 | 0.94 | 0.95 | 0.962 | 0.99 | 1.022 | 1.06 | 1.101 | 1.146 |
| 5.905000000000234 | 0.911 | 0.915 | 0.924 | 0.94 | 0.95 | 0.962 | 0.99 | 1.022 | 1.059 | 1.101 | 1.146 |
| 5.907500000000234 | 0.911 | 0.915 | 0.924 | 0.94 | 0.95 | 0.962 | 0.99 | 1.022 | 1.059 | 1.101 | 1.146 |
| 5.910000000000234 | 0.911 | 0.915 | 0.924 | 0.94 | 0.95 | 0.962 | 0.99 | 1.022 | 1.059 | 1.101 | 1.146 |
| 5.912500000000235 | 0.912 | 0.915 | 0.924 | 0.94 | 0.95 | 0.962 | 0.99 | 1.022 | 1.059 | 1.101 | 1.145 |
| 5.915000000000235 | 0.912 | 0.915 | 0.924 | 0.94 | 0.95 | 0.962 | 0.99 | 1.022 | 1.059 | 1.1 | 1.145 |
| 5.917500000000236 | 0.912 | 0.915 | 0.925 | 0.94 | 0.95 | 0.962 | 0.99 | 1.022 | 1.059 | 1.1 | 1.145 |
| 5.920000000000236 | 0.912 | 0.915 | 0.925 | 0.94 | 0.95 | 0.962 | 0.99 | 1.022 | 1.059 | 1.1 | 1.145 |
| 5.922500000000237 | 0.912 | 0.915 | 0.925 | 0.94 | 0.95 | 0.962 | 0.99 | 1.022 | 1.059 | 1.1 | 1.145 |
| 5.925000000000237 | 0.912 | 0.915 | 0.925 | 0.94 | 0.95 | 0.962 | 0.99 | 1.022 | 1.059 | 1.1 | 1.145 |
| 5.927500000000237 | 0.912 | 0.915 | 0.925 | 0.94 | 0.95 | 0.962 | 0.99 | 1.022 | 1.059 | 1.1 | 1.145 |
| 5.930000000000237 | 0.912 | 0.915 | 0.925 | 0.941 | 0.95 | 0.962 | 0.99 | 1.022 | 1.059 | 1.1 | 1.145 |
| 5.932500000000238 | 0.912 | 0.915 | 0.925 | 0.941 | 0.95 | 0.962 | 0.989 | 1.022 | 1.059 | 1.1 | 1.144 |
| 5.935000000000238 | 0.912 | 0.915 | 0.925 | 0.941 | 0.95 | 0.962 | 0.989 | 1.022 | 1.059 | 1.1 | 1.144 |
| 5.937500000000239 | 0.912 | 0.915 | 0.925 | 0.941 | 0.95 | 0.962 | 0.989 | 1.022 | 1.059 | 1.1 | 1.144 |
| 5.94000000000024 | 0.912 | 0.915 | 0.925 | 0.941 | 0.95 | 0.962 | 0.989 | 1.022 | 1.058 | 1.099 | 1.144 |
| 5.94250000000024 | 0.912 | 0.915 | 0.925 | 0.941 | 0.95 | 0.962 | 0.989 | 1.022 | 1.058 | 1.099 | 1.144 |
| 5.94500000000024 | 0.912 | 0.915 | 0.925 | 0.941 | 0.95 | 0.962 | 0.989 | 1.022 | 1.058 | 1.099 | 1.144 |
| 5.94750000000024 | 0.912 | 0.915 | 0.925 | 0.941 | 0.95 | 0.962 | 0.989 | 1.022 | 1.058 | 1.099 | 1.144 |
| 5.950000000000241 | 0.912 | 0.915 | 0.925 | 0.941 | 0.95 | 0.962 | 0.989 | 1.021 | 1.058 | 1.099 | 1.144 |
| 5.952500000000241 | 0.912 | 0.915 | 0.925 | 0.941 | 0.95 | 0.962 | 0.989 | 1.021 | 1.058 | 1.099 | 1.143 |
| 5.955000000000242 | 0.912 | 0.915 | 0.925 | 0.941 | 0.95 | 0.962 | 0.989 | 1.021 | 1.058 | 1.099 | 1.143 |
| 5.957500000000242 | 0.912 | 0.915 | 0.925 | 0.941 | 0.95 | 0.962 | 0.989 | 1.021 | 1.058 | 1.099 | 1.143 |
| 5.960000000000242 | 0.912 | 0.915 | 0.925 | 0.941 | 0.95 | 0.962 | 0.989 | 1.021 | 1.058 | 1.099 | 1.143 |
| 5.962500000000243 | 0.912 | 0.915 | 0.925 | 0.941 | 0.95 | 0.962 | 0.989 | 1.021 | 1.058 | 1.099 | 1.143 |
| 5.965000000000243 | 0.912 | 0.916 | 0.925 | 0.941 | 0.95 | 0.962 | 0.989 | 1.021 | 1.058 | 1.098 | 1.143 |
| 5.967500000000244 | 0.912 | 0.916 | 0.925 | 0.941 | 0.95 | 0.962 | 0.989 | 1.021 | 1.058 | 1.098 | 1.143 |
| 5.970000000000244 | 0.912 | 0.916 | 0.925 | 0.941 | 0.95 | 0.962 | 0.989 | 1.021 | 1.058 | 1.098 | 1.143 |
| 5.972500000000244 | 0.912 | 0.916 | 0.925 | 0.941 | 0.95 | 0.962 | 0.989 | 1.021 | 1.058 | 1.098 | 1.142 |
| 5.975000000000244 | 0.912 | 0.916 | 0.925 | 0.941 | 0.95 | 0.962 | 0.989 | 1.021 | 1.058 | 1.098 | 1.142 |
| 5.977500000000245 | 0.913 | 0.916 | 0.925 | 0.941 | 0.95 | 0.962 | 0.989 | 1.021 | 1.057 | 1.098 | 1.142 |
| 5.980000000000245 | 0.913 | 0.916 | 0.925 | 0.941 | 0.95 | 0.962 | 0.989 | 1.021 | 1.057 | 1.098 | 1.142 |
| 5.982500000000246 | 0.913 | 0.916 | 0.925 | 0.941 | 0.95 | 0.962 | 0.989 | 1.021 | 1.057 | 1.098 | 1.142 |
| 5.985000000000246 | 0.913 | 0.916 | 0.925 | 0.941 | 0.95 | 0.962 | 0.989 | 1.021 | 1.057 | 1.098 | 1.142 |
| 5.987500000000247 | 0.913 | 0.916 | 0.925 | 0.941 | 0.95 | 0.962 | 0.989 | 1.021 | 1.057 | 1.098 | 1.142 |
| 5.990000000000247 | 0.913 | 0.916 | 0.925 | 0.941 | 0.95 | 0.962 | 0.989 | 1.021 | 1.057 | 1.098 | 1.142 |
| 5.992500000000247 | 0.913 | 0.916 | 0.925 | 0.941 | 0.95 | 0.962 | 0.989 | 1.021 | 1.057 | 1.097 | 1.141 |
| 5.995000000000248 | 0.913 | 0.916 | 0.925 | 0.941 | 0.95 | 0.962 | 0.989 | 1.021 | 1.057 | 1.097 | 1.141 |
| 5.997500000000248 | 0.913 | 0.916 | 0.925 | 0.941 | 0.95 | 0.962 | 0.989 | 1.021 | 1.057 | 1.097 | 1.141 |
| 6.000000000000249 | 0.913 | 0.916 | 0.925 | 0.941 | 0.95 | 0.962 | 0.989 | 1.021 | 1.057 | 1.097 | 1.141 |